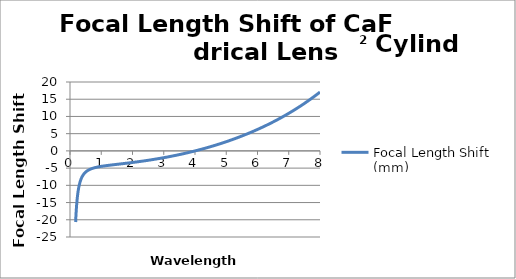
| Category | Focal Length Shift (mm) |
|---|---|
| 0.18 | -20.672 |
| 0.181 | -20.471 |
| 0.182 | -20.273 |
| 0.183 | -20.08 |
| 0.184 | -19.89 |
| 0.185 | -19.704 |
| 0.186 | -19.521 |
| 0.187 | -19.341 |
| 0.188 | -19.165 |
| 0.189 | -18.992 |
| 0.19 | -18.822 |
| 0.191 | -18.655 |
| 0.192 | -18.491 |
| 0.193 | -18.33 |
| 0.194 | -18.172 |
| 0.195 | -18.017 |
| 0.196 | -17.864 |
| 0.197 | -17.714 |
| 0.198 | -17.566 |
| 0.199 | -17.421 |
| 0.2 | -17.279 |
| 0.201 | -17.138 |
| 0.202 | -17.001 |
| 0.203 | -16.865 |
| 0.204 | -16.732 |
| 0.205 | -16.6 |
| 0.206 | -16.471 |
| 0.207 | -16.344 |
| 0.208 | -16.219 |
| 0.209 | -16.096 |
| 0.21 | -15.975 |
| 0.211 | -15.856 |
| 0.212 | -15.739 |
| 0.213 | -15.623 |
| 0.214 | -15.51 |
| 0.215 | -15.398 |
| 0.216 | -15.288 |
| 0.217 | -15.179 |
| 0.218 | -15.072 |
| 0.219 | -14.967 |
| 0.22 | -14.863 |
| 0.221 | -14.761 |
| 0.222 | -14.66 |
| 0.223 | -14.561 |
| 0.224 | -14.463 |
| 0.225 | -14.367 |
| 0.226 | -14.272 |
| 0.227 | -14.178 |
| 0.228 | -14.086 |
| 0.229 | -13.995 |
| 0.23 | -13.905 |
| 0.231 | -13.817 |
| 0.232 | -13.73 |
| 0.233 | -13.644 |
| 0.234 | -13.559 |
| 0.235 | -13.475 |
| 0.236 | -13.393 |
| 0.237 | -13.311 |
| 0.238 | -13.231 |
| 0.239 | -13.152 |
| 0.24 | -13.074 |
| 0.241 | -12.997 |
| 0.242 | -12.921 |
| 0.243 | -12.846 |
| 0.244 | -12.772 |
| 0.245 | -12.698 |
| 0.246 | -12.626 |
| 0.247 | -12.555 |
| 0.248 | -12.485 |
| 0.249 | -12.415 |
| 0.25 | -12.347 |
| 0.251 | -12.279 |
| 0.252 | -12.213 |
| 0.253 | -12.147 |
| 0.254 | -12.081 |
| 0.255 | -12.017 |
| 0.256 | -11.954 |
| 0.257 | -11.891 |
| 0.258 | -11.829 |
| 0.259 | -11.768 |
| 0.26 | -11.707 |
| 0.261 | -11.648 |
| 0.262 | -11.589 |
| 0.263 | -11.531 |
| 0.264 | -11.473 |
| 0.265 | -11.416 |
| 0.266 | -11.36 |
| 0.267 | -11.304 |
| 0.268 | -11.249 |
| 0.269 | -11.195 |
| 0.27 | -11.142 |
| 0.271 | -11.089 |
| 0.272 | -11.036 |
| 0.273 | -10.985 |
| 0.274 | -10.933 |
| 0.275 | -10.883 |
| 0.276 | -10.833 |
| 0.277 | -10.783 |
| 0.278 | -10.734 |
| 0.279 | -10.686 |
| 0.28 | -10.638 |
| 0.281 | -10.591 |
| 0.282 | -10.544 |
| 0.283 | -10.498 |
| 0.284 | -10.452 |
| 0.285 | -10.407 |
| 0.286 | -10.363 |
| 0.287 | -10.318 |
| 0.288 | -10.275 |
| 0.289 | -10.231 |
| 0.29 | -10.189 |
| 0.291 | -10.146 |
| 0.292 | -10.104 |
| 0.293 | -10.063 |
| 0.294 | -10.022 |
| 0.295 | -9.981 |
| 0.296 | -9.941 |
| 0.297 | -9.902 |
| 0.298 | -9.862 |
| 0.299 | -9.823 |
| 0.3 | -9.785 |
| 0.301 | -9.747 |
| 0.302 | -9.709 |
| 0.303 | -9.672 |
| 0.304 | -9.635 |
| 0.305 | -9.598 |
| 0.306 | -9.562 |
| 0.307 | -9.526 |
| 0.308 | -9.491 |
| 0.309 | -9.456 |
| 0.31 | -9.421 |
| 0.311 | -9.387 |
| 0.312 | -9.352 |
| 0.313 | -9.319 |
| 0.314 | -9.285 |
| 0.315 | -9.252 |
| 0.316 | -9.22 |
| 0.317 | -9.187 |
| 0.318 | -9.155 |
| 0.319 | -9.123 |
| 0.32 | -9.092 |
| 0.321 | -9.061 |
| 0.322 | -9.03 |
| 0.323 | -8.999 |
| 0.324 | -8.969 |
| 0.325 | -8.939 |
| 0.326 | -8.909 |
| 0.327 | -8.88 |
| 0.328 | -8.85 |
| 0.329 | -8.822 |
| 0.33 | -8.793 |
| 0.331 | -8.765 |
| 0.332 | -8.736 |
| 0.333 | -8.709 |
| 0.334 | -8.681 |
| 0.335 | -8.654 |
| 0.336 | -8.627 |
| 0.337 | -8.6 |
| 0.338 | -8.573 |
| 0.339 | -8.547 |
| 0.34 | -8.521 |
| 0.341 | -8.495 |
| 0.342 | -8.469 |
| 0.343 | -8.444 |
| 0.344 | -8.419 |
| 0.345 | -8.394 |
| 0.346 | -8.369 |
| 0.347 | -8.344 |
| 0.348 | -8.32 |
| 0.349 | -8.296 |
| 0.35 | -8.272 |
| 0.351 | -8.248 |
| 0.352 | -8.225 |
| 0.353 | -8.202 |
| 0.354 | -8.179 |
| 0.355 | -8.156 |
| 0.356 | -8.133 |
| 0.357 | -8.111 |
| 0.358 | -8.088 |
| 0.359 | -8.066 |
| 0.36 | -8.044 |
| 0.361 | -8.023 |
| 0.362 | -8.001 |
| 0.363 | -7.98 |
| 0.364 | -7.958 |
| 0.365 | -7.937 |
| 0.366 | -7.917 |
| 0.367 | -7.896 |
| 0.368 | -7.875 |
| 0.369 | -7.855 |
| 0.37 | -7.835 |
| 0.371 | -7.815 |
| 0.372 | -7.795 |
| 0.373 | -7.776 |
| 0.374 | -7.756 |
| 0.375 | -7.737 |
| 0.376 | -7.717 |
| 0.377 | -7.698 |
| 0.378 | -7.68 |
| 0.379 | -7.661 |
| 0.38 | -7.642 |
| 0.381 | -7.624 |
| 0.382 | -7.606 |
| 0.383 | -7.587 |
| 0.384 | -7.569 |
| 0.385 | -7.552 |
| 0.386 | -7.534 |
| 0.387 | -7.516 |
| 0.388 | -7.499 |
| 0.389 | -7.481 |
| 0.39 | -7.464 |
| 0.391 | -7.447 |
| 0.392 | -7.43 |
| 0.393 | -7.414 |
| 0.394 | -7.397 |
| 0.395 | -7.38 |
| 0.396 | -7.364 |
| 0.397 | -7.348 |
| 0.398 | -7.332 |
| 0.399 | -7.316 |
| 0.4 | -7.3 |
| 0.401 | -7.284 |
| 0.402 | -7.268 |
| 0.403 | -7.253 |
| 0.404 | -7.237 |
| 0.405 | -7.222 |
| 0.406 | -7.207 |
| 0.407 | -7.192 |
| 0.408 | -7.177 |
| 0.409 | -7.162 |
| 0.41 | -7.147 |
| 0.411 | -7.132 |
| 0.412 | -7.118 |
| 0.413 | -7.103 |
| 0.414 | -7.089 |
| 0.415 | -7.075 |
| 0.416 | -7.061 |
| 0.417 | -7.047 |
| 0.418 | -7.033 |
| 0.419 | -7.019 |
| 0.42 | -7.005 |
| 0.421 | -6.991 |
| 0.422 | -6.978 |
| 0.423 | -6.964 |
| 0.424 | -6.951 |
| 0.425 | -6.938 |
| 0.426 | -6.925 |
| 0.427 | -6.912 |
| 0.428 | -6.899 |
| 0.429 | -6.886 |
| 0.43 | -6.873 |
| 0.431 | -6.86 |
| 0.432 | -6.848 |
| 0.433 | -6.835 |
| 0.434 | -6.823 |
| 0.435 | -6.81 |
| 0.436 | -6.798 |
| 0.437 | -6.786 |
| 0.438 | -6.774 |
| 0.439 | -6.762 |
| 0.44 | -6.75 |
| 0.441 | -6.738 |
| 0.442 | -6.726 |
| 0.443 | -6.714 |
| 0.444 | -6.703 |
| 0.445 | -6.691 |
| 0.446 | -6.68 |
| 0.447 | -6.668 |
| 0.448 | -6.657 |
| 0.449 | -6.646 |
| 0.45 | -6.635 |
| 0.451 | -6.623 |
| 0.452 | -6.612 |
| 0.453 | -6.601 |
| 0.454 | -6.591 |
| 0.455 | -6.58 |
| 0.456 | -6.569 |
| 0.457 | -6.558 |
| 0.458 | -6.548 |
| 0.459 | -6.537 |
| 0.46 | -6.527 |
| 0.461 | -6.516 |
| 0.462 | -6.506 |
| 0.463 | -6.496 |
| 0.464 | -6.486 |
| 0.465 | -6.475 |
| 0.466 | -6.465 |
| 0.467 | -6.455 |
| 0.468 | -6.445 |
| 0.469 | -6.436 |
| 0.47 | -6.426 |
| 0.471 | -6.416 |
| 0.472 | -6.406 |
| 0.473 | -6.397 |
| 0.474 | -6.387 |
| 0.475 | -6.378 |
| 0.476 | -6.368 |
| 0.477 | -6.359 |
| 0.478 | -6.349 |
| 0.479 | -6.34 |
| 0.48 | -6.331 |
| 0.481 | -6.322 |
| 0.482 | -6.312 |
| 0.483 | -6.303 |
| 0.484 | -6.294 |
| 0.485 | -6.285 |
| 0.486 | -6.277 |
| 0.487 | -6.268 |
| 0.488 | -6.259 |
| 0.489 | -6.25 |
| 0.49 | -6.242 |
| 0.491 | -6.233 |
| 0.492 | -6.224 |
| 0.493 | -6.216 |
| 0.494 | -6.207 |
| 0.495 | -6.199 |
| 0.496 | -6.19 |
| 0.497 | -6.182 |
| 0.498 | -6.174 |
| 0.499 | -6.166 |
| 0.5 | -6.157 |
| 0.501 | -6.149 |
| 0.502 | -6.141 |
| 0.503 | -6.133 |
| 0.504 | -6.125 |
| 0.505 | -6.117 |
| 0.506 | -6.109 |
| 0.507 | -6.101 |
| 0.508 | -6.094 |
| 0.509 | -6.086 |
| 0.51 | -6.078 |
| 0.511 | -6.07 |
| 0.512 | -6.063 |
| 0.513 | -6.055 |
| 0.514 | -6.048 |
| 0.515 | -6.04 |
| 0.516 | -6.033 |
| 0.517 | -6.025 |
| 0.518 | -6.018 |
| 0.519 | -6.01 |
| 0.52 | -6.003 |
| 0.521 | -5.996 |
| 0.522 | -5.989 |
| 0.523 | -5.981 |
| 0.524 | -5.974 |
| 0.525 | -5.967 |
| 0.526 | -5.96 |
| 0.527 | -5.953 |
| 0.528 | -5.946 |
| 0.529 | -5.939 |
| 0.53 | -5.932 |
| 0.531 | -5.925 |
| 0.532 | -5.919 |
| 0.533 | -5.912 |
| 0.534 | -5.905 |
| 0.535 | -5.898 |
| 0.536 | -5.892 |
| 0.537 | -5.885 |
| 0.538 | -5.878 |
| 0.539 | -5.872 |
| 0.54 | -5.865 |
| 0.541 | -5.859 |
| 0.542 | -5.852 |
| 0.543 | -5.846 |
| 0.544 | -5.839 |
| 0.545 | -5.833 |
| 0.546 | -5.827 |
| 0.547 | -5.82 |
| 0.548 | -5.814 |
| 0.549 | -5.808 |
| 0.55 | -5.801 |
| 0.551 | -5.795 |
| 0.552 | -5.789 |
| 0.553 | -5.783 |
| 0.554 | -5.777 |
| 0.555 | -5.771 |
| 0.556 | -5.765 |
| 0.557 | -5.759 |
| 0.558 | -5.753 |
| 0.559 | -5.747 |
| 0.56 | -5.741 |
| 0.561 | -5.735 |
| 0.562 | -5.729 |
| 0.563 | -5.724 |
| 0.564 | -5.718 |
| 0.565 | -5.712 |
| 0.566 | -5.706 |
| 0.567 | -5.701 |
| 0.568 | -5.695 |
| 0.569 | -5.689 |
| 0.57 | -5.684 |
| 0.571 | -5.678 |
| 0.572 | -5.672 |
| 0.573 | -5.667 |
| 0.574 | -5.661 |
| 0.575 | -5.656 |
| 0.576 | -5.65 |
| 0.577 | -5.645 |
| 0.578 | -5.64 |
| 0.579 | -5.634 |
| 0.58 | -5.629 |
| 0.581 | -5.624 |
| 0.582 | -5.618 |
| 0.583 | -5.613 |
| 0.584 | -5.608 |
| 0.585 | -5.603 |
| 0.586 | -5.597 |
| 0.587 | -5.592 |
| 0.588 | -5.587 |
| 0.589 | -5.582 |
| 0.59 | -5.577 |
| 0.591 | -5.572 |
| 0.592 | -5.567 |
| 0.593 | -5.562 |
| 0.594 | -5.557 |
| 0.595 | -5.552 |
| 0.596 | -5.547 |
| 0.597 | -5.542 |
| 0.598 | -5.537 |
| 0.599 | -5.532 |
| 0.6 | -5.527 |
| 0.601 | -5.522 |
| 0.602 | -5.518 |
| 0.603 | -5.513 |
| 0.604 | -5.508 |
| 0.605 | -5.503 |
| 0.606 | -5.498 |
| 0.607 | -5.494 |
| 0.608 | -5.489 |
| 0.609 | -5.484 |
| 0.61 | -5.48 |
| 0.611 | -5.475 |
| 0.612 | -5.471 |
| 0.613 | -5.466 |
| 0.614 | -5.461 |
| 0.615 | -5.457 |
| 0.616 | -5.452 |
| 0.617 | -5.448 |
| 0.618 | -5.443 |
| 0.619 | -5.439 |
| 0.62 | -5.434 |
| 0.621 | -5.43 |
| 0.622 | -5.426 |
| 0.623 | -5.421 |
| 0.624 | -5.417 |
| 0.625 | -5.413 |
| 0.626 | -5.408 |
| 0.627 | -5.404 |
| 0.628 | -5.4 |
| 0.629 | -5.395 |
| 0.63 | -5.391 |
| 0.631 | -5.387 |
| 0.632 | -5.383 |
| 0.633 | -5.378 |
| 0.634 | -5.374 |
| 0.635 | -5.37 |
| 0.636 | -5.366 |
| 0.637 | -5.362 |
| 0.638 | -5.358 |
| 0.639 | -5.354 |
| 0.64 | -5.35 |
| 0.641 | -5.346 |
| 0.642 | -5.341 |
| 0.643 | -5.337 |
| 0.644 | -5.333 |
| 0.645 | -5.329 |
| 0.646 | -5.325 |
| 0.647 | -5.322 |
| 0.648 | -5.318 |
| 0.649 | -5.314 |
| 0.65 | -5.31 |
| 0.651 | -5.306 |
| 0.652 | -5.302 |
| 0.653 | -5.298 |
| 0.654 | -5.294 |
| 0.655 | -5.29 |
| 0.656 | -5.287 |
| 0.657 | -5.283 |
| 0.658 | -5.279 |
| 0.659 | -5.275 |
| 0.66 | -5.272 |
| 0.661 | -5.268 |
| 0.662 | -5.264 |
| 0.663 | -5.26 |
| 0.664 | -5.257 |
| 0.665 | -5.253 |
| 0.666 | -5.249 |
| 0.667 | -5.246 |
| 0.668 | -5.242 |
| 0.669 | -5.238 |
| 0.67 | -5.235 |
| 0.671 | -5.231 |
| 0.672 | -5.228 |
| 0.673 | -5.224 |
| 0.674 | -5.221 |
| 0.675 | -5.217 |
| 0.676 | -5.214 |
| 0.677 | -5.21 |
| 0.678 | -5.207 |
| 0.679 | -5.203 |
| 0.68 | -5.2 |
| 0.681 | -5.196 |
| 0.682 | -5.193 |
| 0.683 | -5.189 |
| 0.684 | -5.186 |
| 0.685 | -5.182 |
| 0.686 | -5.179 |
| 0.687 | -5.176 |
| 0.688 | -5.172 |
| 0.689 | -5.169 |
| 0.69 | -5.166 |
| 0.691 | -5.162 |
| 0.692 | -5.159 |
| 0.693 | -5.156 |
| 0.694 | -5.152 |
| 0.695 | -5.149 |
| 0.696 | -5.146 |
| 0.697 | -5.143 |
| 0.698 | -5.139 |
| 0.699 | -5.136 |
| 0.7 | -5.133 |
| 0.701 | -5.13 |
| 0.702 | -5.127 |
| 0.703 | -5.123 |
| 0.704 | -5.12 |
| 0.705 | -5.117 |
| 0.706 | -5.114 |
| 0.707 | -5.111 |
| 0.708 | -5.108 |
| 0.709 | -5.105 |
| 0.71 | -5.102 |
| 0.711 | -5.098 |
| 0.712 | -5.095 |
| 0.713 | -5.092 |
| 0.714 | -5.089 |
| 0.715 | -5.086 |
| 0.716 | -5.083 |
| 0.717 | -5.08 |
| 0.718 | -5.077 |
| 0.719 | -5.074 |
| 0.72 | -5.071 |
| 0.721 | -5.068 |
| 0.722 | -5.065 |
| 0.723 | -5.062 |
| 0.724 | -5.059 |
| 0.725 | -5.056 |
| 0.726 | -5.053 |
| 0.727 | -5.05 |
| 0.728 | -5.048 |
| 0.729 | -5.045 |
| 0.73 | -5.042 |
| 0.731 | -5.039 |
| 0.732 | -5.036 |
| 0.733 | -5.033 |
| 0.734 | -5.03 |
| 0.735 | -5.028 |
| 0.736 | -5.025 |
| 0.737 | -5.022 |
| 0.738 | -5.019 |
| 0.739 | -5.016 |
| 0.74 | -5.013 |
| 0.741 | -5.011 |
| 0.742 | -5.008 |
| 0.743 | -5.005 |
| 0.744 | -5.002 |
| 0.745 | -5 |
| 0.746 | -4.997 |
| 0.747 | -4.994 |
| 0.748 | -4.991 |
| 0.749 | -4.989 |
| 0.75 | -4.986 |
| 0.751 | -4.983 |
| 0.752 | -4.981 |
| 0.753 | -4.978 |
| 0.754 | -4.975 |
| 0.755 | -4.973 |
| 0.756 | -4.97 |
| 0.757 | -4.967 |
| 0.758 | -4.965 |
| 0.759 | -4.962 |
| 0.76 | -4.96 |
| 0.761 | -4.957 |
| 0.762 | -4.954 |
| 0.763 | -4.952 |
| 0.764 | -4.949 |
| 0.765 | -4.947 |
| 0.766 | -4.944 |
| 0.767 | -4.941 |
| 0.768 | -4.939 |
| 0.769 | -4.936 |
| 0.77 | -4.934 |
| 0.771 | -4.931 |
| 0.772 | -4.929 |
| 0.773 | -4.926 |
| 0.774 | -4.924 |
| 0.775 | -4.921 |
| 0.776 | -4.919 |
| 0.777 | -4.916 |
| 0.778 | -4.914 |
| 0.779 | -4.911 |
| 0.78 | -4.909 |
| 0.781 | -4.906 |
| 0.782 | -4.904 |
| 0.783 | -4.902 |
| 0.784 | -4.899 |
| 0.785 | -4.897 |
| 0.786 | -4.894 |
| 0.787 | -4.892 |
| 0.788 | -4.89 |
| 0.789 | -4.887 |
| 0.79 | -4.885 |
| 0.791 | -4.882 |
| 0.792 | -4.88 |
| 0.793 | -4.878 |
| 0.794 | -4.875 |
| 0.795 | -4.873 |
| 0.796 | -4.871 |
| 0.797 | -4.868 |
| 0.798 | -4.866 |
| 0.799 | -4.864 |
| 0.8 | -4.861 |
| 0.801 | -4.859 |
| 0.802 | -4.857 |
| 0.803 | -4.854 |
| 0.804 | -4.852 |
| 0.805 | -4.85 |
| 0.806 | -4.848 |
| 0.807 | -4.845 |
| 0.808 | -4.843 |
| 0.809 | -4.841 |
| 0.81 | -4.839 |
| 0.811 | -4.836 |
| 0.812 | -4.834 |
| 0.813 | -4.832 |
| 0.814 | -4.83 |
| 0.815 | -4.827 |
| 0.816 | -4.825 |
| 0.817 | -4.823 |
| 0.818 | -4.821 |
| 0.819 | -4.819 |
| 0.82 | -4.816 |
| 0.821 | -4.814 |
| 0.822 | -4.812 |
| 0.823 | -4.81 |
| 0.824 | -4.808 |
| 0.825 | -4.806 |
| 0.826 | -4.803 |
| 0.827 | -4.801 |
| 0.828 | -4.799 |
| 0.829 | -4.797 |
| 0.83 | -4.795 |
| 0.831 | -4.793 |
| 0.832 | -4.791 |
| 0.833 | -4.788 |
| 0.834 | -4.786 |
| 0.835 | -4.784 |
| 0.836 | -4.782 |
| 0.837 | -4.78 |
| 0.838 | -4.778 |
| 0.839 | -4.776 |
| 0.84 | -4.774 |
| 0.841 | -4.772 |
| 0.842 | -4.77 |
| 0.843 | -4.768 |
| 0.844 | -4.766 |
| 0.845 | -4.764 |
| 0.846 | -4.762 |
| 0.847 | -4.759 |
| 0.848 | -4.757 |
| 0.849 | -4.755 |
| 0.85 | -4.753 |
| 0.851 | -4.751 |
| 0.852 | -4.749 |
| 0.853 | -4.747 |
| 0.854 | -4.745 |
| 0.855 | -4.743 |
| 0.856 | -4.741 |
| 0.857 | -4.739 |
| 0.858 | -4.737 |
| 0.859 | -4.735 |
| 0.86 | -4.733 |
| 0.861 | -4.731 |
| 0.862 | -4.73 |
| 0.863 | -4.728 |
| 0.864 | -4.726 |
| 0.865 | -4.724 |
| 0.866 | -4.722 |
| 0.867 | -4.72 |
| 0.868 | -4.718 |
| 0.869 | -4.716 |
| 0.87 | -4.714 |
| 0.871 | -4.712 |
| 0.872 | -4.71 |
| 0.873 | -4.708 |
| 0.874 | -4.706 |
| 0.875 | -4.704 |
| 0.876 | -4.703 |
| 0.877 | -4.701 |
| 0.878 | -4.699 |
| 0.879 | -4.697 |
| 0.88 | -4.695 |
| 0.881 | -4.693 |
| 0.882 | -4.691 |
| 0.883 | -4.689 |
| 0.884 | -4.688 |
| 0.885 | -4.686 |
| 0.886 | -4.684 |
| 0.887 | -4.682 |
| 0.888 | -4.68 |
| 0.889 | -4.678 |
| 0.89 | -4.676 |
| 0.891 | -4.675 |
| 0.892 | -4.673 |
| 0.893 | -4.671 |
| 0.894 | -4.669 |
| 0.895 | -4.667 |
| 0.896 | -4.666 |
| 0.897 | -4.664 |
| 0.898 | -4.662 |
| 0.899 | -4.66 |
| 0.9 | -4.658 |
| 0.901 | -4.657 |
| 0.902 | -4.655 |
| 0.903 | -4.653 |
| 0.904 | -4.651 |
| 0.905 | -4.649 |
| 0.906 | -4.648 |
| 0.907 | -4.646 |
| 0.908 | -4.644 |
| 0.909 | -4.642 |
| 0.91 | -4.641 |
| 0.911 | -4.639 |
| 0.912 | -4.637 |
| 0.913 | -4.635 |
| 0.914 | -4.634 |
| 0.915 | -4.632 |
| 0.916 | -4.63 |
| 0.917 | -4.628 |
| 0.918 | -4.627 |
| 0.919 | -4.625 |
| 0.92 | -4.623 |
| 0.921 | -4.622 |
| 0.922 | -4.62 |
| 0.923 | -4.618 |
| 0.924 | -4.616 |
| 0.925 | -4.615 |
| 0.926 | -4.613 |
| 0.927 | -4.611 |
| 0.928 | -4.61 |
| 0.929 | -4.608 |
| 0.93 | -4.606 |
| 0.931 | -4.605 |
| 0.932 | -4.603 |
| 0.933 | -4.601 |
| 0.934 | -4.6 |
| 0.935 | -4.598 |
| 0.936 | -4.596 |
| 0.937 | -4.595 |
| 0.938 | -4.593 |
| 0.939 | -4.591 |
| 0.94 | -4.59 |
| 0.941 | -4.588 |
| 0.942 | -4.586 |
| 0.943 | -4.585 |
| 0.944 | -4.583 |
| 0.945 | -4.581 |
| 0.946 | -4.58 |
| 0.947 | -4.578 |
| 0.948 | -4.577 |
| 0.949 | -4.575 |
| 0.95 | -4.573 |
| 0.951 | -4.572 |
| 0.952 | -4.57 |
| 0.953 | -4.568 |
| 0.954 | -4.567 |
| 0.955 | -4.565 |
| 0.956 | -4.564 |
| 0.957 | -4.562 |
| 0.958 | -4.56 |
| 0.959 | -4.559 |
| 0.96 | -4.557 |
| 0.961 | -4.556 |
| 0.962 | -4.554 |
| 0.963 | -4.553 |
| 0.964 | -4.551 |
| 0.965 | -4.549 |
| 0.966 | -4.548 |
| 0.967 | -4.546 |
| 0.968 | -4.545 |
| 0.969 | -4.543 |
| 0.97 | -4.542 |
| 0.971 | -4.54 |
| 0.972 | -4.538 |
| 0.973 | -4.537 |
| 0.974 | -4.535 |
| 0.975 | -4.534 |
| 0.976 | -4.532 |
| 0.977 | -4.531 |
| 0.978 | -4.529 |
| 0.979 | -4.528 |
| 0.98 | -4.526 |
| 0.981 | -4.525 |
| 0.982 | -4.523 |
| 0.983 | -4.522 |
| 0.984 | -4.52 |
| 0.985 | -4.519 |
| 0.986 | -4.517 |
| 0.987 | -4.515 |
| 0.988 | -4.514 |
| 0.989 | -4.512 |
| 0.99 | -4.511 |
| 0.991 | -4.509 |
| 0.992 | -4.508 |
| 0.993 | -4.506 |
| 0.994 | -4.505 |
| 0.995 | -4.503 |
| 0.996 | -4.502 |
| 0.997 | -4.5 |
| 0.998 | -4.499 |
| 0.999 | -4.498 |
| 1.0 | -4.496 |
| 1.001 | -4.495 |
| 1.002 | -4.493 |
| 1.003 | -4.492 |
| 1.004 | -4.49 |
| 1.005 | -4.489 |
| 1.006 | -4.487 |
| 1.007 | -4.486 |
| 1.008 | -4.484 |
| 1.009 | -4.483 |
| 1.01 | -4.481 |
| 1.011 | -4.48 |
| 1.012 | -4.478 |
| 1.013 | -4.477 |
| 1.014 | -4.476 |
| 1.015 | -4.474 |
| 1.016 | -4.473 |
| 1.017 | -4.471 |
| 1.018 | -4.47 |
| 1.019 | -4.468 |
| 1.02 | -4.467 |
| 1.021 | -4.465 |
| 1.022 | -4.464 |
| 1.023 | -4.463 |
| 1.024 | -4.461 |
| 1.025 | -4.46 |
| 1.026 | -4.458 |
| 1.027 | -4.457 |
| 1.028 | -4.455 |
| 1.029 | -4.454 |
| 1.03 | -4.453 |
| 1.031 | -4.451 |
| 1.032 | -4.45 |
| 1.033 | -4.448 |
| 1.034 | -4.447 |
| 1.035 | -4.446 |
| 1.036 | -4.444 |
| 1.037 | -4.443 |
| 1.038 | -4.441 |
| 1.039 | -4.44 |
| 1.04 | -4.439 |
| 1.041 | -4.437 |
| 1.042 | -4.436 |
| 1.043 | -4.434 |
| 1.044 | -4.433 |
| 1.045 | -4.432 |
| 1.046 | -4.43 |
| 1.047 | -4.429 |
| 1.048 | -4.428 |
| 1.049 | -4.426 |
| 1.05 | -4.425 |
| 1.051 | -4.423 |
| 1.052 | -4.422 |
| 1.053 | -4.421 |
| 1.054 | -4.419 |
| 1.055 | -4.418 |
| 1.056 | -4.417 |
| 1.057 | -4.415 |
| 1.058 | -4.414 |
| 1.059 | -4.413 |
| 1.06 | -4.411 |
| 1.061 | -4.41 |
| 1.062 | -4.408 |
| 1.063 | -4.407 |
| 1.064 | -4.406 |
| 1.065 | -4.404 |
| 1.066 | -4.403 |
| 1.067 | -4.402 |
| 1.068 | -4.4 |
| 1.069 | -4.399 |
| 1.07 | -4.398 |
| 1.071 | -4.396 |
| 1.072 | -4.395 |
| 1.073 | -4.394 |
| 1.074 | -4.392 |
| 1.075 | -4.391 |
| 1.076 | -4.39 |
| 1.077 | -4.388 |
| 1.078 | -4.387 |
| 1.079 | -4.386 |
| 1.08 | -4.384 |
| 1.081 | -4.383 |
| 1.082 | -4.382 |
| 1.083 | -4.38 |
| 1.084 | -4.379 |
| 1.085 | -4.378 |
| 1.086 | -4.377 |
| 1.087 | -4.375 |
| 1.088 | -4.374 |
| 1.089 | -4.373 |
| 1.09 | -4.371 |
| 1.091 | -4.37 |
| 1.092 | -4.369 |
| 1.093 | -4.367 |
| 1.094 | -4.366 |
| 1.095 | -4.365 |
| 1.096 | -4.364 |
| 1.097 | -4.362 |
| 1.098 | -4.361 |
| 1.099 | -4.36 |
| 1.1 | -4.358 |
| 1.101 | -4.357 |
| 1.102 | -4.356 |
| 1.103 | -4.354 |
| 1.104 | -4.353 |
| 1.105 | -4.352 |
| 1.106 | -4.351 |
| 1.107 | -4.349 |
| 1.108 | -4.348 |
| 1.109 | -4.347 |
| 1.11 | -4.346 |
| 1.111 | -4.344 |
| 1.112 | -4.343 |
| 1.113 | -4.342 |
| 1.114 | -4.34 |
| 1.115 | -4.339 |
| 1.116 | -4.338 |
| 1.117 | -4.337 |
| 1.118 | -4.335 |
| 1.119 | -4.334 |
| 1.12 | -4.333 |
| 1.121 | -4.332 |
| 1.122 | -4.33 |
| 1.123 | -4.329 |
| 1.124 | -4.328 |
| 1.125 | -4.327 |
| 1.126 | -4.325 |
| 1.127 | -4.324 |
| 1.128 | -4.323 |
| 1.129 | -4.322 |
| 1.13 | -4.32 |
| 1.131 | -4.319 |
| 1.132 | -4.318 |
| 1.133 | -4.317 |
| 1.134 | -4.315 |
| 1.135 | -4.314 |
| 1.136 | -4.313 |
| 1.137 | -4.312 |
| 1.138 | -4.31 |
| 1.139 | -4.309 |
| 1.14 | -4.308 |
| 1.141 | -4.307 |
| 1.142 | -4.305 |
| 1.143 | -4.304 |
| 1.144 | -4.303 |
| 1.145 | -4.302 |
| 1.146 | -4.301 |
| 1.147 | -4.299 |
| 1.148 | -4.298 |
| 1.149 | -4.297 |
| 1.15 | -4.296 |
| 1.151 | -4.294 |
| 1.152 | -4.293 |
| 1.153 | -4.292 |
| 1.154 | -4.291 |
| 1.155 | -4.29 |
| 1.156 | -4.288 |
| 1.157 | -4.287 |
| 1.158 | -4.286 |
| 1.159 | -4.285 |
| 1.16 | -4.283 |
| 1.161 | -4.282 |
| 1.162 | -4.281 |
| 1.163 | -4.28 |
| 1.164 | -4.279 |
| 1.165 | -4.277 |
| 1.166 | -4.276 |
| 1.167 | -4.275 |
| 1.168 | -4.274 |
| 1.169 | -4.273 |
| 1.17 | -4.271 |
| 1.171 | -4.27 |
| 1.172 | -4.269 |
| 1.173 | -4.268 |
| 1.174 | -4.267 |
| 1.175 | -4.265 |
| 1.176 | -4.264 |
| 1.177 | -4.263 |
| 1.178 | -4.262 |
| 1.179 | -4.261 |
| 1.18 | -4.259 |
| 1.181 | -4.258 |
| 1.182 | -4.257 |
| 1.183 | -4.256 |
| 1.184 | -4.255 |
| 1.185 | -4.253 |
| 1.186 | -4.252 |
| 1.187 | -4.251 |
| 1.188 | -4.25 |
| 1.189 | -4.249 |
| 1.19 | -4.248 |
| 1.191 | -4.246 |
| 1.192 | -4.245 |
| 1.193 | -4.244 |
| 1.194 | -4.243 |
| 1.195 | -4.242 |
| 1.196 | -4.24 |
| 1.197 | -4.239 |
| 1.198 | -4.238 |
| 1.199 | -4.237 |
| 1.2 | -4.236 |
| 1.201 | -4.235 |
| 1.202 | -4.233 |
| 1.203 | -4.232 |
| 1.204 | -4.231 |
| 1.205 | -4.23 |
| 1.206 | -4.229 |
| 1.207 | -4.228 |
| 1.208 | -4.226 |
| 1.209 | -4.225 |
| 1.21 | -4.224 |
| 1.211 | -4.223 |
| 1.212 | -4.222 |
| 1.213 | -4.221 |
| 1.214 | -4.219 |
| 1.215 | -4.218 |
| 1.216 | -4.217 |
| 1.217 | -4.216 |
| 1.218 | -4.215 |
| 1.219 | -4.214 |
| 1.22 | -4.213 |
| 1.221 | -4.211 |
| 1.222 | -4.21 |
| 1.223 | -4.209 |
| 1.224 | -4.208 |
| 1.225 | -4.207 |
| 1.226 | -4.206 |
| 1.227 | -4.204 |
| 1.228 | -4.203 |
| 1.229 | -4.202 |
| 1.23 | -4.201 |
| 1.231 | -4.2 |
| 1.232 | -4.199 |
| 1.233 | -4.198 |
| 1.234 | -4.196 |
| 1.235 | -4.195 |
| 1.236 | -4.194 |
| 1.237 | -4.193 |
| 1.238 | -4.192 |
| 1.239 | -4.191 |
| 1.24 | -4.19 |
| 1.241 | -4.188 |
| 1.242 | -4.187 |
| 1.243 | -4.186 |
| 1.244 | -4.185 |
| 1.245 | -4.184 |
| 1.246 | -4.183 |
| 1.247 | -4.182 |
| 1.248 | -4.18 |
| 1.249 | -4.179 |
| 1.25 | -4.178 |
| 1.251 | -4.177 |
| 1.252 | -4.176 |
| 1.253 | -4.175 |
| 1.254 | -4.174 |
| 1.255 | -4.173 |
| 1.256 | -4.171 |
| 1.257 | -4.17 |
| 1.258 | -4.169 |
| 1.259 | -4.168 |
| 1.26 | -4.167 |
| 1.261 | -4.166 |
| 1.262 | -4.165 |
| 1.263 | -4.164 |
| 1.264 | -4.162 |
| 1.265 | -4.161 |
| 1.266 | -4.16 |
| 1.267 | -4.159 |
| 1.268 | -4.158 |
| 1.269 | -4.157 |
| 1.27 | -4.156 |
| 1.271 | -4.155 |
| 1.272 | -4.153 |
| 1.273 | -4.152 |
| 1.274 | -4.151 |
| 1.275 | -4.15 |
| 1.276 | -4.149 |
| 1.277 | -4.148 |
| 1.278 | -4.147 |
| 1.279 | -4.146 |
| 1.28 | -4.144 |
| 1.281 | -4.143 |
| 1.282 | -4.142 |
| 1.283 | -4.141 |
| 1.284 | -4.14 |
| 1.285 | -4.139 |
| 1.286 | -4.138 |
| 1.287 | -4.137 |
| 1.288 | -4.136 |
| 1.289 | -4.134 |
| 1.29 | -4.133 |
| 1.291 | -4.132 |
| 1.292 | -4.131 |
| 1.293 | -4.13 |
| 1.294 | -4.129 |
| 1.295 | -4.128 |
| 1.296 | -4.127 |
| 1.297 | -4.126 |
| 1.298 | -4.125 |
| 1.299 | -4.123 |
| 1.3 | -4.122 |
| 1.301 | -4.121 |
| 1.302 | -4.12 |
| 1.303 | -4.119 |
| 1.304 | -4.118 |
| 1.305 | -4.117 |
| 1.306 | -4.116 |
| 1.307 | -4.115 |
| 1.308 | -4.113 |
| 1.309 | -4.112 |
| 1.31 | -4.111 |
| 1.311 | -4.11 |
| 1.312 | -4.109 |
| 1.313 | -4.108 |
| 1.314 | -4.107 |
| 1.315 | -4.106 |
| 1.316 | -4.105 |
| 1.317 | -4.104 |
| 1.318 | -4.103 |
| 1.319 | -4.101 |
| 1.32 | -4.1 |
| 1.321 | -4.099 |
| 1.322 | -4.098 |
| 1.323 | -4.097 |
| 1.324 | -4.096 |
| 1.325 | -4.095 |
| 1.326 | -4.094 |
| 1.327 | -4.093 |
| 1.328 | -4.092 |
| 1.329 | -4.09 |
| 1.33 | -4.089 |
| 1.331 | -4.088 |
| 1.332 | -4.087 |
| 1.333 | -4.086 |
| 1.334 | -4.085 |
| 1.335 | -4.084 |
| 1.336 | -4.083 |
| 1.337 | -4.082 |
| 1.338 | -4.081 |
| 1.339 | -4.08 |
| 1.34 | -4.079 |
| 1.341 | -4.077 |
| 1.342 | -4.076 |
| 1.343 | -4.075 |
| 1.344 | -4.074 |
| 1.345 | -4.073 |
| 1.346 | -4.072 |
| 1.347 | -4.071 |
| 1.348 | -4.07 |
| 1.349 | -4.069 |
| 1.35 | -4.068 |
| 1.351 | -4.067 |
| 1.352 | -4.066 |
| 1.353 | -4.064 |
| 1.354 | -4.063 |
| 1.355 | -4.062 |
| 1.356 | -4.061 |
| 1.357 | -4.06 |
| 1.358 | -4.059 |
| 1.359 | -4.058 |
| 1.36 | -4.057 |
| 1.361 | -4.056 |
| 1.362 | -4.055 |
| 1.363 | -4.054 |
| 1.364 | -4.053 |
| 1.365 | -4.051 |
| 1.366 | -4.05 |
| 1.367 | -4.049 |
| 1.368 | -4.048 |
| 1.369 | -4.047 |
| 1.37 | -4.046 |
| 1.371 | -4.045 |
| 1.372 | -4.044 |
| 1.373 | -4.043 |
| 1.374 | -4.042 |
| 1.375 | -4.041 |
| 1.376 | -4.04 |
| 1.377 | -4.039 |
| 1.378 | -4.037 |
| 1.379 | -4.036 |
| 1.38 | -4.035 |
| 1.381 | -4.034 |
| 1.382 | -4.033 |
| 1.383 | -4.032 |
| 1.384 | -4.031 |
| 1.385 | -4.03 |
| 1.386 | -4.029 |
| 1.387 | -4.028 |
| 1.388 | -4.027 |
| 1.389 | -4.026 |
| 1.39 | -4.025 |
| 1.391 | -4.024 |
| 1.392 | -4.022 |
| 1.393 | -4.021 |
| 1.394 | -4.02 |
| 1.395 | -4.019 |
| 1.396 | -4.018 |
| 1.397 | -4.017 |
| 1.398 | -4.016 |
| 1.399 | -4.015 |
| 1.4 | -4.014 |
| 1.401 | -4.013 |
| 1.402 | -4.012 |
| 1.403 | -4.011 |
| 1.404 | -4.01 |
| 1.405 | -4.009 |
| 1.406 | -4.008 |
| 1.407 | -4.006 |
| 1.408 | -4.005 |
| 1.409 | -4.004 |
| 1.41 | -4.003 |
| 1.411 | -4.002 |
| 1.412 | -4.001 |
| 1.413 | -4 |
| 1.414 | -3.999 |
| 1.415 | -3.998 |
| 1.416 | -3.997 |
| 1.417 | -3.996 |
| 1.418 | -3.995 |
| 1.419 | -3.994 |
| 1.42 | -3.993 |
| 1.421 | -3.992 |
| 1.422 | -3.99 |
| 1.423 | -3.989 |
| 1.424 | -3.988 |
| 1.425 | -3.987 |
| 1.426 | -3.986 |
| 1.427 | -3.985 |
| 1.428 | -3.984 |
| 1.429 | -3.983 |
| 1.43 | -3.982 |
| 1.431 | -3.981 |
| 1.432 | -3.98 |
| 1.433 | -3.979 |
| 1.434 | -3.978 |
| 1.435 | -3.977 |
| 1.436 | -3.976 |
| 1.437 | -3.975 |
| 1.438 | -3.973 |
| 1.439 | -3.972 |
| 1.44 | -3.971 |
| 1.441 | -3.97 |
| 1.442 | -3.969 |
| 1.443 | -3.968 |
| 1.444 | -3.967 |
| 1.445 | -3.966 |
| 1.446 | -3.965 |
| 1.447 | -3.964 |
| 1.448 | -3.963 |
| 1.449 | -3.962 |
| 1.45 | -3.961 |
| 1.451 | -3.96 |
| 1.452 | -3.959 |
| 1.453 | -3.958 |
| 1.454 | -3.957 |
| 1.455 | -3.955 |
| 1.456 | -3.954 |
| 1.457 | -3.953 |
| 1.458 | -3.952 |
| 1.459 | -3.951 |
| 1.46 | -3.95 |
| 1.461 | -3.949 |
| 1.462 | -3.948 |
| 1.463 | -3.947 |
| 1.464 | -3.946 |
| 1.465 | -3.945 |
| 1.466 | -3.944 |
| 1.467 | -3.943 |
| 1.468 | -3.942 |
| 1.469 | -3.941 |
| 1.47 | -3.94 |
| 1.471 | -3.939 |
| 1.472 | -3.938 |
| 1.473 | -3.936 |
| 1.474 | -3.935 |
| 1.475 | -3.934 |
| 1.476 | -3.933 |
| 1.477 | -3.932 |
| 1.478 | -3.931 |
| 1.479 | -3.93 |
| 1.48 | -3.929 |
| 1.481 | -3.928 |
| 1.482 | -3.927 |
| 1.483 | -3.926 |
| 1.484 | -3.925 |
| 1.485 | -3.924 |
| 1.486 | -3.923 |
| 1.487 | -3.922 |
| 1.488 | -3.921 |
| 1.489 | -3.92 |
| 1.49 | -3.918 |
| 1.491 | -3.917 |
| 1.492 | -3.916 |
| 1.493 | -3.915 |
| 1.494 | -3.914 |
| 1.495 | -3.913 |
| 1.496 | -3.912 |
| 1.497 | -3.911 |
| 1.498 | -3.91 |
| 1.499 | -3.909 |
| 1.5 | -3.908 |
| 1.501 | -3.907 |
| 1.502 | -3.906 |
| 1.503 | -3.905 |
| 1.504 | -3.904 |
| 1.505 | -3.903 |
| 1.506 | -3.902 |
| 1.507 | -3.901 |
| 1.508 | -3.9 |
| 1.509 | -3.898 |
| 1.51 | -3.897 |
| 1.511 | -3.896 |
| 1.512 | -3.895 |
| 1.513 | -3.894 |
| 1.514 | -3.893 |
| 1.515 | -3.892 |
| 1.516 | -3.891 |
| 1.517 | -3.89 |
| 1.518 | -3.889 |
| 1.519 | -3.888 |
| 1.52 | -3.887 |
| 1.521 | -3.886 |
| 1.522 | -3.885 |
| 1.523 | -3.884 |
| 1.524 | -3.883 |
| 1.525 | -3.882 |
| 1.526 | -3.881 |
| 1.527 | -3.879 |
| 1.528 | -3.878 |
| 1.529 | -3.877 |
| 1.53 | -3.876 |
| 1.531 | -3.875 |
| 1.532 | -3.874 |
| 1.533 | -3.873 |
| 1.534 | -3.872 |
| 1.535 | -3.871 |
| 1.536 | -3.87 |
| 1.537 | -3.869 |
| 1.538 | -3.868 |
| 1.539 | -3.867 |
| 1.54 | -3.866 |
| 1.541 | -3.865 |
| 1.542 | -3.864 |
| 1.543 | -3.863 |
| 1.544 | -3.862 |
| 1.545 | -3.861 |
| 1.546 | -3.859 |
| 1.547 | -3.858 |
| 1.548 | -3.857 |
| 1.549 | -3.856 |
| 1.55 | -3.855 |
| 1.551 | -3.854 |
| 1.552 | -3.853 |
| 1.553 | -3.852 |
| 1.554 | -3.851 |
| 1.555 | -3.85 |
| 1.556 | -3.849 |
| 1.557 | -3.848 |
| 1.558 | -3.847 |
| 1.559 | -3.846 |
| 1.56 | -3.845 |
| 1.561 | -3.844 |
| 1.562 | -3.843 |
| 1.563 | -3.842 |
| 1.564 | -3.84 |
| 1.565 | -3.839 |
| 1.566 | -3.838 |
| 1.567 | -3.837 |
| 1.568 | -3.836 |
| 1.569 | -3.835 |
| 1.57 | -3.834 |
| 1.571 | -3.833 |
| 1.572 | -3.832 |
| 1.573 | -3.831 |
| 1.574 | -3.83 |
| 1.575 | -3.829 |
| 1.576 | -3.828 |
| 1.577 | -3.827 |
| 1.578 | -3.826 |
| 1.579 | -3.825 |
| 1.58 | -3.824 |
| 1.581 | -3.823 |
| 1.582 | -3.822 |
| 1.583 | -3.82 |
| 1.584 | -3.819 |
| 1.585 | -3.818 |
| 1.586 | -3.817 |
| 1.587 | -3.816 |
| 1.588 | -3.815 |
| 1.589 | -3.814 |
| 1.59 | -3.813 |
| 1.591 | -3.812 |
| 1.592 | -3.811 |
| 1.593 | -3.81 |
| 1.594 | -3.809 |
| 1.595 | -3.808 |
| 1.596 | -3.807 |
| 1.597 | -3.806 |
| 1.598 | -3.805 |
| 1.599 | -3.804 |
| 1.6 | -3.802 |
| 1.601 | -3.801 |
| 1.602 | -3.8 |
| 1.603 | -3.799 |
| 1.604 | -3.798 |
| 1.605 | -3.797 |
| 1.606 | -3.796 |
| 1.607 | -3.795 |
| 1.608 | -3.794 |
| 1.609 | -3.793 |
| 1.61 | -3.792 |
| 1.611 | -3.791 |
| 1.612 | -3.79 |
| 1.613 | -3.789 |
| 1.614 | -3.788 |
| 1.615 | -3.787 |
| 1.616 | -3.786 |
| 1.617 | -3.785 |
| 1.618 | -3.783 |
| 1.619 | -3.782 |
| 1.62 | -3.781 |
| 1.621 | -3.78 |
| 1.622 | -3.779 |
| 1.623 | -3.778 |
| 1.624 | -3.777 |
| 1.625 | -3.776 |
| 1.626 | -3.775 |
| 1.627 | -3.774 |
| 1.628 | -3.773 |
| 1.629 | -3.772 |
| 1.63 | -3.771 |
| 1.631 | -3.77 |
| 1.632 | -3.769 |
| 1.633 | -3.768 |
| 1.634 | -3.766 |
| 1.635 | -3.765 |
| 1.636 | -3.764 |
| 1.637 | -3.763 |
| 1.638 | -3.762 |
| 1.639 | -3.761 |
| 1.64 | -3.76 |
| 1.641 | -3.759 |
| 1.642 | -3.758 |
| 1.643 | -3.757 |
| 1.644 | -3.756 |
| 1.645 | -3.755 |
| 1.646 | -3.754 |
| 1.647 | -3.753 |
| 1.648 | -3.752 |
| 1.649 | -3.751 |
| 1.65 | -3.75 |
| 1.651 | -3.748 |
| 1.652 | -3.747 |
| 1.653 | -3.746 |
| 1.654 | -3.745 |
| 1.655 | -3.744 |
| 1.656 | -3.743 |
| 1.657 | -3.742 |
| 1.658 | -3.741 |
| 1.659 | -3.74 |
| 1.66 | -3.739 |
| 1.661 | -3.738 |
| 1.662 | -3.737 |
| 1.663 | -3.736 |
| 1.664 | -3.735 |
| 1.665 | -3.734 |
| 1.666 | -3.732 |
| 1.667 | -3.731 |
| 1.668 | -3.73 |
| 1.669 | -3.729 |
| 1.67 | -3.728 |
| 1.671 | -3.727 |
| 1.672 | -3.726 |
| 1.673 | -3.725 |
| 1.674 | -3.724 |
| 1.675 | -3.723 |
| 1.676 | -3.722 |
| 1.677 | -3.721 |
| 1.678 | -3.72 |
| 1.679 | -3.719 |
| 1.68 | -3.718 |
| 1.681 | -3.716 |
| 1.682 | -3.715 |
| 1.683 | -3.714 |
| 1.684 | -3.713 |
| 1.685 | -3.712 |
| 1.686 | -3.711 |
| 1.687 | -3.71 |
| 1.688 | -3.709 |
| 1.689 | -3.708 |
| 1.69 | -3.707 |
| 1.691 | -3.706 |
| 1.692 | -3.705 |
| 1.693 | -3.704 |
| 1.694 | -3.703 |
| 1.695 | -3.702 |
| 1.696 | -3.7 |
| 1.697 | -3.699 |
| 1.698 | -3.698 |
| 1.699 | -3.697 |
| 1.7 | -3.696 |
| 1.701 | -3.695 |
| 1.702 | -3.694 |
| 1.703 | -3.693 |
| 1.704 | -3.692 |
| 1.705 | -3.691 |
| 1.706 | -3.69 |
| 1.707 | -3.689 |
| 1.708 | -3.688 |
| 1.709 | -3.687 |
| 1.71 | -3.685 |
| 1.711 | -3.684 |
| 1.712 | -3.683 |
| 1.713 | -3.682 |
| 1.714 | -3.681 |
| 1.715 | -3.68 |
| 1.716 | -3.679 |
| 1.717 | -3.678 |
| 1.718 | -3.677 |
| 1.719 | -3.676 |
| 1.72 | -3.675 |
| 1.721 | -3.674 |
| 1.722 | -3.673 |
| 1.723 | -3.672 |
| 1.724 | -3.67 |
| 1.725 | -3.669 |
| 1.726 | -3.668 |
| 1.727 | -3.667 |
| 1.728 | -3.666 |
| 1.729 | -3.665 |
| 1.73 | -3.664 |
| 1.731 | -3.663 |
| 1.732 | -3.662 |
| 1.733 | -3.661 |
| 1.734 | -3.66 |
| 1.735 | -3.659 |
| 1.736 | -3.658 |
| 1.737 | -3.656 |
| 1.738 | -3.655 |
| 1.739 | -3.654 |
| 1.74 | -3.653 |
| 1.741 | -3.652 |
| 1.742 | -3.651 |
| 1.743 | -3.65 |
| 1.744 | -3.649 |
| 1.745 | -3.648 |
| 1.746 | -3.647 |
| 1.747 | -3.646 |
| 1.748 | -3.645 |
| 1.749 | -3.643 |
| 1.75 | -3.642 |
| 1.751 | -3.641 |
| 1.752 | -3.64 |
| 1.753 | -3.639 |
| 1.754 | -3.638 |
| 1.755 | -3.637 |
| 1.756 | -3.636 |
| 1.757 | -3.635 |
| 1.758 | -3.634 |
| 1.759 | -3.633 |
| 1.76 | -3.632 |
| 1.761 | -3.63 |
| 1.762 | -3.629 |
| 1.763 | -3.628 |
| 1.764 | -3.627 |
| 1.765 | -3.626 |
| 1.766 | -3.625 |
| 1.767 | -3.624 |
| 1.768 | -3.623 |
| 1.769 | -3.622 |
| 1.77 | -3.621 |
| 1.771 | -3.62 |
| 1.772 | -3.619 |
| 1.773 | -3.617 |
| 1.774 | -3.616 |
| 1.775 | -3.615 |
| 1.776 | -3.614 |
| 1.777 | -3.613 |
| 1.778 | -3.612 |
| 1.779 | -3.611 |
| 1.78 | -3.61 |
| 1.781 | -3.609 |
| 1.782 | -3.608 |
| 1.783 | -3.607 |
| 1.784 | -3.605 |
| 1.785 | -3.604 |
| 1.786 | -3.603 |
| 1.787 | -3.602 |
| 1.788 | -3.601 |
| 1.789 | -3.6 |
| 1.79 | -3.599 |
| 1.791 | -3.598 |
| 1.792 | -3.597 |
| 1.793 | -3.596 |
| 1.794 | -3.595 |
| 1.795 | -3.593 |
| 1.796 | -3.592 |
| 1.797 | -3.591 |
| 1.798 | -3.59 |
| 1.799 | -3.589 |
| 1.8 | -3.588 |
| 1.801 | -3.587 |
| 1.802 | -3.586 |
| 1.803 | -3.585 |
| 1.804 | -3.584 |
| 1.805 | -3.583 |
| 1.806 | -3.581 |
| 1.807 | -3.58 |
| 1.808 | -3.579 |
| 1.809 | -3.578 |
| 1.81 | -3.577 |
| 1.811 | -3.576 |
| 1.812 | -3.575 |
| 1.813 | -3.574 |
| 1.814 | -3.573 |
| 1.815 | -3.572 |
| 1.816 | -3.57 |
| 1.817 | -3.569 |
| 1.818 | -3.568 |
| 1.819 | -3.567 |
| 1.82 | -3.566 |
| 1.821 | -3.565 |
| 1.822 | -3.564 |
| 1.823 | -3.563 |
| 1.824 | -3.562 |
| 1.825 | -3.561 |
| 1.826 | -3.559 |
| 1.827 | -3.558 |
| 1.828 | -3.557 |
| 1.829 | -3.556 |
| 1.83 | -3.555 |
| 1.831 | -3.554 |
| 1.832 | -3.553 |
| 1.833 | -3.552 |
| 1.834 | -3.551 |
| 1.835 | -3.55 |
| 1.836 | -3.548 |
| 1.837 | -3.547 |
| 1.838 | -3.546 |
| 1.839 | -3.545 |
| 1.84 | -3.544 |
| 1.841 | -3.543 |
| 1.842 | -3.542 |
| 1.843 | -3.541 |
| 1.844 | -3.54 |
| 1.845 | -3.539 |
| 1.846 | -3.537 |
| 1.847 | -3.536 |
| 1.848 | -3.535 |
| 1.849 | -3.534 |
| 1.85 | -3.533 |
| 1.851 | -3.532 |
| 1.852 | -3.531 |
| 1.853 | -3.53 |
| 1.854 | -3.529 |
| 1.855 | -3.527 |
| 1.856 | -3.526 |
| 1.857 | -3.525 |
| 1.858 | -3.524 |
| 1.859 | -3.523 |
| 1.86 | -3.522 |
| 1.861 | -3.521 |
| 1.862 | -3.52 |
| 1.863 | -3.519 |
| 1.864 | -3.517 |
| 1.865 | -3.516 |
| 1.866 | -3.515 |
| 1.867 | -3.514 |
| 1.868 | -3.513 |
| 1.869 | -3.512 |
| 1.87 | -3.511 |
| 1.871 | -3.51 |
| 1.872 | -3.509 |
| 1.873 | -3.507 |
| 1.874 | -3.506 |
| 1.875 | -3.505 |
| 1.876 | -3.504 |
| 1.877 | -3.503 |
| 1.878 | -3.502 |
| 1.879 | -3.501 |
| 1.88 | -3.5 |
| 1.881 | -3.499 |
| 1.882 | -3.497 |
| 1.883 | -3.496 |
| 1.884 | -3.495 |
| 1.885 | -3.494 |
| 1.886 | -3.493 |
| 1.887 | -3.492 |
| 1.888 | -3.491 |
| 1.889 | -3.49 |
| 1.89 | -3.488 |
| 1.891 | -3.487 |
| 1.892 | -3.486 |
| 1.893 | -3.485 |
| 1.894 | -3.484 |
| 1.895 | -3.483 |
| 1.896 | -3.482 |
| 1.897 | -3.481 |
| 1.898 | -3.479 |
| 1.899 | -3.478 |
| 1.9 | -3.477 |
| 1.901 | -3.476 |
| 1.902 | -3.475 |
| 1.903 | -3.474 |
| 1.904 | -3.473 |
| 1.905 | -3.472 |
| 1.906 | -3.47 |
| 1.907 | -3.469 |
| 1.908 | -3.468 |
| 1.909 | -3.467 |
| 1.91 | -3.466 |
| 1.911 | -3.465 |
| 1.912 | -3.464 |
| 1.913 | -3.463 |
| 1.914 | -3.461 |
| 1.915 | -3.46 |
| 1.916 | -3.459 |
| 1.917 | -3.458 |
| 1.918 | -3.457 |
| 1.919 | -3.456 |
| 1.92 | -3.455 |
| 1.921 | -3.454 |
| 1.922 | -3.452 |
| 1.923 | -3.451 |
| 1.924 | -3.45 |
| 1.925 | -3.449 |
| 1.926 | -3.448 |
| 1.927 | -3.447 |
| 1.928 | -3.446 |
| 1.929 | -3.445 |
| 1.93 | -3.443 |
| 1.931 | -3.442 |
| 1.932 | -3.441 |
| 1.933 | -3.44 |
| 1.934 | -3.439 |
| 1.935 | -3.438 |
| 1.936 | -3.437 |
| 1.937 | -3.435 |
| 1.938 | -3.434 |
| 1.939 | -3.433 |
| 1.94 | -3.432 |
| 1.941 | -3.431 |
| 1.942 | -3.43 |
| 1.943 | -3.429 |
| 1.944 | -3.428 |
| 1.945 | -3.426 |
| 1.946 | -3.425 |
| 1.947 | -3.424 |
| 1.948 | -3.423 |
| 1.949 | -3.422 |
| 1.95 | -3.421 |
| 1.951 | -3.42 |
| 1.952 | -3.418 |
| 1.953 | -3.417 |
| 1.954 | -3.416 |
| 1.955 | -3.415 |
| 1.956 | -3.414 |
| 1.957 | -3.413 |
| 1.958 | -3.412 |
| 1.959 | -3.41 |
| 1.96 | -3.409 |
| 1.961 | -3.408 |
| 1.962 | -3.407 |
| 1.963 | -3.406 |
| 1.964 | -3.405 |
| 1.965 | -3.404 |
| 1.966 | -3.402 |
| 1.967 | -3.401 |
| 1.968 | -3.4 |
| 1.969 | -3.399 |
| 1.97 | -3.398 |
| 1.971 | -3.397 |
| 1.972 | -3.396 |
| 1.973 | -3.394 |
| 1.974 | -3.393 |
| 1.975 | -3.392 |
| 1.976 | -3.391 |
| 1.977 | -3.39 |
| 1.978 | -3.389 |
| 1.979 | -3.387 |
| 1.98 | -3.386 |
| 1.981 | -3.385 |
| 1.982 | -3.384 |
| 1.983 | -3.383 |
| 1.984 | -3.382 |
| 1.985 | -3.381 |
| 1.986 | -3.379 |
| 1.987 | -3.378 |
| 1.988 | -3.377 |
| 1.989 | -3.376 |
| 1.99 | -3.375 |
| 1.991 | -3.374 |
| 1.992 | -3.372 |
| 1.993 | -3.371 |
| 1.994 | -3.37 |
| 1.995 | -3.369 |
| 1.996 | -3.368 |
| 1.997 | -3.367 |
| 1.998 | -3.366 |
| 1.999 | -3.364 |
| 2.0 | -3.363 |
| 2.001 | -3.362 |
| 2.002 | -3.361 |
| 2.003 | -3.36 |
| 2.004 | -3.359 |
| 2.005 | -3.357 |
| 2.006 | -3.356 |
| 2.007 | -3.355 |
| 2.008 | -3.354 |
| 2.009 | -3.353 |
| 2.01 | -3.352 |
| 2.011 | -3.35 |
| 2.012 | -3.349 |
| 2.013 | -3.348 |
| 2.014 | -3.347 |
| 2.015 | -3.346 |
| 2.016 | -3.345 |
| 2.017 | -3.344 |
| 2.018 | -3.342 |
| 2.019 | -3.341 |
| 2.02 | -3.34 |
| 2.021 | -3.339 |
| 2.022 | -3.338 |
| 2.023 | -3.336 |
| 2.024 | -3.335 |
| 2.025 | -3.334 |
| 2.026 | -3.333 |
| 2.027 | -3.332 |
| 2.028 | -3.331 |
| 2.029 | -3.33 |
| 2.03 | -3.328 |
| 2.031 | -3.327 |
| 2.032 | -3.326 |
| 2.033 | -3.325 |
| 2.034 | -3.324 |
| 2.035 | -3.322 |
| 2.036 | -3.321 |
| 2.037 | -3.32 |
| 2.038 | -3.319 |
| 2.039 | -3.318 |
| 2.04 | -3.317 |
| 2.041 | -3.315 |
| 2.042 | -3.314 |
| 2.043 | -3.313 |
| 2.044 | -3.312 |
| 2.045 | -3.311 |
| 2.046 | -3.31 |
| 2.047 | -3.308 |
| 2.048 | -3.307 |
| 2.049 | -3.306 |
| 2.05 | -3.305 |
| 2.051 | -3.304 |
| 2.052 | -3.303 |
| 2.053 | -3.301 |
| 2.054 | -3.3 |
| 2.055 | -3.299 |
| 2.056 | -3.298 |
| 2.057 | -3.297 |
| 2.058 | -3.295 |
| 2.059 | -3.294 |
| 2.06 | -3.293 |
| 2.061 | -3.292 |
| 2.062 | -3.291 |
| 2.063 | -3.29 |
| 2.064 | -3.288 |
| 2.065 | -3.287 |
| 2.066 | -3.286 |
| 2.067 | -3.285 |
| 2.068 | -3.284 |
| 2.069 | -3.282 |
| 2.07 | -3.281 |
| 2.071 | -3.28 |
| 2.072 | -3.279 |
| 2.073 | -3.278 |
| 2.074 | -3.277 |
| 2.075 | -3.275 |
| 2.076 | -3.274 |
| 2.077 | -3.273 |
| 2.078 | -3.272 |
| 2.079 | -3.271 |
| 2.08 | -3.269 |
| 2.081 | -3.268 |
| 2.082 | -3.267 |
| 2.083 | -3.266 |
| 2.084 | -3.265 |
| 2.085 | -3.263 |
| 2.086 | -3.262 |
| 2.087 | -3.261 |
| 2.088 | -3.26 |
| 2.089 | -3.259 |
| 2.09 | -3.258 |
| 2.091 | -3.256 |
| 2.092 | -3.255 |
| 2.093 | -3.254 |
| 2.094 | -3.253 |
| 2.095 | -3.252 |
| 2.096 | -3.25 |
| 2.097 | -3.249 |
| 2.098 | -3.248 |
| 2.099 | -3.247 |
| 2.1 | -3.246 |
| 2.101 | -3.244 |
| 2.102 | -3.243 |
| 2.103 | -3.242 |
| 2.104 | -3.241 |
| 2.105 | -3.24 |
| 2.106 | -3.238 |
| 2.107 | -3.237 |
| 2.108 | -3.236 |
| 2.109 | -3.235 |
| 2.11 | -3.234 |
| 2.111 | -3.232 |
| 2.112 | -3.231 |
| 2.113 | -3.23 |
| 2.114 | -3.229 |
| 2.115 | -3.228 |
| 2.116 | -3.226 |
| 2.117 | -3.225 |
| 2.118 | -3.224 |
| 2.119 | -3.223 |
| 2.12 | -3.222 |
| 2.121 | -3.22 |
| 2.122 | -3.219 |
| 2.123 | -3.218 |
| 2.124 | -3.217 |
| 2.125 | -3.216 |
| 2.126 | -3.214 |
| 2.127 | -3.213 |
| 2.128 | -3.212 |
| 2.129 | -3.211 |
| 2.13 | -3.209 |
| 2.131 | -3.208 |
| 2.132 | -3.207 |
| 2.133 | -3.206 |
| 2.134 | -3.205 |
| 2.135 | -3.203 |
| 2.136 | -3.202 |
| 2.137 | -3.201 |
| 2.138 | -3.2 |
| 2.139 | -3.199 |
| 2.14 | -3.197 |
| 2.141 | -3.196 |
| 2.142 | -3.195 |
| 2.143 | -3.194 |
| 2.144 | -3.193 |
| 2.145 | -3.191 |
| 2.146 | -3.19 |
| 2.147 | -3.189 |
| 2.148 | -3.188 |
| 2.149 | -3.186 |
| 2.15 | -3.185 |
| 2.151 | -3.184 |
| 2.152 | -3.183 |
| 2.153 | -3.182 |
| 2.154 | -3.18 |
| 2.155 | -3.179 |
| 2.156 | -3.178 |
| 2.157 | -3.177 |
| 2.158 | -3.175 |
| 2.159 | -3.174 |
| 2.16 | -3.173 |
| 2.161 | -3.172 |
| 2.162 | -3.171 |
| 2.163 | -3.169 |
| 2.164 | -3.168 |
| 2.165 | -3.167 |
| 2.166 | -3.166 |
| 2.167 | -3.164 |
| 2.168 | -3.163 |
| 2.169 | -3.162 |
| 2.17 | -3.161 |
| 2.171 | -3.16 |
| 2.172 | -3.158 |
| 2.173 | -3.157 |
| 2.174 | -3.156 |
| 2.175 | -3.155 |
| 2.176 | -3.153 |
| 2.177 | -3.152 |
| 2.178 | -3.151 |
| 2.179 | -3.15 |
| 2.18 | -3.148 |
| 2.181 | -3.147 |
| 2.182 | -3.146 |
| 2.183 | -3.145 |
| 2.184 | -3.144 |
| 2.185 | -3.142 |
| 2.186 | -3.141 |
| 2.187 | -3.14 |
| 2.188 | -3.139 |
| 2.189 | -3.137 |
| 2.19 | -3.136 |
| 2.191 | -3.135 |
| 2.192 | -3.134 |
| 2.193 | -3.132 |
| 2.194 | -3.131 |
| 2.195 | -3.13 |
| 2.196 | -3.129 |
| 2.197 | -3.128 |
| 2.198 | -3.126 |
| 2.199 | -3.125 |
| 2.2 | -3.124 |
| 2.201 | -3.123 |
| 2.202 | -3.121 |
| 2.203 | -3.12 |
| 2.204 | -3.119 |
| 2.205 | -3.118 |
| 2.206 | -3.116 |
| 2.207 | -3.115 |
| 2.208 | -3.114 |
| 2.209 | -3.113 |
| 2.21 | -3.111 |
| 2.211 | -3.11 |
| 2.212 | -3.109 |
| 2.213 | -3.108 |
| 2.214 | -3.106 |
| 2.215 | -3.105 |
| 2.216 | -3.104 |
| 2.217 | -3.103 |
| 2.218 | -3.101 |
| 2.219 | -3.1 |
| 2.22 | -3.099 |
| 2.221 | -3.098 |
| 2.222 | -3.096 |
| 2.223 | -3.095 |
| 2.224 | -3.094 |
| 2.225 | -3.093 |
| 2.226 | -3.091 |
| 2.227 | -3.09 |
| 2.228 | -3.089 |
| 2.229 | -3.088 |
| 2.23 | -3.086 |
| 2.231 | -3.085 |
| 2.232 | -3.084 |
| 2.233 | -3.083 |
| 2.234 | -3.081 |
| 2.235 | -3.08 |
| 2.236 | -3.079 |
| 2.237 | -3.078 |
| 2.238 | -3.076 |
| 2.239 | -3.075 |
| 2.24 | -3.074 |
| 2.241 | -3.073 |
| 2.242 | -3.071 |
| 2.243 | -3.07 |
| 2.244 | -3.069 |
| 2.245 | -3.068 |
| 2.246 | -3.066 |
| 2.247 | -3.065 |
| 2.248 | -3.064 |
| 2.249 | -3.063 |
| 2.25 | -3.061 |
| 2.251 | -3.06 |
| 2.252 | -3.059 |
| 2.253 | -3.058 |
| 2.254 | -3.056 |
| 2.255 | -3.055 |
| 2.256 | -3.054 |
| 2.257 | -3.052 |
| 2.258 | -3.051 |
| 2.259 | -3.05 |
| 2.26 | -3.049 |
| 2.261 | -3.047 |
| 2.262 | -3.046 |
| 2.263 | -3.045 |
| 2.264 | -3.044 |
| 2.265 | -3.042 |
| 2.266 | -3.041 |
| 2.267 | -3.04 |
| 2.268 | -3.039 |
| 2.269 | -3.037 |
| 2.27 | -3.036 |
| 2.271 | -3.035 |
| 2.272 | -3.033 |
| 2.273 | -3.032 |
| 2.274 | -3.031 |
| 2.275 | -3.03 |
| 2.276 | -3.028 |
| 2.277 | -3.027 |
| 2.278 | -3.026 |
| 2.279 | -3.025 |
| 2.28 | -3.023 |
| 2.281 | -3.022 |
| 2.282 | -3.021 |
| 2.283 | -3.019 |
| 2.284 | -3.018 |
| 2.285 | -3.017 |
| 2.286 | -3.016 |
| 2.287 | -3.014 |
| 2.288 | -3.013 |
| 2.289 | -3.012 |
| 2.29 | -3.011 |
| 2.291 | -3.009 |
| 2.292 | -3.008 |
| 2.293 | -3.007 |
| 2.294 | -3.005 |
| 2.295 | -3.004 |
| 2.296 | -3.003 |
| 2.297 | -3.002 |
| 2.298 | -3 |
| 2.299 | -2.999 |
| 2.3 | -2.998 |
| 2.301 | -2.996 |
| 2.302 | -2.995 |
| 2.303 | -2.994 |
| 2.304 | -2.993 |
| 2.305 | -2.991 |
| 2.306 | -2.99 |
| 2.307 | -2.989 |
| 2.308 | -2.987 |
| 2.309 | -2.986 |
| 2.31 | -2.985 |
| 2.311 | -2.984 |
| 2.312 | -2.982 |
| 2.313 | -2.981 |
| 2.314 | -2.98 |
| 2.315 | -2.978 |
| 2.316 | -2.977 |
| 2.317 | -2.976 |
| 2.318 | -2.975 |
| 2.319 | -2.973 |
| 2.32 | -2.972 |
| 2.321 | -2.971 |
| 2.322 | -2.969 |
| 2.323 | -2.968 |
| 2.324 | -2.967 |
| 2.325 | -2.965 |
| 2.326 | -2.964 |
| 2.327 | -2.963 |
| 2.328 | -2.962 |
| 2.329 | -2.96 |
| 2.33 | -2.959 |
| 2.331 | -2.958 |
| 2.332 | -2.956 |
| 2.333 | -2.955 |
| 2.334 | -2.954 |
| 2.335 | -2.952 |
| 2.336 | -2.951 |
| 2.337 | -2.95 |
| 2.338 | -2.949 |
| 2.339 | -2.947 |
| 2.34 | -2.946 |
| 2.341 | -2.945 |
| 2.342 | -2.943 |
| 2.343 | -2.942 |
| 2.344 | -2.941 |
| 2.345 | -2.939 |
| 2.346 | -2.938 |
| 2.347 | -2.937 |
| 2.348 | -2.936 |
| 2.349 | -2.934 |
| 2.35 | -2.933 |
| 2.351 | -2.932 |
| 2.352 | -2.93 |
| 2.353 | -2.929 |
| 2.354 | -2.928 |
| 2.355 | -2.926 |
| 2.356 | -2.925 |
| 2.357 | -2.924 |
| 2.358 | -2.922 |
| 2.359 | -2.921 |
| 2.36 | -2.92 |
| 2.361 | -2.919 |
| 2.362 | -2.917 |
| 2.363 | -2.916 |
| 2.364 | -2.915 |
| 2.365 | -2.913 |
| 2.366 | -2.912 |
| 2.367 | -2.911 |
| 2.368 | -2.909 |
| 2.369 | -2.908 |
| 2.37 | -2.907 |
| 2.371 | -2.905 |
| 2.372 | -2.904 |
| 2.373 | -2.903 |
| 2.374 | -2.901 |
| 2.375 | -2.9 |
| 2.376 | -2.899 |
| 2.377 | -2.897 |
| 2.378 | -2.896 |
| 2.379 | -2.895 |
| 2.38 | -2.894 |
| 2.381 | -2.892 |
| 2.382 | -2.891 |
| 2.383 | -2.89 |
| 2.384 | -2.888 |
| 2.385 | -2.887 |
| 2.386 | -2.886 |
| 2.387 | -2.884 |
| 2.388 | -2.883 |
| 2.389 | -2.882 |
| 2.39 | -2.88 |
| 2.391 | -2.879 |
| 2.392 | -2.878 |
| 2.393 | -2.876 |
| 2.394 | -2.875 |
| 2.395 | -2.874 |
| 2.396 | -2.872 |
| 2.397 | -2.871 |
| 2.398 | -2.87 |
| 2.399 | -2.868 |
| 2.4 | -2.867 |
| 2.401 | -2.866 |
| 2.402 | -2.864 |
| 2.403 | -2.863 |
| 2.404 | -2.862 |
| 2.405 | -2.86 |
| 2.406 | -2.859 |
| 2.407 | -2.858 |
| 2.408 | -2.856 |
| 2.409 | -2.855 |
| 2.41 | -2.854 |
| 2.411 | -2.852 |
| 2.412 | -2.851 |
| 2.413 | -2.85 |
| 2.414 | -2.848 |
| 2.415 | -2.847 |
| 2.416 | -2.846 |
| 2.417 | -2.844 |
| 2.418 | -2.843 |
| 2.419 | -2.842 |
| 2.42 | -2.84 |
| 2.421 | -2.839 |
| 2.422 | -2.838 |
| 2.423 | -2.836 |
| 2.424 | -2.835 |
| 2.425 | -2.834 |
| 2.426 | -2.832 |
| 2.427 | -2.831 |
| 2.428 | -2.83 |
| 2.429 | -2.828 |
| 2.43 | -2.827 |
| 2.431 | -2.825 |
| 2.432 | -2.824 |
| 2.433 | -2.823 |
| 2.434 | -2.821 |
| 2.435 | -2.82 |
| 2.436 | -2.819 |
| 2.437 | -2.817 |
| 2.438 | -2.816 |
| 2.439 | -2.815 |
| 2.44 | -2.813 |
| 2.441 | -2.812 |
| 2.442 | -2.811 |
| 2.443 | -2.809 |
| 2.444 | -2.808 |
| 2.445 | -2.807 |
| 2.446 | -2.805 |
| 2.447 | -2.804 |
| 2.448 | -2.803 |
| 2.449 | -2.801 |
| 2.45 | -2.8 |
| 2.451 | -2.798 |
| 2.452 | -2.797 |
| 2.453 | -2.796 |
| 2.454 | -2.794 |
| 2.455 | -2.793 |
| 2.456 | -2.792 |
| 2.457 | -2.79 |
| 2.458 | -2.789 |
| 2.459 | -2.788 |
| 2.46 | -2.786 |
| 2.461 | -2.785 |
| 2.462 | -2.784 |
| 2.463 | -2.782 |
| 2.464 | -2.781 |
| 2.465 | -2.779 |
| 2.466 | -2.778 |
| 2.467 | -2.777 |
| 2.468 | -2.775 |
| 2.469 | -2.774 |
| 2.47 | -2.773 |
| 2.471 | -2.771 |
| 2.472 | -2.77 |
| 2.473 | -2.768 |
| 2.474 | -2.767 |
| 2.475 | -2.766 |
| 2.476 | -2.764 |
| 2.477 | -2.763 |
| 2.478 | -2.762 |
| 2.479 | -2.76 |
| 2.48 | -2.759 |
| 2.481 | -2.758 |
| 2.482 | -2.756 |
| 2.483 | -2.755 |
| 2.484 | -2.753 |
| 2.485 | -2.752 |
| 2.486 | -2.751 |
| 2.487 | -2.749 |
| 2.488 | -2.748 |
| 2.489 | -2.747 |
| 2.49 | -2.745 |
| 2.491 | -2.744 |
| 2.492 | -2.742 |
| 2.493 | -2.741 |
| 2.494 | -2.74 |
| 2.495 | -2.738 |
| 2.496 | -2.737 |
| 2.497 | -2.736 |
| 2.498 | -2.734 |
| 2.499 | -2.733 |
| 2.5 | -2.731 |
| 2.501 | -2.73 |
| 2.502 | -2.729 |
| 2.503 | -2.727 |
| 2.504 | -2.726 |
| 2.505 | -2.724 |
| 2.506 | -2.723 |
| 2.507 | -2.722 |
| 2.508 | -2.72 |
| 2.509 | -2.719 |
| 2.51 | -2.718 |
| 2.511 | -2.716 |
| 2.512 | -2.715 |
| 2.513 | -2.713 |
| 2.514 | -2.712 |
| 2.515 | -2.711 |
| 2.516 | -2.709 |
| 2.517 | -2.708 |
| 2.518 | -2.706 |
| 2.519 | -2.705 |
| 2.52 | -2.704 |
| 2.521 | -2.702 |
| 2.522 | -2.701 |
| 2.523 | -2.7 |
| 2.524 | -2.698 |
| 2.525 | -2.697 |
| 2.526 | -2.695 |
| 2.527 | -2.694 |
| 2.528 | -2.693 |
| 2.529 | -2.691 |
| 2.53 | -2.69 |
| 2.531 | -2.688 |
| 2.532 | -2.687 |
| 2.533 | -2.686 |
| 2.534 | -2.684 |
| 2.535 | -2.683 |
| 2.536 | -2.681 |
| 2.537 | -2.68 |
| 2.538 | -2.679 |
| 2.539 | -2.677 |
| 2.54 | -2.676 |
| 2.541 | -2.674 |
| 2.542 | -2.673 |
| 2.543 | -2.672 |
| 2.544 | -2.67 |
| 2.545 | -2.669 |
| 2.546 | -2.667 |
| 2.547 | -2.666 |
| 2.548 | -2.665 |
| 2.549 | -2.663 |
| 2.55 | -2.662 |
| 2.551 | -2.66 |
| 2.552 | -2.659 |
| 2.553 | -2.658 |
| 2.554 | -2.656 |
| 2.555 | -2.655 |
| 2.556 | -2.653 |
| 2.557 | -2.652 |
| 2.558 | -2.65 |
| 2.559 | -2.649 |
| 2.56 | -2.648 |
| 2.561 | -2.646 |
| 2.562 | -2.645 |
| 2.563 | -2.643 |
| 2.564 | -2.642 |
| 2.565 | -2.641 |
| 2.566 | -2.639 |
| 2.567 | -2.638 |
| 2.568 | -2.636 |
| 2.569 | -2.635 |
| 2.57 | -2.634 |
| 2.571 | -2.632 |
| 2.572 | -2.631 |
| 2.573 | -2.629 |
| 2.574 | -2.628 |
| 2.575 | -2.626 |
| 2.576 | -2.625 |
| 2.577 | -2.624 |
| 2.578 | -2.622 |
| 2.579 | -2.621 |
| 2.58 | -2.619 |
| 2.581 | -2.618 |
| 2.582 | -2.616 |
| 2.583 | -2.615 |
| 2.584 | -2.614 |
| 2.585 | -2.612 |
| 2.586 | -2.611 |
| 2.587 | -2.609 |
| 2.588 | -2.608 |
| 2.589 | -2.606 |
| 2.59 | -2.605 |
| 2.591 | -2.604 |
| 2.592 | -2.602 |
| 2.593 | -2.601 |
| 2.594 | -2.599 |
| 2.595 | -2.598 |
| 2.596 | -2.596 |
| 2.597 | -2.595 |
| 2.598 | -2.594 |
| 2.599 | -2.592 |
| 2.6 | -2.591 |
| 2.601 | -2.589 |
| 2.602 | -2.588 |
| 2.603 | -2.586 |
| 2.604 | -2.585 |
| 2.605 | -2.584 |
| 2.606 | -2.582 |
| 2.607 | -2.581 |
| 2.608 | -2.579 |
| 2.609 | -2.578 |
| 2.61 | -2.576 |
| 2.611 | -2.575 |
| 2.612 | -2.574 |
| 2.613 | -2.572 |
| 2.614 | -2.571 |
| 2.615 | -2.569 |
| 2.616 | -2.568 |
| 2.617 | -2.566 |
| 2.618 | -2.565 |
| 2.619 | -2.563 |
| 2.62 | -2.562 |
| 2.621 | -2.561 |
| 2.622 | -2.559 |
| 2.623 | -2.558 |
| 2.624 | -2.556 |
| 2.625 | -2.555 |
| 2.626 | -2.553 |
| 2.627 | -2.552 |
| 2.628 | -2.55 |
| 2.629 | -2.549 |
| 2.63 | -2.548 |
| 2.631 | -2.546 |
| 2.632 | -2.545 |
| 2.633 | -2.543 |
| 2.634 | -2.542 |
| 2.635 | -2.54 |
| 2.636 | -2.539 |
| 2.637 | -2.537 |
| 2.638 | -2.536 |
| 2.639 | -2.535 |
| 2.64 | -2.533 |
| 2.641 | -2.532 |
| 2.642 | -2.53 |
| 2.643 | -2.529 |
| 2.644 | -2.527 |
| 2.645 | -2.526 |
| 2.646 | -2.524 |
| 2.647 | -2.523 |
| 2.648 | -2.521 |
| 2.649 | -2.52 |
| 2.65 | -2.519 |
| 2.651 | -2.517 |
| 2.652 | -2.516 |
| 2.653 | -2.514 |
| 2.654 | -2.513 |
| 2.655 | -2.511 |
| 2.656 | -2.51 |
| 2.657 | -2.508 |
| 2.658 | -2.507 |
| 2.659 | -2.505 |
| 2.66 | -2.504 |
| 2.661 | -2.502 |
| 2.662 | -2.501 |
| 2.663 | -2.5 |
| 2.664 | -2.498 |
| 2.665 | -2.497 |
| 2.666 | -2.495 |
| 2.667 | -2.494 |
| 2.668 | -2.492 |
| 2.669 | -2.491 |
| 2.67 | -2.489 |
| 2.671 | -2.488 |
| 2.672 | -2.486 |
| 2.673 | -2.485 |
| 2.674 | -2.483 |
| 2.675 | -2.482 |
| 2.676 | -2.48 |
| 2.677 | -2.479 |
| 2.678 | -2.477 |
| 2.679 | -2.476 |
| 2.68 | -2.475 |
| 2.681 | -2.473 |
| 2.682 | -2.472 |
| 2.683 | -2.47 |
| 2.684 | -2.469 |
| 2.685 | -2.467 |
| 2.686 | -2.466 |
| 2.687 | -2.464 |
| 2.688 | -2.463 |
| 2.689 | -2.461 |
| 2.69 | -2.46 |
| 2.691 | -2.458 |
| 2.692 | -2.457 |
| 2.693 | -2.455 |
| 2.694 | -2.454 |
| 2.695 | -2.452 |
| 2.696 | -2.451 |
| 2.697 | -2.449 |
| 2.698 | -2.448 |
| 2.699 | -2.446 |
| 2.7 | -2.445 |
| 2.701 | -2.443 |
| 2.702 | -2.442 |
| 2.703 | -2.44 |
| 2.704 | -2.439 |
| 2.705 | -2.437 |
| 2.706 | -2.436 |
| 2.707 | -2.435 |
| 2.708 | -2.433 |
| 2.709 | -2.432 |
| 2.71 | -2.43 |
| 2.711 | -2.429 |
| 2.712 | -2.427 |
| 2.713 | -2.426 |
| 2.714 | -2.424 |
| 2.715 | -2.423 |
| 2.716 | -2.421 |
| 2.717 | -2.42 |
| 2.718 | -2.418 |
| 2.719 | -2.417 |
| 2.72 | -2.415 |
| 2.721 | -2.414 |
| 2.722 | -2.412 |
| 2.723 | -2.411 |
| 2.724 | -2.409 |
| 2.725 | -2.408 |
| 2.726 | -2.406 |
| 2.727 | -2.405 |
| 2.728 | -2.403 |
| 2.729 | -2.402 |
| 2.73 | -2.4 |
| 2.731 | -2.399 |
| 2.732 | -2.397 |
| 2.733 | -2.396 |
| 2.734 | -2.394 |
| 2.735 | -2.393 |
| 2.736 | -2.391 |
| 2.737 | -2.39 |
| 2.738 | -2.388 |
| 2.739 | -2.387 |
| 2.74 | -2.385 |
| 2.741 | -2.384 |
| 2.742 | -2.382 |
| 2.743 | -2.381 |
| 2.744 | -2.379 |
| 2.745 | -2.378 |
| 2.746 | -2.376 |
| 2.747 | -2.375 |
| 2.748 | -2.373 |
| 2.749 | -2.372 |
| 2.75 | -2.37 |
| 2.751 | -2.368 |
| 2.752 | -2.367 |
| 2.753 | -2.365 |
| 2.754 | -2.364 |
| 2.755 | -2.362 |
| 2.756 | -2.361 |
| 2.757 | -2.359 |
| 2.758 | -2.358 |
| 2.759 | -2.356 |
| 2.76 | -2.355 |
| 2.761 | -2.353 |
| 2.762 | -2.352 |
| 2.763 | -2.35 |
| 2.764 | -2.349 |
| 2.765 | -2.347 |
| 2.766 | -2.346 |
| 2.767 | -2.344 |
| 2.768 | -2.343 |
| 2.769 | -2.341 |
| 2.77 | -2.34 |
| 2.771 | -2.338 |
| 2.772 | -2.337 |
| 2.773 | -2.335 |
| 2.774 | -2.334 |
| 2.775 | -2.332 |
| 2.776 | -2.33 |
| 2.777 | -2.329 |
| 2.778 | -2.327 |
| 2.779 | -2.326 |
| 2.78 | -2.324 |
| 2.781 | -2.323 |
| 2.782 | -2.321 |
| 2.783 | -2.32 |
| 2.784 | -2.318 |
| 2.785 | -2.317 |
| 2.786 | -2.315 |
| 2.787 | -2.314 |
| 2.788 | -2.312 |
| 2.789 | -2.311 |
| 2.79 | -2.309 |
| 2.791 | -2.308 |
| 2.792 | -2.306 |
| 2.793 | -2.304 |
| 2.794 | -2.303 |
| 2.795 | -2.301 |
| 2.796 | -2.3 |
| 2.797 | -2.298 |
| 2.798 | -2.297 |
| 2.799 | -2.295 |
| 2.8 | -2.294 |
| 2.801 | -2.292 |
| 2.802 | -2.291 |
| 2.803 | -2.289 |
| 2.804 | -2.288 |
| 2.805 | -2.286 |
| 2.806 | -2.284 |
| 2.807 | -2.283 |
| 2.808 | -2.281 |
| 2.809 | -2.28 |
| 2.81 | -2.278 |
| 2.811 | -2.277 |
| 2.812 | -2.275 |
| 2.813 | -2.274 |
| 2.814 | -2.272 |
| 2.815 | -2.271 |
| 2.816 | -2.269 |
| 2.817 | -2.267 |
| 2.818 | -2.266 |
| 2.819 | -2.264 |
| 2.82 | -2.263 |
| 2.821 | -2.261 |
| 2.822 | -2.26 |
| 2.823 | -2.258 |
| 2.824 | -2.257 |
| 2.825 | -2.255 |
| 2.826 | -2.253 |
| 2.827 | -2.252 |
| 2.828 | -2.25 |
| 2.829 | -2.249 |
| 2.83 | -2.247 |
| 2.831 | -2.246 |
| 2.832 | -2.244 |
| 2.833 | -2.243 |
| 2.834 | -2.241 |
| 2.835 | -2.239 |
| 2.836 | -2.238 |
| 2.837 | -2.236 |
| 2.838 | -2.235 |
| 2.839 | -2.233 |
| 2.84 | -2.232 |
| 2.841 | -2.23 |
| 2.842 | -2.229 |
| 2.843 | -2.227 |
| 2.844 | -2.225 |
| 2.845 | -2.224 |
| 2.846 | -2.222 |
| 2.847 | -2.221 |
| 2.848 | -2.219 |
| 2.849 | -2.218 |
| 2.85 | -2.216 |
| 2.851 | -2.214 |
| 2.852 | -2.213 |
| 2.853 | -2.211 |
| 2.854 | -2.21 |
| 2.855 | -2.208 |
| 2.856 | -2.207 |
| 2.857 | -2.205 |
| 2.858 | -2.203 |
| 2.859 | -2.202 |
| 2.86 | -2.2 |
| 2.861 | -2.199 |
| 2.862 | -2.197 |
| 2.863 | -2.196 |
| 2.864 | -2.194 |
| 2.865 | -2.192 |
| 2.866 | -2.191 |
| 2.867 | -2.189 |
| 2.868 | -2.188 |
| 2.869 | -2.186 |
| 2.87 | -2.185 |
| 2.871 | -2.183 |
| 2.872 | -2.181 |
| 2.873 | -2.18 |
| 2.874 | -2.178 |
| 2.875 | -2.177 |
| 2.876 | -2.175 |
| 2.877 | -2.173 |
| 2.878 | -2.172 |
| 2.879 | -2.17 |
| 2.88 | -2.169 |
| 2.881 | -2.167 |
| 2.882 | -2.166 |
| 2.883 | -2.164 |
| 2.884 | -2.162 |
| 2.885 | -2.161 |
| 2.886 | -2.159 |
| 2.887 | -2.158 |
| 2.888 | -2.156 |
| 2.889 | -2.154 |
| 2.89 | -2.153 |
| 2.891 | -2.151 |
| 2.892 | -2.15 |
| 2.893 | -2.148 |
| 2.894 | -2.146 |
| 2.895 | -2.145 |
| 2.896 | -2.143 |
| 2.897 | -2.142 |
| 2.898 | -2.14 |
| 2.899 | -2.139 |
| 2.9 | -2.137 |
| 2.901 | -2.135 |
| 2.902 | -2.134 |
| 2.903 | -2.132 |
| 2.904 | -2.131 |
| 2.905 | -2.129 |
| 2.906 | -2.127 |
| 2.907 | -2.126 |
| 2.908 | -2.124 |
| 2.909 | -2.123 |
| 2.91 | -2.121 |
| 2.911 | -2.119 |
| 2.912 | -2.118 |
| 2.913 | -2.116 |
| 2.914 | -2.115 |
| 2.915 | -2.113 |
| 2.916 | -2.111 |
| 2.917 | -2.11 |
| 2.918 | -2.108 |
| 2.919 | -2.106 |
| 2.92 | -2.105 |
| 2.921 | -2.103 |
| 2.922 | -2.102 |
| 2.923 | -2.1 |
| 2.924 | -2.098 |
| 2.925 | -2.097 |
| 2.926 | -2.095 |
| 2.927 | -2.094 |
| 2.928 | -2.092 |
| 2.929 | -2.09 |
| 2.93 | -2.089 |
| 2.931 | -2.087 |
| 2.932 | -2.086 |
| 2.933 | -2.084 |
| 2.934 | -2.082 |
| 2.935 | -2.081 |
| 2.936 | -2.079 |
| 2.937 | -2.077 |
| 2.938 | -2.076 |
| 2.939 | -2.074 |
| 2.94 | -2.073 |
| 2.941 | -2.071 |
| 2.942 | -2.069 |
| 2.943 | -2.068 |
| 2.944 | -2.066 |
| 2.945 | -2.065 |
| 2.946 | -2.063 |
| 2.947 | -2.061 |
| 2.948 | -2.06 |
| 2.949 | -2.058 |
| 2.95 | -2.056 |
| 2.951 | -2.055 |
| 2.952 | -2.053 |
| 2.953 | -2.052 |
| 2.954 | -2.05 |
| 2.955 | -2.048 |
| 2.956 | -2.047 |
| 2.957 | -2.045 |
| 2.958 | -2.043 |
| 2.959 | -2.042 |
| 2.96 | -2.04 |
| 2.961 | -2.039 |
| 2.962 | -2.037 |
| 2.963 | -2.035 |
| 2.964 | -2.034 |
| 2.965 | -2.032 |
| 2.966 | -2.03 |
| 2.967 | -2.029 |
| 2.968 | -2.027 |
| 2.969 | -2.025 |
| 2.97 | -2.024 |
| 2.971 | -2.022 |
| 2.972 | -2.021 |
| 2.973 | -2.019 |
| 2.974 | -2.017 |
| 2.975 | -2.016 |
| 2.976 | -2.014 |
| 2.977 | -2.012 |
| 2.978 | -2.011 |
| 2.979 | -2.009 |
| 2.98 | -2.007 |
| 2.981 | -2.006 |
| 2.982 | -2.004 |
| 2.983 | -2.002 |
| 2.984 | -2.001 |
| 2.985 | -1.999 |
| 2.986 | -1.998 |
| 2.987 | -1.996 |
| 2.988 | -1.994 |
| 2.989 | -1.993 |
| 2.99 | -1.991 |
| 2.991 | -1.989 |
| 2.992 | -1.988 |
| 2.993 | -1.986 |
| 2.994 | -1.984 |
| 2.995 | -1.983 |
| 2.996 | -1.981 |
| 2.997 | -1.979 |
| 2.998 | -1.978 |
| 2.999 | -1.976 |
| 3.0 | -1.974 |
| 3.001 | -1.973 |
| 3.002 | -1.971 |
| 3.003 | -1.97 |
| 3.004 | -1.968 |
| 3.005 | -1.966 |
| 3.006 | -1.965 |
| 3.007 | -1.963 |
| 3.008 | -1.961 |
| 3.009 | -1.96 |
| 3.01 | -1.958 |
| 3.011 | -1.956 |
| 3.012 | -1.955 |
| 3.013 | -1.953 |
| 3.014 | -1.951 |
| 3.015 | -1.95 |
| 3.016 | -1.948 |
| 3.017 | -1.946 |
| 3.018 | -1.945 |
| 3.019 | -1.943 |
| 3.02 | -1.941 |
| 3.021 | -1.94 |
| 3.022 | -1.938 |
| 3.023 | -1.936 |
| 3.024 | -1.935 |
| 3.025 | -1.933 |
| 3.026 | -1.931 |
| 3.027 | -1.93 |
| 3.028 | -1.928 |
| 3.029 | -1.926 |
| 3.03 | -1.925 |
| 3.031 | -1.923 |
| 3.032 | -1.921 |
| 3.033 | -1.92 |
| 3.034 | -1.918 |
| 3.035 | -1.916 |
| 3.036 | -1.915 |
| 3.037 | -1.913 |
| 3.038 | -1.911 |
| 3.039 | -1.91 |
| 3.04 | -1.908 |
| 3.041 | -1.906 |
| 3.042 | -1.905 |
| 3.043 | -1.903 |
| 3.044 | -1.901 |
| 3.045 | -1.899 |
| 3.046 | -1.898 |
| 3.047 | -1.896 |
| 3.048 | -1.894 |
| 3.049 | -1.893 |
| 3.05 | -1.891 |
| 3.051 | -1.889 |
| 3.052 | -1.888 |
| 3.053 | -1.886 |
| 3.054 | -1.884 |
| 3.055 | -1.883 |
| 3.056 | -1.881 |
| 3.057 | -1.879 |
| 3.058 | -1.878 |
| 3.059 | -1.876 |
| 3.06 | -1.874 |
| 3.061 | -1.873 |
| 3.062 | -1.871 |
| 3.063 | -1.869 |
| 3.064 | -1.867 |
| 3.065 | -1.866 |
| 3.066 | -1.864 |
| 3.067 | -1.862 |
| 3.068 | -1.861 |
| 3.069 | -1.859 |
| 3.07 | -1.857 |
| 3.071 | -1.856 |
| 3.072 | -1.854 |
| 3.073 | -1.852 |
| 3.074 | -1.851 |
| 3.075 | -1.849 |
| 3.076 | -1.847 |
| 3.077 | -1.845 |
| 3.078 | -1.844 |
| 3.079 | -1.842 |
| 3.08 | -1.84 |
| 3.081 | -1.839 |
| 3.082 | -1.837 |
| 3.083 | -1.835 |
| 3.084 | -1.834 |
| 3.085 | -1.832 |
| 3.086 | -1.83 |
| 3.087 | -1.828 |
| 3.088 | -1.827 |
| 3.089 | -1.825 |
| 3.09 | -1.823 |
| 3.091 | -1.822 |
| 3.092 | -1.82 |
| 3.093 | -1.818 |
| 3.094 | -1.816 |
| 3.095 | -1.815 |
| 3.096 | -1.813 |
| 3.097 | -1.811 |
| 3.098 | -1.81 |
| 3.099 | -1.808 |
| 3.1 | -1.806 |
| 3.101 | -1.805 |
| 3.102 | -1.803 |
| 3.103 | -1.801 |
| 3.104 | -1.799 |
| 3.105 | -1.798 |
| 3.106 | -1.796 |
| 3.107 | -1.794 |
| 3.108 | -1.793 |
| 3.109 | -1.791 |
| 3.11 | -1.789 |
| 3.111 | -1.787 |
| 3.112 | -1.786 |
| 3.113 | -1.784 |
| 3.114 | -1.782 |
| 3.115 | -1.78 |
| 3.116 | -1.779 |
| 3.117 | -1.777 |
| 3.118 | -1.775 |
| 3.119 | -1.774 |
| 3.12 | -1.772 |
| 3.121 | -1.77 |
| 3.122 | -1.768 |
| 3.123 | -1.767 |
| 3.124 | -1.765 |
| 3.125 | -1.763 |
| 3.126 | -1.762 |
| 3.127 | -1.76 |
| 3.128 | -1.758 |
| 3.129 | -1.756 |
| 3.13 | -1.755 |
| 3.131 | -1.753 |
| 3.132 | -1.751 |
| 3.133 | -1.749 |
| 3.134 | -1.748 |
| 3.135 | -1.746 |
| 3.136 | -1.744 |
| 3.137 | -1.742 |
| 3.138 | -1.741 |
| 3.139 | -1.739 |
| 3.14 | -1.737 |
| 3.141 | -1.736 |
| 3.142 | -1.734 |
| 3.143 | -1.732 |
| 3.144 | -1.73 |
| 3.145 | -1.729 |
| 3.146 | -1.727 |
| 3.147 | -1.725 |
| 3.148 | -1.723 |
| 3.149 | -1.722 |
| 3.15 | -1.72 |
| 3.151 | -1.718 |
| 3.152 | -1.716 |
| 3.153 | -1.715 |
| 3.154 | -1.713 |
| 3.155 | -1.711 |
| 3.156 | -1.709 |
| 3.157 | -1.708 |
| 3.158 | -1.706 |
| 3.159 | -1.704 |
| 3.16 | -1.702 |
| 3.161 | -1.701 |
| 3.162 | -1.699 |
| 3.163 | -1.697 |
| 3.164 | -1.695 |
| 3.165 | -1.694 |
| 3.166 | -1.692 |
| 3.167 | -1.69 |
| 3.168 | -1.688 |
| 3.169 | -1.687 |
| 3.17 | -1.685 |
| 3.171 | -1.683 |
| 3.172 | -1.681 |
| 3.173 | -1.68 |
| 3.174 | -1.678 |
| 3.175 | -1.676 |
| 3.176 | -1.674 |
| 3.177 | -1.673 |
| 3.178 | -1.671 |
| 3.179 | -1.669 |
| 3.18 | -1.667 |
| 3.181 | -1.666 |
| 3.182 | -1.664 |
| 3.183 | -1.662 |
| 3.184 | -1.66 |
| 3.185 | -1.659 |
| 3.186 | -1.657 |
| 3.187 | -1.655 |
| 3.188 | -1.653 |
| 3.189 | -1.651 |
| 3.19 | -1.65 |
| 3.191 | -1.648 |
| 3.192 | -1.646 |
| 3.193 | -1.644 |
| 3.194 | -1.643 |
| 3.195 | -1.641 |
| 3.196 | -1.639 |
| 3.197 | -1.637 |
| 3.198 | -1.636 |
| 3.199 | -1.634 |
| 3.2 | -1.632 |
| 3.201 | -1.63 |
| 3.202 | -1.628 |
| 3.203 | -1.627 |
| 3.204 | -1.625 |
| 3.205 | -1.623 |
| 3.206 | -1.621 |
| 3.207 | -1.62 |
| 3.208 | -1.618 |
| 3.209 | -1.616 |
| 3.21 | -1.614 |
| 3.211 | -1.613 |
| 3.212 | -1.611 |
| 3.213 | -1.609 |
| 3.214 | -1.607 |
| 3.215 | -1.605 |
| 3.216 | -1.604 |
| 3.217 | -1.602 |
| 3.218 | -1.6 |
| 3.219 | -1.598 |
| 3.22 | -1.596 |
| 3.221 | -1.595 |
| 3.222 | -1.593 |
| 3.223 | -1.591 |
| 3.224 | -1.589 |
| 3.225 | -1.588 |
| 3.226 | -1.586 |
| 3.227 | -1.584 |
| 3.228 | -1.582 |
| 3.229 | -1.58 |
| 3.23 | -1.579 |
| 3.231 | -1.577 |
| 3.232 | -1.575 |
| 3.233 | -1.573 |
| 3.234 | -1.571 |
| 3.235 | -1.57 |
| 3.236 | -1.568 |
| 3.237 | -1.566 |
| 3.238 | -1.564 |
| 3.239 | -1.562 |
| 3.24 | -1.561 |
| 3.241 | -1.559 |
| 3.242 | -1.557 |
| 3.243 | -1.555 |
| 3.244 | -1.553 |
| 3.245 | -1.552 |
| 3.246 | -1.55 |
| 3.247 | -1.548 |
| 3.248 | -1.546 |
| 3.249 | -1.544 |
| 3.25 | -1.543 |
| 3.251 | -1.541 |
| 3.252 | -1.539 |
| 3.253 | -1.537 |
| 3.254 | -1.535 |
| 3.255 | -1.534 |
| 3.256 | -1.532 |
| 3.257 | -1.53 |
| 3.258 | -1.528 |
| 3.259 | -1.526 |
| 3.26 | -1.525 |
| 3.261 | -1.523 |
| 3.262 | -1.521 |
| 3.263 | -1.519 |
| 3.264 | -1.517 |
| 3.265 | -1.516 |
| 3.266 | -1.514 |
| 3.267 | -1.512 |
| 3.268 | -1.51 |
| 3.269 | -1.508 |
| 3.27 | -1.507 |
| 3.271 | -1.505 |
| 3.272 | -1.503 |
| 3.273 | -1.501 |
| 3.274 | -1.499 |
| 3.275 | -1.497 |
| 3.276 | -1.496 |
| 3.277 | -1.494 |
| 3.278 | -1.492 |
| 3.279 | -1.49 |
| 3.28 | -1.488 |
| 3.281 | -1.487 |
| 3.282 | -1.485 |
| 3.283 | -1.483 |
| 3.284 | -1.481 |
| 3.285 | -1.479 |
| 3.286 | -1.477 |
| 3.287 | -1.476 |
| 3.288 | -1.474 |
| 3.289 | -1.472 |
| 3.29 | -1.47 |
| 3.291 | -1.468 |
| 3.292 | -1.466 |
| 3.293 | -1.465 |
| 3.294 | -1.463 |
| 3.295 | -1.461 |
| 3.296 | -1.459 |
| 3.297 | -1.457 |
| 3.298 | -1.455 |
| 3.299 | -1.454 |
| 3.3 | -1.452 |
| 3.301 | -1.45 |
| 3.302 | -1.448 |
| 3.303 | -1.446 |
| 3.304 | -1.444 |
| 3.305 | -1.443 |
| 3.306 | -1.441 |
| 3.307 | -1.439 |
| 3.308 | -1.437 |
| 3.309 | -1.435 |
| 3.31 | -1.433 |
| 3.311 | -1.432 |
| 3.312 | -1.43 |
| 3.313 | -1.428 |
| 3.314 | -1.426 |
| 3.315 | -1.424 |
| 3.316 | -1.422 |
| 3.317 | -1.421 |
| 3.318 | -1.419 |
| 3.319 | -1.417 |
| 3.32 | -1.415 |
| 3.321 | -1.413 |
| 3.322 | -1.411 |
| 3.323 | -1.409 |
| 3.324 | -1.408 |
| 3.325 | -1.406 |
| 3.326 | -1.404 |
| 3.327 | -1.402 |
| 3.328 | -1.4 |
| 3.329 | -1.398 |
| 3.33 | -1.397 |
| 3.331 | -1.395 |
| 3.332 | -1.393 |
| 3.333 | -1.391 |
| 3.334 | -1.389 |
| 3.335 | -1.387 |
| 3.336 | -1.385 |
| 3.337 | -1.384 |
| 3.338 | -1.382 |
| 3.339 | -1.38 |
| 3.34 | -1.378 |
| 3.341 | -1.376 |
| 3.342 | -1.374 |
| 3.343 | -1.372 |
| 3.344 | -1.371 |
| 3.345 | -1.369 |
| 3.346 | -1.367 |
| 3.347 | -1.365 |
| 3.348 | -1.363 |
| 3.349 | -1.361 |
| 3.35 | -1.359 |
| 3.351 | -1.357 |
| 3.352 | -1.356 |
| 3.353 | -1.354 |
| 3.354 | -1.352 |
| 3.355 | -1.35 |
| 3.356 | -1.348 |
| 3.357 | -1.346 |
| 3.358 | -1.344 |
| 3.359 | -1.343 |
| 3.36 | -1.341 |
| 3.361 | -1.339 |
| 3.362 | -1.337 |
| 3.363 | -1.335 |
| 3.364 | -1.333 |
| 3.365 | -1.331 |
| 3.366 | -1.329 |
| 3.367 | -1.328 |
| 3.368 | -1.326 |
| 3.369 | -1.324 |
| 3.37 | -1.322 |
| 3.371 | -1.32 |
| 3.372 | -1.318 |
| 3.373 | -1.316 |
| 3.374 | -1.314 |
| 3.375 | -1.313 |
| 3.376 | -1.311 |
| 3.377 | -1.309 |
| 3.378 | -1.307 |
| 3.379 | -1.305 |
| 3.38 | -1.303 |
| 3.381 | -1.301 |
| 3.382 | -1.299 |
| 3.383 | -1.297 |
| 3.384 | -1.296 |
| 3.385 | -1.294 |
| 3.386 | -1.292 |
| 3.387 | -1.29 |
| 3.388 | -1.288 |
| 3.389 | -1.286 |
| 3.39 | -1.284 |
| 3.391 | -1.282 |
| 3.392 | -1.28 |
| 3.393 | -1.279 |
| 3.394 | -1.277 |
| 3.395 | -1.275 |
| 3.396 | -1.273 |
| 3.397 | -1.271 |
| 3.398 | -1.269 |
| 3.399 | -1.267 |
| 3.4 | -1.265 |
| 3.401 | -1.263 |
| 3.402 | -1.262 |
| 3.403 | -1.26 |
| 3.404 | -1.258 |
| 3.405 | -1.256 |
| 3.406 | -1.254 |
| 3.407 | -1.252 |
| 3.408 | -1.25 |
| 3.409 | -1.248 |
| 3.41 | -1.246 |
| 3.411 | -1.244 |
| 3.412 | -1.243 |
| 3.413 | -1.241 |
| 3.414 | -1.239 |
| 3.415 | -1.237 |
| 3.416 | -1.235 |
| 3.417 | -1.233 |
| 3.418 | -1.231 |
| 3.419 | -1.229 |
| 3.42 | -1.227 |
| 3.421 | -1.225 |
| 3.422 | -1.224 |
| 3.423 | -1.222 |
| 3.424 | -1.22 |
| 3.425 | -1.218 |
| 3.426 | -1.216 |
| 3.427 | -1.214 |
| 3.428 | -1.212 |
| 3.429 | -1.21 |
| 3.43 | -1.208 |
| 3.431 | -1.206 |
| 3.432 | -1.204 |
| 3.433 | -1.202 |
| 3.434 | -1.201 |
| 3.435 | -1.199 |
| 3.436 | -1.197 |
| 3.437 | -1.195 |
| 3.438 | -1.193 |
| 3.439 | -1.191 |
| 3.44 | -1.189 |
| 3.441 | -1.187 |
| 3.442 | -1.185 |
| 3.443 | -1.183 |
| 3.444 | -1.181 |
| 3.445 | -1.179 |
| 3.446 | -1.177 |
| 3.447 | -1.176 |
| 3.448 | -1.174 |
| 3.449 | -1.172 |
| 3.45 | -1.17 |
| 3.451 | -1.168 |
| 3.452 | -1.166 |
| 3.453 | -1.164 |
| 3.454 | -1.162 |
| 3.455 | -1.16 |
| 3.456 | -1.158 |
| 3.457 | -1.156 |
| 3.458 | -1.154 |
| 3.459 | -1.152 |
| 3.46 | -1.15 |
| 3.461 | -1.149 |
| 3.462 | -1.147 |
| 3.463 | -1.145 |
| 3.464 | -1.143 |
| 3.465 | -1.141 |
| 3.466 | -1.139 |
| 3.467 | -1.137 |
| 3.468 | -1.135 |
| 3.469 | -1.133 |
| 3.47 | -1.131 |
| 3.471 | -1.129 |
| 3.472 | -1.127 |
| 3.473 | -1.125 |
| 3.474 | -1.123 |
| 3.475 | -1.121 |
| 3.476 | -1.119 |
| 3.477 | -1.118 |
| 3.478 | -1.116 |
| 3.479 | -1.114 |
| 3.48 | -1.112 |
| 3.481 | -1.11 |
| 3.482 | -1.108 |
| 3.483 | -1.106 |
| 3.484 | -1.104 |
| 3.485 | -1.102 |
| 3.486 | -1.1 |
| 3.487 | -1.098 |
| 3.488 | -1.096 |
| 3.489 | -1.094 |
| 3.49 | -1.092 |
| 3.491 | -1.09 |
| 3.492 | -1.088 |
| 3.493 | -1.086 |
| 3.494 | -1.084 |
| 3.495 | -1.082 |
| 3.496 | -1.08 |
| 3.497 | -1.078 |
| 3.498 | -1.077 |
| 3.499 | -1.075 |
| 3.5 | -1.073 |
| 3.501 | -1.071 |
| 3.502 | -1.069 |
| 3.503 | -1.067 |
| 3.504 | -1.065 |
| 3.505 | -1.063 |
| 3.506 | -1.061 |
| 3.507 | -1.059 |
| 3.508 | -1.057 |
| 3.509 | -1.055 |
| 3.51 | -1.053 |
| 3.511 | -1.051 |
| 3.512 | -1.049 |
| 3.513 | -1.047 |
| 3.514 | -1.045 |
| 3.515 | -1.043 |
| 3.516 | -1.041 |
| 3.517 | -1.039 |
| 3.518 | -1.037 |
| 3.519 | -1.035 |
| 3.52 | -1.033 |
| 3.521 | -1.031 |
| 3.522 | -1.029 |
| 3.523 | -1.027 |
| 3.524 | -1.025 |
| 3.525 | -1.023 |
| 3.526 | -1.021 |
| 3.527 | -1.019 |
| 3.528 | -1.017 |
| 3.529 | -1.016 |
| 3.53 | -1.014 |
| 3.531 | -1.012 |
| 3.532 | -1.01 |
| 3.533 | -1.008 |
| 3.534 | -1.006 |
| 3.535 | -1.004 |
| 3.536 | -1.002 |
| 3.537 | -1 |
| 3.538 | -0.998 |
| 3.539 | -0.996 |
| 3.54 | -0.994 |
| 3.541 | -0.992 |
| 3.542 | -0.99 |
| 3.543 | -0.988 |
| 3.544 | -0.986 |
| 3.545 | -0.984 |
| 3.546 | -0.982 |
| 3.547 | -0.98 |
| 3.548 | -0.978 |
| 3.549 | -0.976 |
| 3.55 | -0.974 |
| 3.551 | -0.972 |
| 3.552 | -0.97 |
| 3.553 | -0.968 |
| 3.554 | -0.966 |
| 3.555 | -0.964 |
| 3.556 | -0.962 |
| 3.557 | -0.96 |
| 3.558 | -0.958 |
| 3.559 | -0.956 |
| 3.56 | -0.954 |
| 3.561 | -0.952 |
| 3.562 | -0.95 |
| 3.563 | -0.948 |
| 3.564 | -0.946 |
| 3.565 | -0.944 |
| 3.566 | -0.942 |
| 3.567 | -0.94 |
| 3.568 | -0.938 |
| 3.569 | -0.936 |
| 3.57 | -0.934 |
| 3.571 | -0.932 |
| 3.572 | -0.93 |
| 3.573 | -0.928 |
| 3.574 | -0.926 |
| 3.575 | -0.924 |
| 3.576 | -0.922 |
| 3.577 | -0.92 |
| 3.578 | -0.918 |
| 3.579 | -0.916 |
| 3.58 | -0.914 |
| 3.581 | -0.912 |
| 3.582 | -0.91 |
| 3.583 | -0.908 |
| 3.584 | -0.906 |
| 3.585 | -0.904 |
| 3.586 | -0.902 |
| 3.587 | -0.9 |
| 3.588 | -0.898 |
| 3.589 | -0.896 |
| 3.59 | -0.894 |
| 3.591 | -0.892 |
| 3.592 | -0.89 |
| 3.593 | -0.888 |
| 3.594 | -0.886 |
| 3.595 | -0.884 |
| 3.596 | -0.882 |
| 3.597 | -0.88 |
| 3.598 | -0.877 |
| 3.599 | -0.875 |
| 3.6 | -0.873 |
| 3.601 | -0.871 |
| 3.602 | -0.869 |
| 3.603 | -0.867 |
| 3.604 | -0.865 |
| 3.605 | -0.863 |
| 3.606 | -0.861 |
| 3.607 | -0.859 |
| 3.608 | -0.857 |
| 3.609 | -0.855 |
| 3.61 | -0.853 |
| 3.611 | -0.851 |
| 3.612 | -0.849 |
| 3.613 | -0.847 |
| 3.614 | -0.845 |
| 3.615 | -0.843 |
| 3.616 | -0.841 |
| 3.617 | -0.839 |
| 3.618 | -0.837 |
| 3.619 | -0.835 |
| 3.62 | -0.833 |
| 3.621 | -0.831 |
| 3.622 | -0.829 |
| 3.623 | -0.827 |
| 3.624 | -0.825 |
| 3.625 | -0.823 |
| 3.626 | -0.821 |
| 3.627 | -0.819 |
| 3.628 | -0.816 |
| 3.629 | -0.814 |
| 3.63 | -0.812 |
| 3.631 | -0.81 |
| 3.632 | -0.808 |
| 3.633 | -0.806 |
| 3.634 | -0.804 |
| 3.635 | -0.802 |
| 3.636 | -0.8 |
| 3.637 | -0.798 |
| 3.638 | -0.796 |
| 3.639 | -0.794 |
| 3.64 | -0.792 |
| 3.641 | -0.79 |
| 3.642 | -0.788 |
| 3.643 | -0.786 |
| 3.644 | -0.784 |
| 3.645 | -0.782 |
| 3.646 | -0.78 |
| 3.647 | -0.778 |
| 3.648 | -0.775 |
| 3.649 | -0.773 |
| 3.65 | -0.771 |
| 3.651 | -0.769 |
| 3.652 | -0.767 |
| 3.653 | -0.765 |
| 3.654 | -0.763 |
| 3.655 | -0.761 |
| 3.656 | -0.759 |
| 3.657 | -0.757 |
| 3.658 | -0.755 |
| 3.659 | -0.753 |
| 3.66 | -0.751 |
| 3.661 | -0.749 |
| 3.662 | -0.747 |
| 3.663 | -0.745 |
| 3.664 | -0.743 |
| 3.665 | -0.74 |
| 3.666 | -0.738 |
| 3.667 | -0.736 |
| 3.668 | -0.734 |
| 3.669 | -0.732 |
| 3.67 | -0.73 |
| 3.671 | -0.728 |
| 3.672 | -0.726 |
| 3.673 | -0.724 |
| 3.674 | -0.722 |
| 3.675 | -0.72 |
| 3.676 | -0.718 |
| 3.677 | -0.716 |
| 3.678 | -0.714 |
| 3.679 | -0.711 |
| 3.68 | -0.709 |
| 3.681 | -0.707 |
| 3.682 | -0.705 |
| 3.683 | -0.703 |
| 3.684 | -0.701 |
| 3.685 | -0.699 |
| 3.686 | -0.697 |
| 3.687 | -0.695 |
| 3.688 | -0.693 |
| 3.689 | -0.691 |
| 3.69 | -0.689 |
| 3.691 | -0.686 |
| 3.692 | -0.684 |
| 3.693 | -0.682 |
| 3.694 | -0.68 |
| 3.695 | -0.678 |
| 3.696 | -0.676 |
| 3.697 | -0.674 |
| 3.698 | -0.672 |
| 3.699 | -0.67 |
| 3.7 | -0.668 |
| 3.701 | -0.666 |
| 3.702 | -0.663 |
| 3.703 | -0.661 |
| 3.704 | -0.659 |
| 3.705 | -0.657 |
| 3.706 | -0.655 |
| 3.707 | -0.653 |
| 3.708 | -0.651 |
| 3.709 | -0.649 |
| 3.71 | -0.647 |
| 3.711 | -0.645 |
| 3.712 | -0.643 |
| 3.713 | -0.64 |
| 3.714 | -0.638 |
| 3.715 | -0.636 |
| 3.716 | -0.634 |
| 3.717 | -0.632 |
| 3.718 | -0.63 |
| 3.719 | -0.628 |
| 3.72 | -0.626 |
| 3.721 | -0.624 |
| 3.722 | -0.622 |
| 3.723 | -0.619 |
| 3.724 | -0.617 |
| 3.725 | -0.615 |
| 3.726 | -0.613 |
| 3.727 | -0.611 |
| 3.728 | -0.609 |
| 3.729 | -0.607 |
| 3.73 | -0.605 |
| 3.731 | -0.603 |
| 3.732 | -0.6 |
| 3.733 | -0.598 |
| 3.734 | -0.596 |
| 3.735 | -0.594 |
| 3.736 | -0.592 |
| 3.737 | -0.59 |
| 3.738 | -0.588 |
| 3.739 | -0.586 |
| 3.74 | -0.584 |
| 3.741 | -0.581 |
| 3.742 | -0.579 |
| 3.743 | -0.577 |
| 3.744 | -0.575 |
| 3.745 | -0.573 |
| 3.746 | -0.571 |
| 3.747 | -0.569 |
| 3.748 | -0.567 |
| 3.749 | -0.564 |
| 3.75 | -0.562 |
| 3.751 | -0.56 |
| 3.752 | -0.558 |
| 3.753 | -0.556 |
| 3.754 | -0.554 |
| 3.755 | -0.552 |
| 3.756 | -0.55 |
| 3.757 | -0.547 |
| 3.758 | -0.545 |
| 3.759 | -0.543 |
| 3.76 | -0.541 |
| 3.761 | -0.539 |
| 3.762 | -0.537 |
| 3.763 | -0.535 |
| 3.764 | -0.532 |
| 3.765 | -0.53 |
| 3.766 | -0.528 |
| 3.767 | -0.526 |
| 3.768 | -0.524 |
| 3.769 | -0.522 |
| 3.77 | -0.52 |
| 3.771 | -0.518 |
| 3.772 | -0.515 |
| 3.773 | -0.513 |
| 3.774 | -0.511 |
| 3.775 | -0.509 |
| 3.776 | -0.507 |
| 3.777 | -0.505 |
| 3.778 | -0.503 |
| 3.779 | -0.5 |
| 3.78 | -0.498 |
| 3.781 | -0.496 |
| 3.782 | -0.494 |
| 3.783 | -0.492 |
| 3.784 | -0.49 |
| 3.785 | -0.488 |
| 3.786 | -0.485 |
| 3.787 | -0.483 |
| 3.788 | -0.481 |
| 3.789 | -0.479 |
| 3.79 | -0.477 |
| 3.791 | -0.475 |
| 3.792 | -0.472 |
| 3.793 | -0.47 |
| 3.794 | -0.468 |
| 3.795 | -0.466 |
| 3.796 | -0.464 |
| 3.797 | -0.462 |
| 3.798 | -0.46 |
| 3.799 | -0.457 |
| 3.8 | -0.455 |
| 3.801 | -0.453 |
| 3.802 | -0.451 |
| 3.803 | -0.449 |
| 3.804 | -0.447 |
| 3.805 | -0.444 |
| 3.806 | -0.442 |
| 3.807 | -0.44 |
| 3.808 | -0.438 |
| 3.809 | -0.436 |
| 3.81 | -0.434 |
| 3.811 | -0.431 |
| 3.812 | -0.429 |
| 3.813 | -0.427 |
| 3.814 | -0.425 |
| 3.815 | -0.423 |
| 3.816 | -0.421 |
| 3.817 | -0.418 |
| 3.818 | -0.416 |
| 3.819 | -0.414 |
| 3.82 | -0.412 |
| 3.821 | -0.41 |
| 3.822 | -0.408 |
| 3.823 | -0.405 |
| 3.824 | -0.403 |
| 3.825 | -0.401 |
| 3.826 | -0.399 |
| 3.827 | -0.397 |
| 3.828 | -0.395 |
| 3.829 | -0.392 |
| 3.83 | -0.39 |
| 3.831 | -0.388 |
| 3.832 | -0.386 |
| 3.833 | -0.384 |
| 3.834 | -0.381 |
| 3.835 | -0.379 |
| 3.836 | -0.377 |
| 3.837 | -0.375 |
| 3.838 | -0.373 |
| 3.839 | -0.371 |
| 3.84 | -0.368 |
| 3.841 | -0.366 |
| 3.842 | -0.364 |
| 3.843 | -0.362 |
| 3.844 | -0.36 |
| 3.845 | -0.357 |
| 3.846 | -0.355 |
| 3.847 | -0.353 |
| 3.848 | -0.351 |
| 3.849 | -0.349 |
| 3.85 | -0.346 |
| 3.851 | -0.344 |
| 3.852 | -0.342 |
| 3.853 | -0.34 |
| 3.854 | -0.338 |
| 3.855 | -0.335 |
| 3.856 | -0.333 |
| 3.857 | -0.331 |
| 3.858 | -0.329 |
| 3.859 | -0.327 |
| 3.86 | -0.325 |
| 3.861 | -0.322 |
| 3.862 | -0.32 |
| 3.863 | -0.318 |
| 3.864 | -0.316 |
| 3.865 | -0.314 |
| 3.866 | -0.311 |
| 3.867 | -0.309 |
| 3.868 | -0.307 |
| 3.869 | -0.305 |
| 3.87 | -0.302 |
| 3.871 | -0.3 |
| 3.872 | -0.298 |
| 3.873 | -0.296 |
| 3.874 | -0.294 |
| 3.875 | -0.291 |
| 3.876 | -0.289 |
| 3.877 | -0.287 |
| 3.878 | -0.285 |
| 3.879 | -0.283 |
| 3.88 | -0.28 |
| 3.881 | -0.278 |
| 3.882 | -0.276 |
| 3.883 | -0.274 |
| 3.884 | -0.272 |
| 3.885 | -0.269 |
| 3.886 | -0.267 |
| 3.887 | -0.265 |
| 3.888 | -0.263 |
| 3.889 | -0.26 |
| 3.89 | -0.258 |
| 3.891 | -0.256 |
| 3.892 | -0.254 |
| 3.893 | -0.252 |
| 3.894 | -0.249 |
| 3.895 | -0.247 |
| 3.896 | -0.245 |
| 3.897 | -0.243 |
| 3.898 | -0.24 |
| 3.899 | -0.238 |
| 3.9 | -0.236 |
| 3.901 | -0.234 |
| 3.902 | -0.232 |
| 3.903 | -0.229 |
| 3.904 | -0.227 |
| 3.905 | -0.225 |
| 3.906 | -0.223 |
| 3.907 | -0.22 |
| 3.908 | -0.218 |
| 3.909 | -0.216 |
| 3.91 | -0.214 |
| 3.911 | -0.211 |
| 3.912 | -0.209 |
| 3.913 | -0.207 |
| 3.914 | -0.205 |
| 3.915 | -0.202 |
| 3.916 | -0.2 |
| 3.917 | -0.198 |
| 3.918 | -0.196 |
| 3.919 | -0.194 |
| 3.92 | -0.191 |
| 3.921 | -0.189 |
| 3.922 | -0.187 |
| 3.923 | -0.185 |
| 3.924 | -0.182 |
| 3.925 | -0.18 |
| 3.926 | -0.178 |
| 3.927 | -0.176 |
| 3.928 | -0.173 |
| 3.929 | -0.171 |
| 3.93 | -0.169 |
| 3.931 | -0.167 |
| 3.932 | -0.164 |
| 3.933 | -0.162 |
| 3.934 | -0.16 |
| 3.935 | -0.158 |
| 3.936 | -0.155 |
| 3.937 | -0.153 |
| 3.938 | -0.151 |
| 3.939 | -0.149 |
| 3.94 | -0.146 |
| 3.941 | -0.144 |
| 3.942 | -0.142 |
| 3.943 | -0.14 |
| 3.944 | -0.137 |
| 3.945 | -0.135 |
| 3.946 | -0.133 |
| 3.947 | -0.131 |
| 3.948 | -0.128 |
| 3.949 | -0.126 |
| 3.95 | -0.124 |
| 3.951 | -0.121 |
| 3.952 | -0.119 |
| 3.953 | -0.117 |
| 3.954 | -0.115 |
| 3.955 | -0.112 |
| 3.956 | -0.11 |
| 3.957 | -0.108 |
| 3.958 | -0.106 |
| 3.959 | -0.103 |
| 3.96 | -0.101 |
| 3.961 | -0.099 |
| 3.962 | -0.097 |
| 3.963 | -0.094 |
| 3.964 | -0.092 |
| 3.965 | -0.09 |
| 3.966 | -0.087 |
| 3.967 | -0.085 |
| 3.968 | -0.083 |
| 3.969 | -0.081 |
| 3.97 | -0.078 |
| 3.971 | -0.076 |
| 3.972 | -0.074 |
| 3.973 | -0.072 |
| 3.974 | -0.069 |
| 3.975 | -0.067 |
| 3.976 | -0.065 |
| 3.977 | -0.062 |
| 3.978 | -0.06 |
| 3.979 | -0.058 |
| 3.98 | -0.056 |
| 3.981 | -0.053 |
| 3.982 | -0.051 |
| 3.983 | -0.049 |
| 3.984 | -0.046 |
| 3.985 | -0.044 |
| 3.986 | -0.042 |
| 3.987 | -0.04 |
| 3.988 | -0.037 |
| 3.989 | -0.035 |
| 3.99 | -0.033 |
| 3.991 | -0.03 |
| 3.992 | -0.028 |
| 3.993 | -0.026 |
| 3.994 | -0.024 |
| 3.995 | -0.021 |
| 3.996 | -0.019 |
| 3.997 | -0.017 |
| 3.998 | -0.014 |
| 3.999 | -0.012 |
| 4.0 | -0.01 |
| 4.001 | -0.007 |
| 4.002 | -0.005 |
| 4.003 | -0.003 |
| 4.004 | -0.001 |
| 4.005 | 0.002 |
| 4.006 | 0.004 |
| 4.007 | 0.006 |
| 4.008 | 0.009 |
| 4.009 | 0.011 |
| 4.01 | 0.013 |
| 4.011 | 0.016 |
| 4.012 | 0.018 |
| 4.013 | 0.02 |
| 4.014 | 0.022 |
| 4.015 | 0.025 |
| 4.016 | 0.027 |
| 4.017 | 0.029 |
| 4.018 | 0.032 |
| 4.019 | 0.034 |
| 4.02 | 0.036 |
| 4.021 | 0.039 |
| 4.022 | 0.041 |
| 4.023 | 0.043 |
| 4.024 | 0.046 |
| 4.025 | 0.048 |
| 4.026 | 0.05 |
| 4.027 | 0.052 |
| 4.028 | 0.055 |
| 4.029 | 0.057 |
| 4.03 | 0.06 |
| 4.031 | 0.062 |
| 4.032 | 0.064 |
| 4.033 | 0.066 |
| 4.034 | 0.069 |
| 4.035 | 0.071 |
| 4.036 | 0.073 |
| 4.037 | 0.076 |
| 4.038 | 0.078 |
| 4.039 | 0.08 |
| 4.04 | 0.083 |
| 4.041 | 0.085 |
| 4.042 | 0.087 |
| 4.043 | 0.09 |
| 4.044 | 0.092 |
| 4.045 | 0.094 |
| 4.046 | 0.097 |
| 4.047 | 0.099 |
| 4.048 | 0.101 |
| 4.049 | 0.104 |
| 4.05 | 0.106 |
| 4.051 | 0.108 |
| 4.052 | 0.111 |
| 4.053 | 0.113 |
| 4.054 | 0.115 |
| 4.055 | 0.118 |
| 4.056 | 0.12 |
| 4.057 | 0.122 |
| 4.058 | 0.125 |
| 4.059 | 0.127 |
| 4.06 | 0.129 |
| 4.061 | 0.132 |
| 4.062 | 0.134 |
| 4.063 | 0.136 |
| 4.064 | 0.139 |
| 4.065 | 0.141 |
| 4.066 | 0.143 |
| 4.067 | 0.146 |
| 4.068 | 0.148 |
| 4.069 | 0.15 |
| 4.07 | 0.153 |
| 4.071 | 0.155 |
| 4.072 | 0.158 |
| 4.073 | 0.16 |
| 4.074 | 0.162 |
| 4.075 | 0.165 |
| 4.076 | 0.167 |
| 4.077 | 0.169 |
| 4.078 | 0.172 |
| 4.079 | 0.174 |
| 4.08 | 0.176 |
| 4.081 | 0.179 |
| 4.082 | 0.181 |
| 4.083 | 0.183 |
| 4.084 | 0.186 |
| 4.085 | 0.188 |
| 4.086 | 0.19 |
| 4.087 | 0.193 |
| 4.088 | 0.195 |
| 4.089 | 0.198 |
| 4.09 | 0.2 |
| 4.091 | 0.202 |
| 4.092 | 0.205 |
| 4.093 | 0.207 |
| 4.094 | 0.209 |
| 4.095 | 0.212 |
| 4.096 | 0.214 |
| 4.097 | 0.216 |
| 4.098 | 0.219 |
| 4.099 | 0.221 |
| 4.1 | 0.224 |
| 4.101 | 0.226 |
| 4.102 | 0.228 |
| 4.103 | 0.231 |
| 4.104 | 0.233 |
| 4.105 | 0.235 |
| 4.106 | 0.238 |
| 4.107 | 0.24 |
| 4.108 | 0.242 |
| 4.109 | 0.245 |
| 4.11 | 0.247 |
| 4.111 | 0.25 |
| 4.112 | 0.252 |
| 4.113 | 0.254 |
| 4.114 | 0.257 |
| 4.115 | 0.259 |
| 4.116 | 0.262 |
| 4.117 | 0.264 |
| 4.118 | 0.266 |
| 4.119 | 0.269 |
| 4.12 | 0.271 |
| 4.121 | 0.274 |
| 4.122 | 0.276 |
| 4.123 | 0.278 |
| 4.124 | 0.281 |
| 4.125 | 0.283 |
| 4.126 | 0.285 |
| 4.127 | 0.288 |
| 4.128 | 0.29 |
| 4.129 | 0.293 |
| 4.13 | 0.295 |
| 4.131 | 0.297 |
| 4.132 | 0.3 |
| 4.133 | 0.302 |
| 4.134 | 0.304 |
| 4.135 | 0.307 |
| 4.136 | 0.309 |
| 4.137 | 0.312 |
| 4.138 | 0.314 |
| 4.139 | 0.316 |
| 4.14 | 0.319 |
| 4.141 | 0.321 |
| 4.142 | 0.324 |
| 4.143 | 0.326 |
| 4.144 | 0.328 |
| 4.145 | 0.331 |
| 4.146 | 0.333 |
| 4.147 | 0.336 |
| 4.148 | 0.338 |
| 4.149 | 0.34 |
| 4.15 | 0.343 |
| 4.151 | 0.345 |
| 4.152 | 0.348 |
| 4.153 | 0.35 |
| 4.154 | 0.352 |
| 4.155 | 0.355 |
| 4.156 | 0.357 |
| 4.157 | 0.36 |
| 4.158 | 0.362 |
| 4.159 | 0.365 |
| 4.16 | 0.367 |
| 4.161 | 0.369 |
| 4.162 | 0.372 |
| 4.163 | 0.374 |
| 4.164 | 0.377 |
| 4.165 | 0.379 |
| 4.166 | 0.382 |
| 4.167 | 0.384 |
| 4.168 | 0.386 |
| 4.169 | 0.389 |
| 4.17 | 0.391 |
| 4.171 | 0.394 |
| 4.172 | 0.396 |
| 4.173 | 0.398 |
| 4.174 | 0.401 |
| 4.175 | 0.403 |
| 4.176 | 0.406 |
| 4.177 | 0.408 |
| 4.178 | 0.411 |
| 4.179 | 0.413 |
| 4.18 | 0.415 |
| 4.181 | 0.418 |
| 4.182 | 0.42 |
| 4.183 | 0.423 |
| 4.184 | 0.425 |
| 4.185 | 0.428 |
| 4.186 | 0.43 |
| 4.187 | 0.432 |
| 4.188 | 0.435 |
| 4.189 | 0.437 |
| 4.19 | 0.44 |
| 4.191 | 0.442 |
| 4.192 | 0.445 |
| 4.193 | 0.447 |
| 4.194 | 0.45 |
| 4.195 | 0.452 |
| 4.196 | 0.454 |
| 4.197 | 0.457 |
| 4.198 | 0.459 |
| 4.199 | 0.462 |
| 4.2 | 0.464 |
| 4.201 | 0.467 |
| 4.202 | 0.469 |
| 4.203 | 0.471 |
| 4.204 | 0.474 |
| 4.205 | 0.476 |
| 4.206 | 0.479 |
| 4.207 | 0.481 |
| 4.208 | 0.484 |
| 4.209 | 0.486 |
| 4.21 | 0.489 |
| 4.211 | 0.491 |
| 4.212 | 0.494 |
| 4.213 | 0.496 |
| 4.214 | 0.498 |
| 4.215 | 0.501 |
| 4.216 | 0.503 |
| 4.217 | 0.506 |
| 4.218 | 0.508 |
| 4.219 | 0.511 |
| 4.22 | 0.513 |
| 4.221 | 0.516 |
| 4.222 | 0.518 |
| 4.223 | 0.52 |
| 4.224 | 0.523 |
| 4.225 | 0.525 |
| 4.226 | 0.528 |
| 4.227 | 0.53 |
| 4.228 | 0.533 |
| 4.229 | 0.535 |
| 4.23 | 0.538 |
| 4.231 | 0.54 |
| 4.232 | 0.543 |
| 4.233 | 0.545 |
| 4.234 | 0.548 |
| 4.235 | 0.55 |
| 4.236 | 0.552 |
| 4.237 | 0.555 |
| 4.238 | 0.557 |
| 4.239 | 0.56 |
| 4.24 | 0.562 |
| 4.241 | 0.565 |
| 4.242 | 0.567 |
| 4.243 | 0.57 |
| 4.244 | 0.572 |
| 4.245 | 0.575 |
| 4.246 | 0.577 |
| 4.247 | 0.58 |
| 4.248 | 0.582 |
| 4.249 | 0.585 |
| 4.25 | 0.587 |
| 4.251 | 0.59 |
| 4.252 | 0.592 |
| 4.253 | 0.595 |
| 4.254 | 0.597 |
| 4.255 | 0.6 |
| 4.256 | 0.602 |
| 4.257 | 0.604 |
| 4.258 | 0.607 |
| 4.259 | 0.61 |
| 4.26 | 0.612 |
| 4.261 | 0.614 |
| 4.262 | 0.617 |
| 4.263 | 0.619 |
| 4.264 | 0.622 |
| 4.265 | 0.624 |
| 4.266 | 0.627 |
| 4.267 | 0.629 |
| 4.268 | 0.632 |
| 4.269 | 0.634 |
| 4.27 | 0.637 |
| 4.271 | 0.639 |
| 4.272 | 0.642 |
| 4.273 | 0.644 |
| 4.274 | 0.647 |
| 4.275 | 0.649 |
| 4.276 | 0.652 |
| 4.277 | 0.654 |
| 4.278 | 0.657 |
| 4.279 | 0.659 |
| 4.28 | 0.662 |
| 4.281 | 0.664 |
| 4.282 | 0.667 |
| 4.283 | 0.669 |
| 4.284 | 0.672 |
| 4.285 | 0.674 |
| 4.286 | 0.677 |
| 4.287 | 0.679 |
| 4.288 | 0.682 |
| 4.289 | 0.684 |
| 4.29 | 0.687 |
| 4.291 | 0.689 |
| 4.292 | 0.692 |
| 4.293 | 0.694 |
| 4.294 | 0.697 |
| 4.295 | 0.7 |
| 4.296 | 0.702 |
| 4.297 | 0.704 |
| 4.298 | 0.707 |
| 4.299 | 0.71 |
| 4.3 | 0.712 |
| 4.301 | 0.715 |
| 4.302 | 0.717 |
| 4.303 | 0.72 |
| 4.304 | 0.722 |
| 4.305 | 0.725 |
| 4.306 | 0.727 |
| 4.307 | 0.73 |
| 4.308 | 0.732 |
| 4.309 | 0.735 |
| 4.31 | 0.737 |
| 4.311 | 0.74 |
| 4.312 | 0.742 |
| 4.313 | 0.745 |
| 4.314 | 0.747 |
| 4.315 | 0.75 |
| 4.316 | 0.752 |
| 4.317 | 0.755 |
| 4.318 | 0.758 |
| 4.319 | 0.76 |
| 4.32 | 0.762 |
| 4.321 | 0.765 |
| 4.322 | 0.768 |
| 4.323 | 0.77 |
| 4.324 | 0.773 |
| 4.325 | 0.775 |
| 4.326 | 0.778 |
| 4.327 | 0.78 |
| 4.328 | 0.783 |
| 4.329 | 0.785 |
| 4.33 | 0.788 |
| 4.331 | 0.79 |
| 4.332 | 0.793 |
| 4.333 | 0.796 |
| 4.334 | 0.798 |
| 4.335 | 0.801 |
| 4.336 | 0.803 |
| 4.337 | 0.806 |
| 4.338 | 0.808 |
| 4.339 | 0.811 |
| 4.34 | 0.813 |
| 4.341 | 0.816 |
| 4.342 | 0.818 |
| 4.343 | 0.821 |
| 4.344 | 0.824 |
| 4.345 | 0.826 |
| 4.346 | 0.829 |
| 4.347 | 0.831 |
| 4.348 | 0.834 |
| 4.349 | 0.836 |
| 4.35 | 0.839 |
| 4.351 | 0.841 |
| 4.352 | 0.844 |
| 4.353 | 0.846 |
| 4.354 | 0.849 |
| 4.355 | 0.852 |
| 4.356 | 0.854 |
| 4.357 | 0.857 |
| 4.358 | 0.859 |
| 4.359 | 0.862 |
| 4.36 | 0.864 |
| 4.361 | 0.867 |
| 4.362 | 0.87 |
| 4.363 | 0.872 |
| 4.364 | 0.875 |
| 4.365 | 0.877 |
| 4.366 | 0.88 |
| 4.367 | 0.882 |
| 4.368 | 0.885 |
| 4.369 | 0.888 |
| 4.37 | 0.89 |
| 4.371 | 0.893 |
| 4.372 | 0.895 |
| 4.373 | 0.898 |
| 4.374 | 0.9 |
| 4.375 | 0.903 |
| 4.376 | 0.906 |
| 4.377 | 0.908 |
| 4.378 | 0.911 |
| 4.379 | 0.913 |
| 4.38 | 0.916 |
| 4.381 | 0.918 |
| 4.382 | 0.921 |
| 4.383 | 0.924 |
| 4.384 | 0.926 |
| 4.385 | 0.929 |
| 4.386 | 0.931 |
| 4.387 | 0.934 |
| 4.388 | 0.936 |
| 4.389 | 0.939 |
| 4.39 | 0.942 |
| 4.391 | 0.944 |
| 4.392 | 0.947 |
| 4.393 | 0.949 |
| 4.394 | 0.952 |
| 4.395 | 0.954 |
| 4.396 | 0.957 |
| 4.397 | 0.96 |
| 4.398 | 0.962 |
| 4.399 | 0.965 |
| 4.4 | 0.968 |
| 4.401 | 0.97 |
| 4.402 | 0.973 |
| 4.403 | 0.975 |
| 4.404 | 0.978 |
| 4.405 | 0.98 |
| 4.406 | 0.983 |
| 4.407 | 0.986 |
| 4.408 | 0.988 |
| 4.409 | 0.991 |
| 4.41 | 0.994 |
| 4.411 | 0.996 |
| 4.412 | 0.999 |
| 4.413 | 1.001 |
| 4.414 | 1.004 |
| 4.415 | 1.006 |
| 4.416 | 1.009 |
| 4.417 | 1.012 |
| 4.418 | 1.014 |
| 4.419 | 1.017 |
| 4.42 | 1.02 |
| 4.421 | 1.022 |
| 4.422 | 1.025 |
| 4.423 | 1.027 |
| 4.424 | 1.03 |
| 4.425 | 1.033 |
| 4.426 | 1.035 |
| 4.427 | 1.038 |
| 4.428 | 1.04 |
| 4.429 | 1.043 |
| 4.43 | 1.046 |
| 4.431 | 1.048 |
| 4.432 | 1.051 |
| 4.433 | 1.054 |
| 4.434 | 1.056 |
| 4.435 | 1.059 |
| 4.436 | 1.061 |
| 4.437 | 1.064 |
| 4.438 | 1.067 |
| 4.439 | 1.069 |
| 4.44 | 1.072 |
| 4.441 | 1.074 |
| 4.442 | 1.077 |
| 4.443 | 1.08 |
| 4.444 | 1.082 |
| 4.445 | 1.085 |
| 4.446 | 1.088 |
| 4.447 | 1.09 |
| 4.448 | 1.093 |
| 4.449 | 1.096 |
| 4.45 | 1.098 |
| 4.451 | 1.101 |
| 4.452 | 1.103 |
| 4.453 | 1.106 |
| 4.454 | 1.109 |
| 4.455 | 1.111 |
| 4.456 | 1.114 |
| 4.457 | 1.116 |
| 4.458 | 1.119 |
| 4.459 | 1.122 |
| 4.46 | 1.124 |
| 4.461 | 1.127 |
| 4.462 | 1.13 |
| 4.463 | 1.132 |
| 4.464 | 1.135 |
| 4.465 | 1.138 |
| 4.466 | 1.14 |
| 4.467 | 1.143 |
| 4.468 | 1.146 |
| 4.469 | 1.148 |
| 4.47 | 1.151 |
| 4.471 | 1.154 |
| 4.472 | 1.156 |
| 4.473 | 1.159 |
| 4.474 | 1.162 |
| 4.475 | 1.164 |
| 4.476 | 1.167 |
| 4.477 | 1.169 |
| 4.478 | 1.172 |
| 4.479 | 1.175 |
| 4.48 | 1.177 |
| 4.481 | 1.18 |
| 4.482 | 1.183 |
| 4.483 | 1.185 |
| 4.484 | 1.188 |
| 4.485 | 1.191 |
| 4.486 | 1.193 |
| 4.487 | 1.196 |
| 4.488 | 1.199 |
| 4.489 | 1.201 |
| 4.49 | 1.204 |
| 4.491 | 1.207 |
| 4.492 | 1.209 |
| 4.493 | 1.212 |
| 4.494 | 1.215 |
| 4.495 | 1.217 |
| 4.496 | 1.22 |
| 4.497 | 1.223 |
| 4.498 | 1.225 |
| 4.499 | 1.228 |
| 4.5 | 1.231 |
| 4.501 | 1.233 |
| 4.502 | 1.236 |
| 4.503 | 1.239 |
| 4.504 | 1.241 |
| 4.505 | 1.244 |
| 4.506 | 1.247 |
| 4.507 | 1.249 |
| 4.508 | 1.252 |
| 4.509 | 1.255 |
| 4.51 | 1.257 |
| 4.511 | 1.26 |
| 4.512 | 1.263 |
| 4.513 | 1.265 |
| 4.514 | 1.268 |
| 4.515 | 1.271 |
| 4.516 | 1.274 |
| 4.517 | 1.276 |
| 4.518 | 1.279 |
| 4.519 | 1.282 |
| 4.52 | 1.284 |
| 4.521 | 1.287 |
| 4.522 | 1.29 |
| 4.523 | 1.292 |
| 4.524 | 1.295 |
| 4.525 | 1.298 |
| 4.526 | 1.3 |
| 4.527 | 1.303 |
| 4.528 | 1.306 |
| 4.529 | 1.308 |
| 4.53 | 1.311 |
| 4.531 | 1.314 |
| 4.532 | 1.316 |
| 4.533 | 1.319 |
| 4.534 | 1.322 |
| 4.535 | 1.325 |
| 4.536 | 1.327 |
| 4.537 | 1.33 |
| 4.538 | 1.333 |
| 4.539 | 1.335 |
| 4.54 | 1.338 |
| 4.541 | 1.341 |
| 4.542 | 1.344 |
| 4.543 | 1.346 |
| 4.544 | 1.349 |
| 4.545 | 1.352 |
| 4.546 | 1.354 |
| 4.547 | 1.357 |
| 4.548 | 1.36 |
| 4.549 | 1.362 |
| 4.55 | 1.365 |
| 4.551 | 1.368 |
| 4.552 | 1.371 |
| 4.553 | 1.373 |
| 4.554 | 1.376 |
| 4.555 | 1.379 |
| 4.556 | 1.381 |
| 4.557 | 1.384 |
| 4.558 | 1.387 |
| 4.559 | 1.39 |
| 4.56 | 1.392 |
| 4.561 | 1.395 |
| 4.562 | 1.398 |
| 4.563 | 1.4 |
| 4.564 | 1.403 |
| 4.565 | 1.406 |
| 4.566 | 1.409 |
| 4.567 | 1.411 |
| 4.568 | 1.414 |
| 4.569 | 1.417 |
| 4.57 | 1.42 |
| 4.571 | 1.422 |
| 4.572 | 1.425 |
| 4.573 | 1.428 |
| 4.574 | 1.43 |
| 4.575 | 1.433 |
| 4.576 | 1.436 |
| 4.577 | 1.439 |
| 4.578 | 1.441 |
| 4.579 | 1.444 |
| 4.58 | 1.447 |
| 4.581 | 1.45 |
| 4.582 | 1.452 |
| 4.583 | 1.455 |
| 4.584 | 1.458 |
| 4.585 | 1.46 |
| 4.586 | 1.463 |
| 4.587 | 1.466 |
| 4.588 | 1.469 |
| 4.589 | 1.471 |
| 4.59 | 1.474 |
| 4.591 | 1.477 |
| 4.592 | 1.48 |
| 4.593 | 1.482 |
| 4.594 | 1.485 |
| 4.595 | 1.488 |
| 4.596 | 1.491 |
| 4.597 | 1.493 |
| 4.598 | 1.496 |
| 4.599 | 1.499 |
| 4.6 | 1.502 |
| 4.601 | 1.504 |
| 4.602 | 1.507 |
| 4.603 | 1.51 |
| 4.604 | 1.513 |
| 4.605 | 1.515 |
| 4.606 | 1.518 |
| 4.607 | 1.521 |
| 4.608 | 1.524 |
| 4.609 | 1.526 |
| 4.61 | 1.529 |
| 4.611 | 1.532 |
| 4.612 | 1.535 |
| 4.613 | 1.537 |
| 4.614 | 1.54 |
| 4.615 | 1.543 |
| 4.616 | 1.546 |
| 4.617 | 1.548 |
| 4.618 | 1.551 |
| 4.619 | 1.554 |
| 4.62 | 1.557 |
| 4.621 | 1.56 |
| 4.622 | 1.562 |
| 4.623 | 1.565 |
| 4.624 | 1.568 |
| 4.625 | 1.571 |
| 4.626 | 1.573 |
| 4.627 | 1.576 |
| 4.628 | 1.579 |
| 4.629 | 1.582 |
| 4.63 | 1.584 |
| 4.631 | 1.587 |
| 4.632 | 1.59 |
| 4.633 | 1.593 |
| 4.634 | 1.596 |
| 4.635 | 1.598 |
| 4.636 | 1.601 |
| 4.637 | 1.604 |
| 4.638 | 1.607 |
| 4.639 | 1.61 |
| 4.64 | 1.612 |
| 4.641 | 1.615 |
| 4.642 | 1.618 |
| 4.643 | 1.621 |
| 4.644 | 1.623 |
| 4.645 | 1.626 |
| 4.646 | 1.629 |
| 4.647 | 1.632 |
| 4.648 | 1.634 |
| 4.649 | 1.637 |
| 4.65 | 1.64 |
| 4.651 | 1.643 |
| 4.652 | 1.646 |
| 4.653 | 1.648 |
| 4.654 | 1.651 |
| 4.655 | 1.654 |
| 4.656 | 1.657 |
| 4.657 | 1.66 |
| 4.658 | 1.662 |
| 4.659 | 1.665 |
| 4.66 | 1.668 |
| 4.661 | 1.671 |
| 4.662 | 1.674 |
| 4.663 | 1.676 |
| 4.664 | 1.679 |
| 4.665 | 1.682 |
| 4.666 | 1.685 |
| 4.667 | 1.688 |
| 4.668 | 1.69 |
| 4.669 | 1.693 |
| 4.67 | 1.696 |
| 4.671 | 1.699 |
| 4.672 | 1.702 |
| 4.673 | 1.704 |
| 4.674 | 1.707 |
| 4.675 | 1.71 |
| 4.676 | 1.713 |
| 4.677 | 1.716 |
| 4.678 | 1.718 |
| 4.679 | 1.721 |
| 4.68 | 1.724 |
| 4.681 | 1.727 |
| 4.682 | 1.73 |
| 4.683 | 1.733 |
| 4.684 | 1.735 |
| 4.685 | 1.738 |
| 4.686 | 1.741 |
| 4.687 | 1.744 |
| 4.688 | 1.747 |
| 4.689 | 1.75 |
| 4.69 | 1.752 |
| 4.691 | 1.755 |
| 4.692 | 1.758 |
| 4.693 | 1.761 |
| 4.694 | 1.764 |
| 4.695 | 1.766 |
| 4.696 | 1.769 |
| 4.697 | 1.772 |
| 4.698 | 1.775 |
| 4.699 | 1.778 |
| 4.7 | 1.781 |
| 4.701 | 1.783 |
| 4.702 | 1.786 |
| 4.703 | 1.789 |
| 4.704 | 1.792 |
| 4.705 | 1.795 |
| 4.706 | 1.798 |
| 4.707 | 1.8 |
| 4.708 | 1.803 |
| 4.709 | 1.806 |
| 4.71 | 1.809 |
| 4.711 | 1.812 |
| 4.712 | 1.815 |
| 4.713 | 1.818 |
| 4.714 | 1.82 |
| 4.715 | 1.823 |
| 4.716 | 1.826 |
| 4.717 | 1.829 |
| 4.718 | 1.832 |
| 4.719 | 1.834 |
| 4.72 | 1.837 |
| 4.721 | 1.84 |
| 4.722 | 1.843 |
| 4.723 | 1.846 |
| 4.724 | 1.849 |
| 4.725 | 1.852 |
| 4.726 | 1.854 |
| 4.727 | 1.857 |
| 4.728 | 1.86 |
| 4.729 | 1.863 |
| 4.73 | 1.866 |
| 4.731 | 1.869 |
| 4.732 | 1.872 |
| 4.733 | 1.874 |
| 4.734 | 1.877 |
| 4.735 | 1.88 |
| 4.736 | 1.883 |
| 4.737 | 1.886 |
| 4.738 | 1.889 |
| 4.739 | 1.892 |
| 4.74 | 1.894 |
| 4.741 | 1.897 |
| 4.742 | 1.9 |
| 4.743 | 1.903 |
| 4.744 | 1.906 |
| 4.745 | 1.909 |
| 4.746 | 1.912 |
| 4.747 | 1.915 |
| 4.748 | 1.917 |
| 4.749 | 1.92 |
| 4.75 | 1.923 |
| 4.751 | 1.926 |
| 4.752 | 1.929 |
| 4.753 | 1.932 |
| 4.754 | 1.935 |
| 4.755 | 1.938 |
| 4.756 | 1.94 |
| 4.757 | 1.943 |
| 4.758 | 1.946 |
| 4.759 | 1.949 |
| 4.76 | 1.952 |
| 4.761 | 1.955 |
| 4.762 | 1.958 |
| 4.763 | 1.961 |
| 4.764 | 1.964 |
| 4.765 | 1.966 |
| 4.766 | 1.969 |
| 4.767 | 1.972 |
| 4.768 | 1.975 |
| 4.769 | 1.978 |
| 4.77 | 1.981 |
| 4.771 | 1.984 |
| 4.772 | 1.986 |
| 4.773 | 1.989 |
| 4.774 | 1.992 |
| 4.775 | 1.995 |
| 4.776 | 1.998 |
| 4.777 | 2.001 |
| 4.778 | 2.004 |
| 4.779 | 2.007 |
| 4.78 | 2.01 |
| 4.781 | 2.013 |
| 4.782 | 2.015 |
| 4.783 | 2.018 |
| 4.784 | 2.021 |
| 4.785 | 2.024 |
| 4.786 | 2.027 |
| 4.787 | 2.03 |
| 4.788 | 2.033 |
| 4.789 | 2.036 |
| 4.79 | 2.039 |
| 4.791 | 2.042 |
| 4.792 | 2.045 |
| 4.793 | 2.047 |
| 4.794 | 2.05 |
| 4.795 | 2.053 |
| 4.796 | 2.056 |
| 4.797 | 2.059 |
| 4.798 | 2.062 |
| 4.799 | 2.065 |
| 4.8 | 2.068 |
| 4.801 | 2.071 |
| 4.802 | 2.074 |
| 4.803 | 2.076 |
| 4.804 | 2.08 |
| 4.805 | 2.082 |
| 4.806 | 2.085 |
| 4.807 | 2.088 |
| 4.808 | 2.091 |
| 4.809 | 2.094 |
| 4.81 | 2.097 |
| 4.811 | 2.1 |
| 4.812 | 2.103 |
| 4.813 | 2.106 |
| 4.814 | 2.109 |
| 4.815 | 2.112 |
| 4.816 | 2.114 |
| 4.817 | 2.117 |
| 4.818 | 2.12 |
| 4.819 | 2.123 |
| 4.82 | 2.126 |
| 4.821 | 2.129 |
| 4.822 | 2.132 |
| 4.823 | 2.135 |
| 4.824 | 2.138 |
| 4.825 | 2.141 |
| 4.826 | 2.144 |
| 4.827 | 2.147 |
| 4.828 | 2.15 |
| 4.829 | 2.153 |
| 4.83 | 2.156 |
| 4.831 | 2.158 |
| 4.832 | 2.161 |
| 4.833 | 2.164 |
| 4.834 | 2.167 |
| 4.835 | 2.17 |
| 4.836 | 2.173 |
| 4.837 | 2.176 |
| 4.838 | 2.179 |
| 4.839 | 2.182 |
| 4.84 | 2.185 |
| 4.841 | 2.188 |
| 4.842 | 2.191 |
| 4.843 | 2.194 |
| 4.844 | 2.197 |
| 4.845 | 2.2 |
| 4.846 | 2.203 |
| 4.847 | 2.206 |
| 4.848 | 2.209 |
| 4.849 | 2.212 |
| 4.85 | 2.214 |
| 4.851 | 2.218 |
| 4.852 | 2.22 |
| 4.853 | 2.223 |
| 4.854 | 2.226 |
| 4.855 | 2.229 |
| 4.856 | 2.232 |
| 4.857 | 2.235 |
| 4.858 | 2.238 |
| 4.859 | 2.241 |
| 4.86 | 2.244 |
| 4.861 | 2.247 |
| 4.862 | 2.25 |
| 4.863 | 2.253 |
| 4.864 | 2.256 |
| 4.865 | 2.259 |
| 4.866 | 2.262 |
| 4.867 | 2.265 |
| 4.868 | 2.268 |
| 4.869 | 2.271 |
| 4.87 | 2.274 |
| 4.871 | 2.277 |
| 4.872 | 2.28 |
| 4.873 | 2.283 |
| 4.874 | 2.286 |
| 4.875 | 2.289 |
| 4.876 | 2.292 |
| 4.877 | 2.295 |
| 4.878 | 2.298 |
| 4.879 | 2.301 |
| 4.88 | 2.304 |
| 4.881 | 2.306 |
| 4.882 | 2.31 |
| 4.883 | 2.312 |
| 4.884 | 2.316 |
| 4.885 | 2.318 |
| 4.886 | 2.321 |
| 4.887 | 2.324 |
| 4.888 | 2.327 |
| 4.889 | 2.33 |
| 4.89 | 2.333 |
| 4.891 | 2.336 |
| 4.892 | 2.339 |
| 4.893 | 2.342 |
| 4.894 | 2.345 |
| 4.895 | 2.348 |
| 4.896 | 2.351 |
| 4.897 | 2.354 |
| 4.898 | 2.357 |
| 4.899 | 2.36 |
| 4.9 | 2.363 |
| 4.901 | 2.366 |
| 4.902 | 2.369 |
| 4.903 | 2.372 |
| 4.904 | 2.375 |
| 4.905 | 2.378 |
| 4.906 | 2.381 |
| 4.907 | 2.384 |
| 4.908 | 2.387 |
| 4.909 | 2.39 |
| 4.91 | 2.393 |
| 4.911 | 2.396 |
| 4.912 | 2.399 |
| 4.913 | 2.402 |
| 4.914 | 2.405 |
| 4.915 | 2.408 |
| 4.916 | 2.411 |
| 4.917 | 2.414 |
| 4.918 | 2.417 |
| 4.919 | 2.42 |
| 4.92 | 2.424 |
| 4.921 | 2.426 |
| 4.922 | 2.43 |
| 4.923 | 2.432 |
| 4.924 | 2.436 |
| 4.925 | 2.438 |
| 4.926 | 2.442 |
| 4.927 | 2.445 |
| 4.928 | 2.448 |
| 4.929 | 2.451 |
| 4.93 | 2.454 |
| 4.931 | 2.457 |
| 4.932 | 2.46 |
| 4.933 | 2.463 |
| 4.934 | 2.466 |
| 4.935 | 2.469 |
| 4.936 | 2.472 |
| 4.937 | 2.475 |
| 4.938 | 2.478 |
| 4.939 | 2.481 |
| 4.94 | 2.484 |
| 4.941 | 2.487 |
| 4.942 | 2.49 |
| 4.943 | 2.493 |
| 4.944 | 2.496 |
| 4.945 | 2.499 |
| 4.946 | 2.502 |
| 4.947 | 2.505 |
| 4.948 | 2.508 |
| 4.949 | 2.511 |
| 4.95 | 2.514 |
| 4.951 | 2.517 |
| 4.952 | 2.52 |
| 4.953 | 2.523 |
| 4.954 | 2.526 |
| 4.955 | 2.53 |
| 4.956 | 2.533 |
| 4.957 | 2.536 |
| 4.958 | 2.539 |
| 4.959 | 2.542 |
| 4.96 | 2.545 |
| 4.961 | 2.548 |
| 4.962 | 2.551 |
| 4.963 | 2.554 |
| 4.964 | 2.557 |
| 4.965 | 2.56 |
| 4.966 | 2.563 |
| 4.967 | 2.566 |
| 4.968 | 2.569 |
| 4.969 | 2.572 |
| 4.97 | 2.575 |
| 4.971 | 2.578 |
| 4.972 | 2.581 |
| 4.973 | 2.584 |
| 4.974 | 2.588 |
| 4.975 | 2.591 |
| 4.976 | 2.594 |
| 4.977 | 2.597 |
| 4.978 | 2.6 |
| 4.979 | 2.603 |
| 4.98 | 2.606 |
| 4.981 | 2.609 |
| 4.982 | 2.612 |
| 4.983 | 2.615 |
| 4.984 | 2.618 |
| 4.985 | 2.621 |
| 4.986 | 2.624 |
| 4.987 | 2.627 |
| 4.988 | 2.63 |
| 4.989 | 2.634 |
| 4.99 | 2.637 |
| 4.991 | 2.64 |
| 4.992 | 2.643 |
| 4.993 | 2.646 |
| 4.994 | 2.649 |
| 4.995 | 2.652 |
| 4.996 | 2.655 |
| 4.997 | 2.658 |
| 4.998 | 2.661 |
| 4.999 | 2.664 |
| 5.0 | 2.667 |
| 5.001 | 2.67 |
| 5.002 | 2.674 |
| 5.003 | 2.677 |
| 5.004 | 2.68 |
| 5.005 | 2.683 |
| 5.006 | 2.686 |
| 5.007 | 2.689 |
| 5.008 | 2.692 |
| 5.009 | 2.695 |
| 5.01 | 2.698 |
| 5.011 | 2.701 |
| 5.012 | 2.704 |
| 5.013 | 2.708 |
| 5.014 | 2.711 |
| 5.015 | 2.714 |
| 5.016 | 2.717 |
| 5.017 | 2.72 |
| 5.018 | 2.723 |
| 5.019 | 2.726 |
| 5.02 | 2.729 |
| 5.021 | 2.732 |
| 5.022 | 2.736 |
| 5.023 | 2.739 |
| 5.024 | 2.742 |
| 5.025 | 2.745 |
| 5.026 | 2.748 |
| 5.027 | 2.751 |
| 5.028 | 2.754 |
| 5.029 | 2.757 |
| 5.03 | 2.76 |
| 5.031 | 2.763 |
| 5.032 | 2.767 |
| 5.033 | 2.77 |
| 5.034 | 2.773 |
| 5.035 | 2.776 |
| 5.036 | 2.779 |
| 5.037 | 2.782 |
| 5.038 | 2.785 |
| 5.039 | 2.788 |
| 5.04 | 2.792 |
| 5.041 | 2.795 |
| 5.042 | 2.798 |
| 5.043 | 2.801 |
| 5.044 | 2.804 |
| 5.045 | 2.807 |
| 5.046 | 2.81 |
| 5.047 | 2.813 |
| 5.048 | 2.816 |
| 5.049 | 2.82 |
| 5.05 | 2.823 |
| 5.051 | 2.826 |
| 5.052 | 2.829 |
| 5.053 | 2.832 |
| 5.054 | 2.835 |
| 5.055 | 2.838 |
| 5.056 | 2.842 |
| 5.057 | 2.845 |
| 5.058 | 2.848 |
| 5.059 | 2.851 |
| 5.06 | 2.854 |
| 5.061 | 2.857 |
| 5.062 | 2.86 |
| 5.063 | 2.864 |
| 5.064 | 2.867 |
| 5.065 | 2.87 |
| 5.066 | 2.873 |
| 5.067 | 2.876 |
| 5.068 | 2.879 |
| 5.069 | 2.882 |
| 5.07 | 2.886 |
| 5.071 | 2.889 |
| 5.072 | 2.892 |
| 5.073 | 2.895 |
| 5.074 | 2.898 |
| 5.075 | 2.901 |
| 5.076 | 2.904 |
| 5.077 | 2.908 |
| 5.078 | 2.911 |
| 5.079 | 2.914 |
| 5.08 | 2.917 |
| 5.081 | 2.92 |
| 5.082 | 2.923 |
| 5.083 | 2.926 |
| 5.084 | 2.93 |
| 5.085 | 2.933 |
| 5.086 | 2.936 |
| 5.087 | 2.939 |
| 5.088 | 2.942 |
| 5.089 | 2.945 |
| 5.09 | 2.948 |
| 5.091 | 2.952 |
| 5.092 | 2.955 |
| 5.093 | 2.958 |
| 5.094 | 2.961 |
| 5.095 | 2.964 |
| 5.096 | 2.968 |
| 5.097 | 2.971 |
| 5.098 | 2.974 |
| 5.099 | 2.977 |
| 5.1 | 2.98 |
| 5.101 | 2.983 |
| 5.102 | 2.987 |
| 5.103 | 2.99 |
| 5.104 | 2.993 |
| 5.105 | 2.996 |
| 5.106 | 2.999 |
| 5.107 | 3.002 |
| 5.108 | 3.006 |
| 5.109 | 3.009 |
| 5.11 | 3.012 |
| 5.111 | 3.015 |
| 5.112 | 3.018 |
| 5.113 | 3.022 |
| 5.114 | 3.025 |
| 5.115 | 3.028 |
| 5.116 | 3.031 |
| 5.117 | 3.034 |
| 5.118 | 3.038 |
| 5.119 | 3.041 |
| 5.12 | 3.044 |
| 5.121 | 3.047 |
| 5.122 | 3.05 |
| 5.123 | 3.053 |
| 5.124 | 3.057 |
| 5.125 | 3.06 |
| 5.126 | 3.063 |
| 5.127 | 3.066 |
| 5.128 | 3.069 |
| 5.129 | 3.073 |
| 5.13 | 3.076 |
| 5.131 | 3.079 |
| 5.132 | 3.082 |
| 5.133 | 3.085 |
| 5.134 | 3.089 |
| 5.135 | 3.092 |
| 5.136 | 3.095 |
| 5.137 | 3.098 |
| 5.138 | 3.101 |
| 5.139 | 3.105 |
| 5.14 | 3.108 |
| 5.141 | 3.111 |
| 5.142 | 3.114 |
| 5.143 | 3.118 |
| 5.144 | 3.121 |
| 5.145 | 3.124 |
| 5.146 | 3.127 |
| 5.147 | 3.13 |
| 5.148 | 3.134 |
| 5.149 | 3.137 |
| 5.15 | 3.14 |
| 5.151 | 3.143 |
| 5.152 | 3.146 |
| 5.153 | 3.15 |
| 5.154 | 3.153 |
| 5.155 | 3.156 |
| 5.156 | 3.159 |
| 5.157 | 3.162 |
| 5.158 | 3.166 |
| 5.159 | 3.169 |
| 5.16 | 3.172 |
| 5.161 | 3.175 |
| 5.162 | 3.179 |
| 5.163 | 3.182 |
| 5.164 | 3.185 |
| 5.165 | 3.188 |
| 5.166 | 3.192 |
| 5.167 | 3.195 |
| 5.168 | 3.198 |
| 5.169 | 3.201 |
| 5.17 | 3.204 |
| 5.171 | 3.208 |
| 5.172 | 3.211 |
| 5.173 | 3.214 |
| 5.174 | 3.218 |
| 5.175 | 3.221 |
| 5.176 | 3.224 |
| 5.177 | 3.227 |
| 5.178 | 3.23 |
| 5.179 | 3.234 |
| 5.18 | 3.237 |
| 5.181 | 3.24 |
| 5.182 | 3.243 |
| 5.183 | 3.247 |
| 5.184 | 3.25 |
| 5.185 | 3.253 |
| 5.186 | 3.256 |
| 5.187 | 3.26 |
| 5.188 | 3.263 |
| 5.189 | 3.266 |
| 5.19 | 3.269 |
| 5.191 | 3.273 |
| 5.192 | 3.276 |
| 5.193 | 3.279 |
| 5.194 | 3.282 |
| 5.195 | 3.286 |
| 5.196 | 3.289 |
| 5.197 | 3.292 |
| 5.198 | 3.296 |
| 5.199 | 3.299 |
| 5.2 | 3.302 |
| 5.201 | 3.305 |
| 5.202 | 3.308 |
| 5.203 | 3.312 |
| 5.204 | 3.315 |
| 5.205 | 3.318 |
| 5.206 | 3.322 |
| 5.207 | 3.325 |
| 5.208 | 3.328 |
| 5.209 | 3.331 |
| 5.21 | 3.335 |
| 5.211 | 3.338 |
| 5.212 | 3.341 |
| 5.213 | 3.344 |
| 5.214 | 3.348 |
| 5.215 | 3.351 |
| 5.216 | 3.354 |
| 5.217 | 3.358 |
| 5.218 | 3.361 |
| 5.219 | 3.364 |
| 5.22 | 3.367 |
| 5.221 | 3.371 |
| 5.222 | 3.374 |
| 5.223 | 3.377 |
| 5.224 | 3.381 |
| 5.225 | 3.384 |
| 5.226 | 3.387 |
| 5.227 | 3.39 |
| 5.228 | 3.394 |
| 5.229 | 3.397 |
| 5.23 | 3.4 |
| 5.231 | 3.404 |
| 5.232 | 3.407 |
| 5.233 | 3.41 |
| 5.234 | 3.414 |
| 5.235 | 3.417 |
| 5.236 | 3.42 |
| 5.237 | 3.423 |
| 5.238 | 3.427 |
| 5.239 | 3.43 |
| 5.24 | 3.433 |
| 5.241 | 3.436 |
| 5.242 | 3.44 |
| 5.243 | 3.443 |
| 5.244 | 3.446 |
| 5.245 | 3.45 |
| 5.246 | 3.453 |
| 5.247 | 3.456 |
| 5.248 | 3.46 |
| 5.249 | 3.463 |
| 5.25 | 3.466 |
| 5.251 | 3.47 |
| 5.252 | 3.473 |
| 5.253 | 3.476 |
| 5.254 | 3.48 |
| 5.255 | 3.483 |
| 5.256 | 3.486 |
| 5.257 | 3.49 |
| 5.258 | 3.493 |
| 5.259 | 3.496 |
| 5.26 | 3.499 |
| 5.261 | 3.503 |
| 5.262 | 3.506 |
| 5.263 | 3.509 |
| 5.264 | 3.513 |
| 5.265 | 3.516 |
| 5.266 | 3.519 |
| 5.267 | 3.523 |
| 5.268 | 3.526 |
| 5.269 | 3.529 |
| 5.27 | 3.533 |
| 5.271 | 3.536 |
| 5.272 | 3.539 |
| 5.273 | 3.543 |
| 5.274 | 3.546 |
| 5.275 | 3.549 |
| 5.276 | 3.553 |
| 5.277 | 3.556 |
| 5.278 | 3.559 |
| 5.279 | 3.563 |
| 5.28 | 3.566 |
| 5.281 | 3.569 |
| 5.282 | 3.573 |
| 5.283 | 3.576 |
| 5.284 | 3.579 |
| 5.285 | 3.583 |
| 5.286 | 3.586 |
| 5.287 | 3.589 |
| 5.288 | 3.593 |
| 5.289 | 3.596 |
| 5.29 | 3.599 |
| 5.291 | 3.603 |
| 5.292 | 3.606 |
| 5.293 | 3.609 |
| 5.294 | 3.613 |
| 5.295 | 3.616 |
| 5.296 | 3.62 |
| 5.297 | 3.623 |
| 5.298 | 3.626 |
| 5.299 | 3.63 |
| 5.3 | 3.633 |
| 5.301 | 3.636 |
| 5.302 | 3.64 |
| 5.303 | 3.643 |
| 5.304 | 3.646 |
| 5.305 | 3.65 |
| 5.306 | 3.653 |
| 5.307 | 3.656 |
| 5.308 | 3.66 |
| 5.309 | 3.663 |
| 5.31 | 3.666 |
| 5.311 | 3.67 |
| 5.312 | 3.673 |
| 5.313 | 3.677 |
| 5.314 | 3.68 |
| 5.315 | 3.683 |
| 5.316 | 3.687 |
| 5.317 | 3.69 |
| 5.318 | 3.693 |
| 5.319 | 3.697 |
| 5.32 | 3.7 |
| 5.321 | 3.704 |
| 5.322 | 3.707 |
| 5.323 | 3.71 |
| 5.324 | 3.714 |
| 5.325 | 3.717 |
| 5.326 | 3.72 |
| 5.327 | 3.724 |
| 5.328 | 3.727 |
| 5.329 | 3.731 |
| 5.33 | 3.734 |
| 5.331 | 3.737 |
| 5.332 | 3.741 |
| 5.333 | 3.744 |
| 5.334 | 3.748 |
| 5.335 | 3.751 |
| 5.336 | 3.754 |
| 5.337 | 3.758 |
| 5.338 | 3.761 |
| 5.339 | 3.764 |
| 5.34 | 3.768 |
| 5.341 | 3.771 |
| 5.342 | 3.775 |
| 5.343 | 3.778 |
| 5.344 | 3.781 |
| 5.345 | 3.785 |
| 5.346 | 3.788 |
| 5.347 | 3.792 |
| 5.348 | 3.795 |
| 5.349 | 3.798 |
| 5.35 | 3.802 |
| 5.351 | 3.805 |
| 5.352 | 3.809 |
| 5.353 | 3.812 |
| 5.354 | 3.815 |
| 5.355 | 3.819 |
| 5.356 | 3.822 |
| 5.357 | 3.826 |
| 5.358 | 3.829 |
| 5.359 | 3.832 |
| 5.36 | 3.836 |
| 5.361 | 3.839 |
| 5.362 | 3.843 |
| 5.363 | 3.846 |
| 5.364 | 3.85 |
| 5.365 | 3.853 |
| 5.366 | 3.856 |
| 5.367 | 3.86 |
| 5.368 | 3.863 |
| 5.369 | 3.867 |
| 5.37 | 3.87 |
| 5.371 | 3.874 |
| 5.372 | 3.877 |
| 5.373 | 3.88 |
| 5.374 | 3.884 |
| 5.375 | 3.887 |
| 5.376 | 3.891 |
| 5.377 | 3.894 |
| 5.378 | 3.898 |
| 5.379 | 3.901 |
| 5.38 | 3.904 |
| 5.381 | 3.908 |
| 5.382 | 3.911 |
| 5.383 | 3.915 |
| 5.384 | 3.918 |
| 5.385 | 3.922 |
| 5.386 | 3.925 |
| 5.387 | 3.928 |
| 5.388 | 3.932 |
| 5.389 | 3.935 |
| 5.39 | 3.939 |
| 5.391 | 3.942 |
| 5.392 | 3.946 |
| 5.393 | 3.949 |
| 5.394 | 3.952 |
| 5.395 | 3.956 |
| 5.396 | 3.959 |
| 5.397 | 3.963 |
| 5.398 | 3.966 |
| 5.399 | 3.97 |
| 5.4 | 3.973 |
| 5.401 | 3.977 |
| 5.402 | 3.98 |
| 5.403 | 3.984 |
| 5.404 | 3.987 |
| 5.405 | 3.99 |
| 5.406 | 3.994 |
| 5.407 | 3.997 |
| 5.408 | 4.001 |
| 5.409 | 4.004 |
| 5.41 | 4.008 |
| 5.411 | 4.011 |
| 5.412 | 4.015 |
| 5.413 | 4.018 |
| 5.414 | 4.021 |
| 5.415 | 4.025 |
| 5.416 | 4.028 |
| 5.417 | 4.032 |
| 5.418 | 4.035 |
| 5.419 | 4.039 |
| 5.42 | 4.042 |
| 5.421 | 4.046 |
| 5.422 | 4.049 |
| 5.423 | 4.053 |
| 5.424 | 4.056 |
| 5.425 | 4.06 |
| 5.426 | 4.063 |
| 5.427 | 4.067 |
| 5.428 | 4.07 |
| 5.429 | 4.074 |
| 5.43 | 4.077 |
| 5.431 | 4.08 |
| 5.432 | 4.084 |
| 5.433 | 4.088 |
| 5.434 | 4.091 |
| 5.435 | 4.094 |
| 5.436 | 4.098 |
| 5.437 | 4.101 |
| 5.438 | 4.105 |
| 5.439 | 4.108 |
| 5.44 | 4.112 |
| 5.441 | 4.115 |
| 5.442 | 4.119 |
| 5.443 | 4.122 |
| 5.444 | 4.126 |
| 5.445 | 4.129 |
| 5.446 | 4.133 |
| 5.447 | 4.136 |
| 5.448 | 4.14 |
| 5.449 | 4.143 |
| 5.45 | 4.147 |
| 5.451 | 4.15 |
| 5.452 | 4.154 |
| 5.453 | 4.157 |
| 5.454 | 4.161 |
| 5.455 | 4.164 |
| 5.456 | 4.168 |
| 5.457 | 4.171 |
| 5.458 | 4.175 |
| 5.459 | 4.178 |
| 5.46 | 4.182 |
| 5.461 | 4.185 |
| 5.462 | 4.189 |
| 5.463 | 4.192 |
| 5.464 | 4.196 |
| 5.465 | 4.199 |
| 5.466 | 4.203 |
| 5.467 | 4.206 |
| 5.468 | 4.21 |
| 5.469 | 4.214 |
| 5.47 | 4.217 |
| 5.471 | 4.22 |
| 5.472 | 4.224 |
| 5.473 | 4.228 |
| 5.474 | 4.231 |
| 5.475 | 4.235 |
| 5.476 | 4.238 |
| 5.477 | 4.242 |
| 5.478 | 4.245 |
| 5.479 | 4.249 |
| 5.48 | 4.252 |
| 5.481 | 4.256 |
| 5.482 | 4.259 |
| 5.483 | 4.263 |
| 5.484 | 4.266 |
| 5.485 | 4.27 |
| 5.486 | 4.273 |
| 5.487 | 4.277 |
| 5.488 | 4.28 |
| 5.489 | 4.284 |
| 5.49 | 4.288 |
| 5.491 | 4.291 |
| 5.492 | 4.295 |
| 5.493 | 4.298 |
| 5.494 | 4.302 |
| 5.495 | 4.305 |
| 5.496 | 4.309 |
| 5.497 | 4.312 |
| 5.498 | 4.316 |
| 5.499 | 4.319 |
| 5.5 | 4.323 |
| 5.501 | 4.326 |
| 5.502 | 4.33 |
| 5.503 | 4.334 |
| 5.504 | 4.337 |
| 5.505 | 4.341 |
| 5.506 | 4.344 |
| 5.507 | 4.348 |
| 5.508 | 4.351 |
| 5.509 | 4.355 |
| 5.51 | 4.358 |
| 5.511 | 4.362 |
| 5.512 | 4.366 |
| 5.513 | 4.369 |
| 5.514 | 4.373 |
| 5.515 | 4.376 |
| 5.516 | 4.38 |
| 5.517 | 4.383 |
| 5.518 | 4.387 |
| 5.519 | 4.39 |
| 5.52 | 4.394 |
| 5.521 | 4.398 |
| 5.522 | 4.401 |
| 5.523 | 4.405 |
| 5.524 | 4.408 |
| 5.525 | 4.412 |
| 5.526 | 4.416 |
| 5.527 | 4.419 |
| 5.528 | 4.423 |
| 5.529 | 4.426 |
| 5.53 | 4.43 |
| 5.531 | 4.433 |
| 5.532 | 4.437 |
| 5.533 | 4.441 |
| 5.534 | 4.444 |
| 5.535 | 4.448 |
| 5.536 | 4.451 |
| 5.537 | 4.455 |
| 5.538 | 4.458 |
| 5.539 | 4.462 |
| 5.54 | 4.466 |
| 5.541 | 4.469 |
| 5.542 | 4.473 |
| 5.543 | 4.476 |
| 5.544 | 4.48 |
| 5.545 | 4.484 |
| 5.546 | 4.487 |
| 5.547 | 4.491 |
| 5.548 | 4.494 |
| 5.549 | 4.498 |
| 5.55 | 4.502 |
| 5.551 | 4.505 |
| 5.552 | 4.509 |
| 5.553 | 4.512 |
| 5.554 | 4.516 |
| 5.555 | 4.52 |
| 5.556 | 4.523 |
| 5.557 | 4.527 |
| 5.558 | 4.53 |
| 5.559 | 4.534 |
| 5.56 | 4.538 |
| 5.561 | 4.541 |
| 5.562 | 4.545 |
| 5.563 | 4.548 |
| 5.564 | 4.552 |
| 5.565 | 4.556 |
| 5.566 | 4.559 |
| 5.567 | 4.563 |
| 5.568 | 4.566 |
| 5.569 | 4.57 |
| 5.57 | 4.574 |
| 5.571 | 4.577 |
| 5.572 | 4.581 |
| 5.573 | 4.584 |
| 5.574 | 4.588 |
| 5.575 | 4.592 |
| 5.576 | 4.595 |
| 5.577 | 4.599 |
| 5.578 | 4.603 |
| 5.579 | 4.606 |
| 5.58 | 4.61 |
| 5.581 | 4.614 |
| 5.582 | 4.617 |
| 5.583 | 4.621 |
| 5.584 | 4.624 |
| 5.585 | 4.628 |
| 5.586 | 4.632 |
| 5.587 | 4.635 |
| 5.588 | 4.639 |
| 5.589 | 4.643 |
| 5.59 | 4.646 |
| 5.591 | 4.65 |
| 5.592 | 4.654 |
| 5.593 | 4.657 |
| 5.594 | 4.661 |
| 5.595 | 4.664 |
| 5.596 | 4.668 |
| 5.597 | 4.672 |
| 5.598 | 4.675 |
| 5.599 | 4.679 |
| 5.6 | 4.683 |
| 5.601 | 4.686 |
| 5.602 | 4.69 |
| 5.603 | 4.694 |
| 5.604 | 4.697 |
| 5.605 | 4.701 |
| 5.606 | 4.704 |
| 5.607 | 4.708 |
| 5.608 | 4.712 |
| 5.609 | 4.716 |
| 5.61 | 4.719 |
| 5.611 | 4.723 |
| 5.612 | 4.726 |
| 5.613 | 4.73 |
| 5.614 | 4.734 |
| 5.615 | 4.737 |
| 5.616 | 4.741 |
| 5.617 | 4.745 |
| 5.618 | 4.748 |
| 5.619 | 4.752 |
| 5.62 | 4.756 |
| 5.621 | 4.759 |
| 5.622 | 4.763 |
| 5.623 | 4.767 |
| 5.624 | 4.77 |
| 5.625 | 4.774 |
| 5.626 | 4.778 |
| 5.627 | 4.781 |
| 5.628 | 4.785 |
| 5.629 | 4.789 |
| 5.63 | 4.792 |
| 5.631 | 4.796 |
| 5.632 | 4.8 |
| 5.633 | 4.804 |
| 5.634 | 4.807 |
| 5.635 | 4.811 |
| 5.636 | 4.815 |
| 5.637 | 4.818 |
| 5.638 | 4.822 |
| 5.639 | 4.826 |
| 5.64 | 4.829 |
| 5.641 | 4.833 |
| 5.642 | 4.837 |
| 5.643 | 4.84 |
| 5.644 | 4.844 |
| 5.645 | 4.848 |
| 5.646 | 4.851 |
| 5.647 | 4.855 |
| 5.648 | 4.859 |
| 5.649 | 4.862 |
| 5.65 | 4.866 |
| 5.651 | 4.87 |
| 5.652 | 4.874 |
| 5.653 | 4.877 |
| 5.654 | 4.881 |
| 5.655 | 4.885 |
| 5.656 | 4.888 |
| 5.657 | 4.892 |
| 5.658 | 4.896 |
| 5.659 | 4.9 |
| 5.66 | 4.903 |
| 5.661 | 4.907 |
| 5.662 | 4.911 |
| 5.663 | 4.914 |
| 5.664 | 4.918 |
| 5.665 | 4.922 |
| 5.666 | 4.926 |
| 5.667 | 4.929 |
| 5.668 | 4.933 |
| 5.669 | 4.937 |
| 5.67 | 4.94 |
| 5.671 | 4.944 |
| 5.672 | 4.948 |
| 5.673 | 4.952 |
| 5.674 | 4.955 |
| 5.675 | 4.959 |
| 5.676 | 4.963 |
| 5.677 | 4.966 |
| 5.678 | 4.97 |
| 5.679 | 4.974 |
| 5.68 | 4.978 |
| 5.681 | 4.981 |
| 5.682 | 4.985 |
| 5.683 | 4.989 |
| 5.684 | 4.992 |
| 5.685 | 4.996 |
| 5.686 | 5 |
| 5.687 | 5.004 |
| 5.688 | 5.007 |
| 5.689 | 5.011 |
| 5.69 | 5.015 |
| 5.691 | 5.019 |
| 5.692 | 5.022 |
| 5.693 | 5.026 |
| 5.694 | 5.03 |
| 5.695 | 5.034 |
| 5.696 | 5.037 |
| 5.697 | 5.041 |
| 5.698 | 5.045 |
| 5.699 | 5.049 |
| 5.7 | 5.052 |
| 5.701 | 5.056 |
| 5.702 | 5.06 |
| 5.703 | 5.064 |
| 5.704 | 5.067 |
| 5.705 | 5.071 |
| 5.706 | 5.075 |
| 5.707 | 5.079 |
| 5.708 | 5.082 |
| 5.709 | 5.086 |
| 5.71 | 5.09 |
| 5.711 | 5.094 |
| 5.712 | 5.097 |
| 5.713 | 5.101 |
| 5.714 | 5.105 |
| 5.715 | 5.109 |
| 5.716 | 5.112 |
| 5.717 | 5.116 |
| 5.718 | 5.12 |
| 5.719 | 5.124 |
| 5.72 | 5.128 |
| 5.721 | 5.131 |
| 5.722 | 5.135 |
| 5.723 | 5.139 |
| 5.724 | 5.143 |
| 5.725 | 5.146 |
| 5.726 | 5.15 |
| 5.727 | 5.154 |
| 5.728 | 5.158 |
| 5.729 | 5.162 |
| 5.73 | 5.165 |
| 5.731 | 5.169 |
| 5.732 | 5.173 |
| 5.733 | 5.177 |
| 5.734 | 5.18 |
| 5.735 | 5.184 |
| 5.736 | 5.188 |
| 5.737 | 5.192 |
| 5.738 | 5.196 |
| 5.739 | 5.199 |
| 5.74 | 5.203 |
| 5.741 | 5.207 |
| 5.742 | 5.211 |
| 5.743 | 5.214 |
| 5.744 | 5.218 |
| 5.745 | 5.222 |
| 5.746 | 5.226 |
| 5.747 | 5.23 |
| 5.748 | 5.233 |
| 5.749 | 5.237 |
| 5.75 | 5.241 |
| 5.751 | 5.245 |
| 5.752 | 5.249 |
| 5.753 | 5.252 |
| 5.754 | 5.256 |
| 5.755 | 5.26 |
| 5.756 | 5.264 |
| 5.757 | 5.268 |
| 5.758 | 5.272 |
| 5.759 | 5.275 |
| 5.76 | 5.279 |
| 5.761 | 5.283 |
| 5.762 | 5.287 |
| 5.763 | 5.29 |
| 5.764 | 5.294 |
| 5.765 | 5.298 |
| 5.766 | 5.302 |
| 5.767 | 5.306 |
| 5.768 | 5.31 |
| 5.769 | 5.313 |
| 5.77 | 5.317 |
| 5.771 | 5.321 |
| 5.772 | 5.325 |
| 5.773 | 5.329 |
| 5.774 | 5.333 |
| 5.775 | 5.336 |
| 5.776 | 5.34 |
| 5.777 | 5.344 |
| 5.778 | 5.348 |
| 5.779 | 5.352 |
| 5.78 | 5.356 |
| 5.781 | 5.359 |
| 5.782 | 5.363 |
| 5.783 | 5.367 |
| 5.784 | 5.371 |
| 5.785 | 5.375 |
| 5.786 | 5.378 |
| 5.787 | 5.382 |
| 5.788 | 5.386 |
| 5.789 | 5.39 |
| 5.79 | 5.394 |
| 5.791 | 5.398 |
| 5.792 | 5.402 |
| 5.793 | 5.405 |
| 5.794 | 5.409 |
| 5.795 | 5.413 |
| 5.796 | 5.417 |
| 5.797 | 5.421 |
| 5.798 | 5.425 |
| 5.799 | 5.428 |
| 5.8 | 5.432 |
| 5.801 | 5.436 |
| 5.802 | 5.44 |
| 5.803 | 5.444 |
| 5.804 | 5.448 |
| 5.805 | 5.452 |
| 5.806 | 5.456 |
| 5.807 | 5.459 |
| 5.808 | 5.463 |
| 5.809 | 5.467 |
| 5.81 | 5.471 |
| 5.811 | 5.475 |
| 5.812 | 5.479 |
| 5.813 | 5.482 |
| 5.814 | 5.486 |
| 5.815 | 5.49 |
| 5.816 | 5.494 |
| 5.817 | 5.498 |
| 5.818 | 5.502 |
| 5.819 | 5.506 |
| 5.82 | 5.51 |
| 5.821 | 5.514 |
| 5.822 | 5.517 |
| 5.823 | 5.521 |
| 5.824 | 5.525 |
| 5.825 | 5.529 |
| 5.826 | 5.533 |
| 5.827 | 5.537 |
| 5.828 | 5.541 |
| 5.829 | 5.544 |
| 5.83 | 5.548 |
| 5.831 | 5.552 |
| 5.832 | 5.556 |
| 5.833 | 5.56 |
| 5.834 | 5.564 |
| 5.835 | 5.568 |
| 5.836 | 5.572 |
| 5.837 | 5.576 |
| 5.838 | 5.58 |
| 5.839 | 5.583 |
| 5.84 | 5.587 |
| 5.841 | 5.591 |
| 5.842 | 5.595 |
| 5.843 | 5.599 |
| 5.844 | 5.603 |
| 5.845 | 5.607 |
| 5.846 | 5.611 |
| 5.847 | 5.615 |
| 5.848 | 5.618 |
| 5.849 | 5.622 |
| 5.85 | 5.626 |
| 5.851 | 5.63 |
| 5.852 | 5.634 |
| 5.853 | 5.638 |
| 5.854 | 5.642 |
| 5.855 | 5.646 |
| 5.856 | 5.65 |
| 5.857 | 5.654 |
| 5.858 | 5.658 |
| 5.859 | 5.662 |
| 5.86 | 5.665 |
| 5.861 | 5.669 |
| 5.862 | 5.673 |
| 5.863 | 5.677 |
| 5.864 | 5.681 |
| 5.865 | 5.685 |
| 5.866 | 5.689 |
| 5.867 | 5.693 |
| 5.868 | 5.697 |
| 5.869 | 5.701 |
| 5.87 | 5.705 |
| 5.871 | 5.709 |
| 5.872 | 5.712 |
| 5.873 | 5.716 |
| 5.874 | 5.72 |
| 5.875 | 5.724 |
| 5.876 | 5.728 |
| 5.877 | 5.732 |
| 5.878 | 5.736 |
| 5.879 | 5.74 |
| 5.88 | 5.744 |
| 5.881 | 5.748 |
| 5.882 | 5.752 |
| 5.883 | 5.756 |
| 5.884 | 5.76 |
| 5.885 | 5.764 |
| 5.886 | 5.768 |
| 5.887 | 5.772 |
| 5.888 | 5.776 |
| 5.889 | 5.78 |
| 5.89 | 5.783 |
| 5.891 | 5.787 |
| 5.892 | 5.791 |
| 5.893 | 5.795 |
| 5.894 | 5.799 |
| 5.895 | 5.803 |
| 5.896 | 5.807 |
| 5.897 | 5.811 |
| 5.898 | 5.815 |
| 5.899 | 5.819 |
| 5.9 | 5.823 |
| 5.901 | 5.827 |
| 5.902 | 5.831 |
| 5.903 | 5.835 |
| 5.904 | 5.839 |
| 5.905 | 5.843 |
| 5.906 | 5.847 |
| 5.907 | 5.851 |
| 5.908 | 5.855 |
| 5.909 | 5.859 |
| 5.91 | 5.863 |
| 5.911 | 5.867 |
| 5.912 | 5.871 |
| 5.913 | 5.874 |
| 5.914 | 5.878 |
| 5.915 | 5.882 |
| 5.916 | 5.886 |
| 5.917 | 5.89 |
| 5.918 | 5.894 |
| 5.919 | 5.898 |
| 5.92 | 5.902 |
| 5.921 | 5.906 |
| 5.922 | 5.91 |
| 5.923 | 5.914 |
| 5.924 | 5.918 |
| 5.925 | 5.922 |
| 5.926 | 5.926 |
| 5.927 | 5.93 |
| 5.928 | 5.934 |
| 5.929 | 5.938 |
| 5.93 | 5.942 |
| 5.931 | 5.946 |
| 5.932 | 5.95 |
| 5.933 | 5.954 |
| 5.934 | 5.958 |
| 5.935 | 5.962 |
| 5.936 | 5.966 |
| 5.937 | 5.97 |
| 5.938 | 5.974 |
| 5.939 | 5.978 |
| 5.94 | 5.982 |
| 5.941 | 5.986 |
| 5.942 | 5.99 |
| 5.943 | 5.994 |
| 5.944 | 5.998 |
| 5.945 | 6.002 |
| 5.946 | 6.006 |
| 5.947 | 6.01 |
| 5.948 | 6.014 |
| 5.949 | 6.018 |
| 5.95 | 6.022 |
| 5.951 | 6.026 |
| 5.952 | 6.03 |
| 5.953 | 6.034 |
| 5.954 | 6.038 |
| 5.955 | 6.042 |
| 5.956 | 6.046 |
| 5.957 | 6.05 |
| 5.958 | 6.054 |
| 5.959 | 6.058 |
| 5.96 | 6.062 |
| 5.961 | 6.066 |
| 5.962 | 6.071 |
| 5.963 | 6.075 |
| 5.964 | 6.079 |
| 5.965 | 6.083 |
| 5.966 | 6.087 |
| 5.967 | 6.091 |
| 5.968 | 6.095 |
| 5.969 | 6.099 |
| 5.97 | 6.103 |
| 5.971 | 6.107 |
| 5.972 | 6.111 |
| 5.973 | 6.115 |
| 5.974 | 6.119 |
| 5.975 | 6.123 |
| 5.976 | 6.127 |
| 5.977 | 6.131 |
| 5.978 | 6.135 |
| 5.979 | 6.139 |
| 5.98 | 6.143 |
| 5.981 | 6.147 |
| 5.982 | 6.151 |
| 5.983 | 6.155 |
| 5.984 | 6.159 |
| 5.985 | 6.164 |
| 5.986 | 6.168 |
| 5.987 | 6.172 |
| 5.988 | 6.176 |
| 5.989 | 6.18 |
| 5.99 | 6.184 |
| 5.991 | 6.188 |
| 5.992 | 6.192 |
| 5.993 | 6.196 |
| 5.994 | 6.2 |
| 5.995 | 6.204 |
| 5.996 | 6.208 |
| 5.997 | 6.212 |
| 5.998 | 6.216 |
| 5.999 | 6.22 |
| 6.0 | 6.224 |
| 6.001 | 6.228 |
| 6.002 | 6.233 |
| 6.003 | 6.237 |
| 6.004 | 6.241 |
| 6.005 | 6.245 |
| 6.006 | 6.249 |
| 6.007 | 6.253 |
| 6.008 | 6.257 |
| 6.009 | 6.261 |
| 6.01 | 6.265 |
| 6.011 | 6.269 |
| 6.012 | 6.273 |
| 6.013 | 6.277 |
| 6.014 | 6.282 |
| 6.015 | 6.286 |
| 6.016 | 6.29 |
| 6.017 | 6.294 |
| 6.018 | 6.298 |
| 6.019 | 6.302 |
| 6.02 | 6.306 |
| 6.021 | 6.31 |
| 6.022 | 6.314 |
| 6.023 | 6.318 |
| 6.024 | 6.322 |
| 6.025 | 6.326 |
| 6.026 | 6.331 |
| 6.027 | 6.335 |
| 6.028 | 6.339 |
| 6.029 | 6.343 |
| 6.03 | 6.347 |
| 6.031 | 6.351 |
| 6.032 | 6.355 |
| 6.033 | 6.359 |
| 6.034 | 6.363 |
| 6.035 | 6.368 |
| 6.036 | 6.372 |
| 6.037 | 6.376 |
| 6.038 | 6.38 |
| 6.039 | 6.384 |
| 6.04 | 6.388 |
| 6.041 | 6.392 |
| 6.042 | 6.396 |
| 6.043 | 6.4 |
| 6.044 | 6.405 |
| 6.045 | 6.409 |
| 6.046 | 6.413 |
| 6.047 | 6.417 |
| 6.048 | 6.421 |
| 6.049 | 6.425 |
| 6.05 | 6.429 |
| 6.051 | 6.433 |
| 6.052 | 6.438 |
| 6.053 | 6.442 |
| 6.054 | 6.446 |
| 6.055 | 6.45 |
| 6.056 | 6.454 |
| 6.057 | 6.458 |
| 6.058 | 6.462 |
| 6.059 | 6.466 |
| 6.06 | 6.471 |
| 6.061 | 6.475 |
| 6.062 | 6.479 |
| 6.063 | 6.483 |
| 6.064 | 6.487 |
| 6.065 | 6.491 |
| 6.066 | 6.496 |
| 6.067 | 6.5 |
| 6.068 | 6.504 |
| 6.069 | 6.508 |
| 6.07 | 6.512 |
| 6.071 | 6.516 |
| 6.072 | 6.52 |
| 6.073 | 6.524 |
| 6.074 | 6.529 |
| 6.075 | 6.533 |
| 6.076 | 6.537 |
| 6.077 | 6.541 |
| 6.078 | 6.545 |
| 6.079 | 6.549 |
| 6.08 | 6.554 |
| 6.081 | 6.558 |
| 6.082 | 6.562 |
| 6.083 | 6.566 |
| 6.084 | 6.57 |
| 6.085 | 6.574 |
| 6.086 | 6.579 |
| 6.087 | 6.583 |
| 6.088 | 6.587 |
| 6.089 | 6.591 |
| 6.09 | 6.595 |
| 6.091 | 6.599 |
| 6.092 | 6.604 |
| 6.093 | 6.608 |
| 6.094 | 6.612 |
| 6.095 | 6.616 |
| 6.096 | 6.62 |
| 6.097 | 6.624 |
| 6.098 | 6.629 |
| 6.099 | 6.633 |
| 6.1 | 6.637 |
| 6.101 | 6.641 |
| 6.102 | 6.645 |
| 6.103 | 6.65 |
| 6.104 | 6.654 |
| 6.105 | 6.658 |
| 6.106 | 6.662 |
| 6.107 | 6.666 |
| 6.108 | 6.67 |
| 6.109 | 6.675 |
| 6.11 | 6.679 |
| 6.111 | 6.683 |
| 6.112 | 6.687 |
| 6.113 | 6.692 |
| 6.114 | 6.696 |
| 6.115 | 6.7 |
| 6.116 | 6.704 |
| 6.117 | 6.708 |
| 6.118 | 6.712 |
| 6.119 | 6.717 |
| 6.12 | 6.721 |
| 6.121 | 6.725 |
| 6.122 | 6.729 |
| 6.123 | 6.734 |
| 6.124 | 6.738 |
| 6.125 | 6.742 |
| 6.126 | 6.746 |
| 6.127 | 6.75 |
| 6.128 | 6.755 |
| 6.129 | 6.759 |
| 6.13 | 6.763 |
| 6.131 | 6.767 |
| 6.132 | 6.771 |
| 6.133 | 6.776 |
| 6.134 | 6.78 |
| 6.135 | 6.784 |
| 6.136 | 6.788 |
| 6.137 | 6.792 |
| 6.138 | 6.797 |
| 6.139 | 6.801 |
| 6.14 | 6.805 |
| 6.141 | 6.809 |
| 6.142 | 6.814 |
| 6.143 | 6.818 |
| 6.144 | 6.822 |
| 6.145 | 6.826 |
| 6.146 | 6.831 |
| 6.147 | 6.835 |
| 6.148 | 6.839 |
| 6.149 | 6.843 |
| 6.15 | 6.848 |
| 6.151 | 6.852 |
| 6.152 | 6.856 |
| 6.153 | 6.86 |
| 6.154 | 6.864 |
| 6.155 | 6.869 |
| 6.156 | 6.873 |
| 6.157 | 6.877 |
| 6.158 | 6.882 |
| 6.159 | 6.886 |
| 6.16 | 6.89 |
| 6.161 | 6.894 |
| 6.162 | 6.898 |
| 6.163 | 6.903 |
| 6.164 | 6.907 |
| 6.165 | 6.911 |
| 6.166 | 6.916 |
| 6.167 | 6.92 |
| 6.168 | 6.924 |
| 6.169 | 6.928 |
| 6.17 | 6.933 |
| 6.171 | 6.937 |
| 6.172 | 6.941 |
| 6.173 | 6.945 |
| 6.174 | 6.95 |
| 6.175 | 6.954 |
| 6.176 | 6.958 |
| 6.177 | 6.962 |
| 6.178 | 6.967 |
| 6.179 | 6.971 |
| 6.18 | 6.975 |
| 6.181 | 6.98 |
| 6.182 | 6.984 |
| 6.183 | 6.988 |
| 6.184 | 6.992 |
| 6.185 | 6.997 |
| 6.186 | 7.001 |
| 6.187 | 7.005 |
| 6.188 | 7.01 |
| 6.189 | 7.014 |
| 6.19 | 7.018 |
| 6.191 | 7.022 |
| 6.192 | 7.027 |
| 6.193 | 7.031 |
| 6.194 | 7.035 |
| 6.195 | 7.04 |
| 6.196 | 7.044 |
| 6.197 | 7.048 |
| 6.198 | 7.052 |
| 6.199 | 7.057 |
| 6.2 | 7.061 |
| 6.201 | 7.065 |
| 6.202 | 7.07 |
| 6.203 | 7.074 |
| 6.204 | 7.078 |
| 6.205 | 7.082 |
| 6.206 | 7.087 |
| 6.207 | 7.091 |
| 6.208 | 7.095 |
| 6.209 | 7.1 |
| 6.21 | 7.104 |
| 6.211 | 7.108 |
| 6.212 | 7.113 |
| 6.213 | 7.117 |
| 6.214 | 7.121 |
| 6.215 | 7.126 |
| 6.216 | 7.13 |
| 6.217 | 7.134 |
| 6.218 | 7.139 |
| 6.219 | 7.143 |
| 6.22 | 7.147 |
| 6.221 | 7.152 |
| 6.222 | 7.156 |
| 6.223 | 7.16 |
| 6.224 | 7.164 |
| 6.225 | 7.169 |
| 6.226 | 7.173 |
| 6.227 | 7.178 |
| 6.228 | 7.182 |
| 6.229 | 7.186 |
| 6.23 | 7.19 |
| 6.231 | 7.195 |
| 6.232 | 7.199 |
| 6.233 | 7.204 |
| 6.234 | 7.208 |
| 6.235 | 7.212 |
| 6.236 | 7.216 |
| 6.237 | 7.221 |
| 6.238 | 7.225 |
| 6.239 | 7.23 |
| 6.24 | 7.234 |
| 6.241 | 7.238 |
| 6.242 | 7.243 |
| 6.243 | 7.247 |
| 6.244 | 7.251 |
| 6.245 | 7.256 |
| 6.246 | 7.26 |
| 6.247 | 7.264 |
| 6.248 | 7.269 |
| 6.249 | 7.273 |
| 6.25 | 7.277 |
| 6.251 | 7.282 |
| 6.252 | 7.286 |
| 6.253 | 7.29 |
| 6.254 | 7.295 |
| 6.255 | 7.299 |
| 6.256 | 7.304 |
| 6.257 | 7.308 |
| 6.258 | 7.312 |
| 6.259 | 7.317 |
| 6.26 | 7.321 |
| 6.261 | 7.325 |
| 6.262 | 7.33 |
| 6.263 | 7.334 |
| 6.264 | 7.338 |
| 6.265 | 7.343 |
| 6.266 | 7.347 |
| 6.267 | 7.352 |
| 6.268 | 7.356 |
| 6.269 | 7.36 |
| 6.27 | 7.365 |
| 6.271 | 7.369 |
| 6.272 | 7.374 |
| 6.273 | 7.378 |
| 6.274 | 7.382 |
| 6.275 | 7.387 |
| 6.276 | 7.391 |
| 6.277 | 7.396 |
| 6.278 | 7.4 |
| 6.279 | 7.404 |
| 6.28 | 7.409 |
| 6.281 | 7.413 |
| 6.282 | 7.418 |
| 6.283 | 7.422 |
| 6.284 | 7.426 |
| 6.285 | 7.431 |
| 6.286 | 7.435 |
| 6.287 | 7.44 |
| 6.288 | 7.444 |
| 6.289 | 7.448 |
| 6.29 | 7.453 |
| 6.291 | 7.457 |
| 6.292 | 7.462 |
| 6.293 | 7.466 |
| 6.294 | 7.47 |
| 6.295 | 7.475 |
| 6.296 | 7.479 |
| 6.297 | 7.484 |
| 6.298 | 7.488 |
| 6.299 | 7.492 |
| 6.3 | 7.497 |
| 6.301 | 7.501 |
| 6.302 | 7.506 |
| 6.303 | 7.51 |
| 6.304 | 7.514 |
| 6.305 | 7.519 |
| 6.306 | 7.523 |
| 6.307 | 7.528 |
| 6.308 | 7.532 |
| 6.309 | 7.537 |
| 6.31 | 7.541 |
| 6.311 | 7.545 |
| 6.312 | 7.55 |
| 6.313 | 7.554 |
| 6.314 | 7.559 |
| 6.315 | 7.563 |
| 6.316 | 7.568 |
| 6.317 | 7.572 |
| 6.318 | 7.576 |
| 6.319 | 7.581 |
| 6.32 | 7.585 |
| 6.321 | 7.59 |
| 6.322 | 7.594 |
| 6.323 | 7.599 |
| 6.324 | 7.603 |
| 6.325 | 7.608 |
| 6.326 | 7.612 |
| 6.327 | 7.616 |
| 6.328 | 7.621 |
| 6.329 | 7.625 |
| 6.33 | 7.63 |
| 6.331 | 7.634 |
| 6.332 | 7.639 |
| 6.333 | 7.643 |
| 6.334 | 7.648 |
| 6.335 | 7.652 |
| 6.336 | 7.657 |
| 6.337 | 7.661 |
| 6.338 | 7.666 |
| 6.339 | 7.67 |
| 6.34 | 7.674 |
| 6.341 | 7.679 |
| 6.342 | 7.683 |
| 6.343 | 7.688 |
| 6.344 | 7.692 |
| 6.345 | 7.697 |
| 6.346 | 7.701 |
| 6.347 | 7.706 |
| 6.348 | 7.71 |
| 6.349 | 7.715 |
| 6.35 | 7.719 |
| 6.351 | 7.724 |
| 6.352 | 7.728 |
| 6.353 | 7.733 |
| 6.354 | 7.737 |
| 6.355 | 7.742 |
| 6.356 | 7.746 |
| 6.357 | 7.75 |
| 6.358 | 7.755 |
| 6.359 | 7.76 |
| 6.36 | 7.764 |
| 6.361 | 7.768 |
| 6.362 | 7.773 |
| 6.363 | 7.778 |
| 6.364 | 7.782 |
| 6.365 | 7.786 |
| 6.366 | 7.791 |
| 6.367 | 7.796 |
| 6.368 | 7.8 |
| 6.369 | 7.804 |
| 6.37 | 7.809 |
| 6.371 | 7.814 |
| 6.372 | 7.818 |
| 6.373 | 7.822 |
| 6.374 | 7.827 |
| 6.375 | 7.832 |
| 6.376 | 7.836 |
| 6.377 | 7.84 |
| 6.378 | 7.845 |
| 6.379 | 7.85 |
| 6.38 | 7.854 |
| 6.381 | 7.859 |
| 6.382 | 7.863 |
| 6.383 | 7.868 |
| 6.384 | 7.872 |
| 6.385 | 7.877 |
| 6.386 | 7.881 |
| 6.387 | 7.886 |
| 6.388 | 7.89 |
| 6.389 | 7.895 |
| 6.39 | 7.899 |
| 6.391 | 7.904 |
| 6.392 | 7.908 |
| 6.393 | 7.913 |
| 6.394 | 7.917 |
| 6.395 | 7.922 |
| 6.396 | 7.926 |
| 6.397 | 7.931 |
| 6.398 | 7.936 |
| 6.399 | 7.94 |
| 6.4 | 7.945 |
| 6.401 | 7.949 |
| 6.402 | 7.954 |
| 6.403 | 7.958 |
| 6.404 | 7.963 |
| 6.405 | 7.967 |
| 6.406 | 7.972 |
| 6.407 | 7.976 |
| 6.408 | 7.981 |
| 6.409 | 7.986 |
| 6.41 | 7.99 |
| 6.411 | 7.995 |
| 6.412 | 7.999 |
| 6.413 | 8.004 |
| 6.414 | 8.008 |
| 6.415 | 8.013 |
| 6.416 | 8.017 |
| 6.417 | 8.022 |
| 6.418 | 8.026 |
| 6.419 | 8.031 |
| 6.42 | 8.036 |
| 6.421 | 8.04 |
| 6.422 | 8.045 |
| 6.423 | 8.049 |
| 6.424 | 8.054 |
| 6.425 | 8.058 |
| 6.426 | 8.063 |
| 6.427 | 8.068 |
| 6.428 | 8.072 |
| 6.429 | 8.077 |
| 6.43 | 8.081 |
| 6.431 | 8.086 |
| 6.432 | 8.091 |
| 6.433 | 8.095 |
| 6.434 | 8.1 |
| 6.435 | 8.104 |
| 6.436 | 8.109 |
| 6.437 | 8.113 |
| 6.438 | 8.118 |
| 6.439 | 8.123 |
| 6.44 | 8.127 |
| 6.441 | 8.132 |
| 6.442 | 8.136 |
| 6.443 | 8.141 |
| 6.444 | 8.146 |
| 6.445 | 8.15 |
| 6.446 | 8.155 |
| 6.447 | 8.159 |
| 6.448 | 8.164 |
| 6.449 | 8.169 |
| 6.45 | 8.173 |
| 6.451 | 8.178 |
| 6.452 | 8.182 |
| 6.453 | 8.187 |
| 6.454 | 8.192 |
| 6.455 | 8.196 |
| 6.456 | 8.201 |
| 6.457 | 8.205 |
| 6.458 | 8.21 |
| 6.459 | 8.215 |
| 6.46 | 8.219 |
| 6.461 | 8.224 |
| 6.462 | 8.228 |
| 6.463 | 8.233 |
| 6.464 | 8.238 |
| 6.465 | 8.242 |
| 6.466 | 8.247 |
| 6.467 | 8.252 |
| 6.468 | 8.256 |
| 6.469 | 8.261 |
| 6.47 | 8.266 |
| 6.471 | 8.27 |
| 6.472 | 8.275 |
| 6.473 | 8.279 |
| 6.474 | 8.284 |
| 6.475 | 8.289 |
| 6.476 | 8.293 |
| 6.477 | 8.298 |
| 6.478 | 8.302 |
| 6.479 | 8.307 |
| 6.48 | 8.312 |
| 6.481 | 8.316 |
| 6.482 | 8.321 |
| 6.483 | 8.326 |
| 6.484 | 8.33 |
| 6.485 | 8.335 |
| 6.486 | 8.34 |
| 6.487 | 8.344 |
| 6.488 | 8.349 |
| 6.489 | 8.354 |
| 6.49 | 8.358 |
| 6.491 | 8.363 |
| 6.492 | 8.368 |
| 6.493 | 8.372 |
| 6.494 | 8.377 |
| 6.495 | 8.382 |
| 6.496 | 8.386 |
| 6.497 | 8.391 |
| 6.498 | 8.396 |
| 6.499 | 8.4 |
| 6.5 | 8.405 |
| 6.501 | 8.41 |
| 6.502 | 8.414 |
| 6.503 | 8.419 |
| 6.504 | 8.424 |
| 6.505 | 8.428 |
| 6.506 | 8.433 |
| 6.507 | 8.438 |
| 6.508 | 8.442 |
| 6.509 | 8.447 |
| 6.51 | 8.452 |
| 6.511 | 8.456 |
| 6.512 | 8.461 |
| 6.513 | 8.466 |
| 6.514 | 8.47 |
| 6.515 | 8.475 |
| 6.516 | 8.48 |
| 6.517 | 8.484 |
| 6.518 | 8.489 |
| 6.519 | 8.494 |
| 6.52 | 8.498 |
| 6.521 | 8.503 |
| 6.522 | 8.508 |
| 6.523 | 8.512 |
| 6.524 | 8.517 |
| 6.525 | 8.522 |
| 6.526 | 8.527 |
| 6.527 | 8.531 |
| 6.528 | 8.536 |
| 6.529 | 8.541 |
| 6.53 | 8.545 |
| 6.531 | 8.55 |
| 6.532 | 8.555 |
| 6.533 | 8.56 |
| 6.534 | 8.564 |
| 6.535 | 8.569 |
| 6.536 | 8.574 |
| 6.537 | 8.578 |
| 6.538 | 8.583 |
| 6.539 | 8.588 |
| 6.54 | 8.592 |
| 6.541 | 8.597 |
| 6.542 | 8.602 |
| 6.543 | 8.607 |
| 6.544 | 8.611 |
| 6.545 | 8.616 |
| 6.546 | 8.621 |
| 6.547 | 8.626 |
| 6.548 | 8.63 |
| 6.549 | 8.635 |
| 6.55 | 8.64 |
| 6.551 | 8.644 |
| 6.552 | 8.649 |
| 6.553 | 8.654 |
| 6.554 | 8.659 |
| 6.555 | 8.663 |
| 6.556 | 8.668 |
| 6.557 | 8.673 |
| 6.558 | 8.678 |
| 6.559 | 8.682 |
| 6.56 | 8.687 |
| 6.561 | 8.692 |
| 6.562 | 8.697 |
| 6.563 | 8.701 |
| 6.564 | 8.706 |
| 6.565 | 8.711 |
| 6.566 | 8.716 |
| 6.567 | 8.72 |
| 6.568 | 8.725 |
| 6.569 | 8.73 |
| 6.57 | 8.735 |
| 6.571 | 8.739 |
| 6.572 | 8.744 |
| 6.573 | 8.749 |
| 6.574 | 8.754 |
| 6.575 | 8.758 |
| 6.576 | 8.763 |
| 6.577 | 8.768 |
| 6.578 | 8.773 |
| 6.579 | 8.778 |
| 6.58 | 8.782 |
| 6.581 | 8.787 |
| 6.582 | 8.792 |
| 6.583 | 8.796 |
| 6.584 | 8.801 |
| 6.585 | 8.806 |
| 6.586 | 8.811 |
| 6.587 | 8.816 |
| 6.588 | 8.82 |
| 6.589 | 8.825 |
| 6.59 | 8.83 |
| 6.591 | 8.835 |
| 6.592 | 8.84 |
| 6.593 | 8.844 |
| 6.594 | 8.849 |
| 6.595 | 8.854 |
| 6.596 | 8.859 |
| 6.597 | 8.864 |
| 6.598 | 8.868 |
| 6.599 | 8.873 |
| 6.6 | 8.878 |
| 6.601 | 8.883 |
| 6.602 | 8.888 |
| 6.603 | 8.892 |
| 6.604 | 8.897 |
| 6.605 | 8.902 |
| 6.606 | 8.907 |
| 6.607 | 8.912 |
| 6.608 | 8.916 |
| 6.609 | 8.921 |
| 6.61 | 8.926 |
| 6.611 | 8.931 |
| 6.612 | 8.936 |
| 6.613 | 8.94 |
| 6.614 | 8.945 |
| 6.615 | 8.95 |
| 6.616 | 8.955 |
| 6.617 | 8.96 |
| 6.618 | 8.964 |
| 6.619 | 8.969 |
| 6.62 | 8.974 |
| 6.621 | 8.979 |
| 6.622 | 8.984 |
| 6.623 | 8.988 |
| 6.624 | 8.993 |
| 6.625 | 8.998 |
| 6.626 | 9.003 |
| 6.627 | 9.008 |
| 6.628 | 9.013 |
| 6.629 | 9.018 |
| 6.63 | 9.022 |
| 6.631 | 9.027 |
| 6.632 | 9.032 |
| 6.633 | 9.037 |
| 6.634 | 9.042 |
| 6.635 | 9.046 |
| 6.636 | 9.051 |
| 6.637 | 9.056 |
| 6.638 | 9.061 |
| 6.639 | 9.066 |
| 6.64 | 9.071 |
| 6.641 | 9.076 |
| 6.642 | 9.08 |
| 6.643 | 9.085 |
| 6.644 | 9.09 |
| 6.645 | 9.095 |
| 6.646 | 9.1 |
| 6.647 | 9.105 |
| 6.648 | 9.11 |
| 6.649 | 9.114 |
| 6.65 | 9.119 |
| 6.651 | 9.124 |
| 6.652 | 9.129 |
| 6.653 | 9.134 |
| 6.654 | 9.139 |
| 6.655 | 9.144 |
| 6.656 | 9.148 |
| 6.657 | 9.153 |
| 6.658 | 9.158 |
| 6.659 | 9.163 |
| 6.66 | 9.168 |
| 6.661 | 9.173 |
| 6.662 | 9.178 |
| 6.663 | 9.183 |
| 6.664 | 9.188 |
| 6.665 | 9.192 |
| 6.666 | 9.197 |
| 6.667 | 9.202 |
| 6.668 | 9.207 |
| 6.669 | 9.212 |
| 6.67 | 9.217 |
| 6.671 | 9.222 |
| 6.672 | 9.226 |
| 6.673 | 9.231 |
| 6.674 | 9.236 |
| 6.675 | 9.241 |
| 6.676 | 9.246 |
| 6.677 | 9.251 |
| 6.678 | 9.256 |
| 6.679 | 9.261 |
| 6.68 | 9.266 |
| 6.681 | 9.271 |
| 6.682 | 9.276 |
| 6.683 | 9.28 |
| 6.684 | 9.285 |
| 6.685 | 9.29 |
| 6.686 | 9.295 |
| 6.687 | 9.3 |
| 6.688 | 9.305 |
| 6.689 | 9.31 |
| 6.69 | 9.315 |
| 6.691 | 9.32 |
| 6.692 | 9.325 |
| 6.693 | 9.33 |
| 6.694 | 9.334 |
| 6.695 | 9.339 |
| 6.696 | 9.344 |
| 6.697 | 9.349 |
| 6.698 | 9.354 |
| 6.699 | 9.359 |
| 6.7 | 9.364 |
| 6.701 | 9.369 |
| 6.702 | 9.374 |
| 6.703 | 9.379 |
| 6.704 | 9.384 |
| 6.705 | 9.389 |
| 6.706 | 9.394 |
| 6.707 | 9.398 |
| 6.708 | 9.404 |
| 6.709 | 9.408 |
| 6.71 | 9.413 |
| 6.711 | 9.418 |
| 6.712 | 9.423 |
| 6.713 | 9.428 |
| 6.714 | 9.433 |
| 6.715 | 9.438 |
| 6.716 | 9.443 |
| 6.717 | 9.448 |
| 6.718 | 9.453 |
| 6.719 | 9.458 |
| 6.72 | 9.463 |
| 6.721 | 9.468 |
| 6.722 | 9.473 |
| 6.723 | 9.478 |
| 6.724 | 9.483 |
| 6.725 | 9.488 |
| 6.726 | 9.493 |
| 6.727 | 9.498 |
| 6.728 | 9.502 |
| 6.729 | 9.508 |
| 6.73 | 9.512 |
| 6.731 | 9.517 |
| 6.732 | 9.522 |
| 6.733 | 9.527 |
| 6.734 | 9.532 |
| 6.735 | 9.537 |
| 6.736 | 9.542 |
| 6.737 | 9.547 |
| 6.738 | 9.552 |
| 6.739 | 9.557 |
| 6.74 | 9.562 |
| 6.741 | 9.567 |
| 6.742 | 9.572 |
| 6.743 | 9.577 |
| 6.744 | 9.582 |
| 6.745 | 9.587 |
| 6.746 | 9.592 |
| 6.747 | 9.597 |
| 6.748 | 9.602 |
| 6.749 | 9.607 |
| 6.75 | 9.612 |
| 6.751 | 9.617 |
| 6.752 | 9.622 |
| 6.753 | 9.627 |
| 6.754 | 9.632 |
| 6.755 | 9.637 |
| 6.756 | 9.642 |
| 6.757 | 9.647 |
| 6.758 | 9.652 |
| 6.759 | 9.657 |
| 6.76 | 9.662 |
| 6.761 | 9.667 |
| 6.762 | 9.672 |
| 6.763 | 9.677 |
| 6.764 | 9.682 |
| 6.765 | 9.687 |
| 6.766 | 9.692 |
| 6.767 | 9.697 |
| 6.768 | 9.702 |
| 6.769 | 9.707 |
| 6.77 | 9.712 |
| 6.771 | 9.717 |
| 6.772 | 9.722 |
| 6.773 | 9.727 |
| 6.774 | 9.732 |
| 6.775 | 9.738 |
| 6.776 | 9.742 |
| 6.777 | 9.748 |
| 6.778 | 9.753 |
| 6.779 | 9.758 |
| 6.78 | 9.763 |
| 6.781 | 9.768 |
| 6.782 | 9.773 |
| 6.783 | 9.778 |
| 6.784 | 9.783 |
| 6.785 | 9.788 |
| 6.786 | 9.793 |
| 6.787 | 9.798 |
| 6.788 | 9.803 |
| 6.789 | 9.808 |
| 6.79 | 9.813 |
| 6.791 | 9.818 |
| 6.792 | 9.823 |
| 6.793 | 9.828 |
| 6.794 | 9.833 |
| 6.795 | 9.838 |
| 6.796 | 9.843 |
| 6.797 | 9.848 |
| 6.798 | 9.854 |
| 6.799 | 9.859 |
| 6.8 | 9.864 |
| 6.801 | 9.869 |
| 6.802 | 9.874 |
| 6.803 | 9.879 |
| 6.804 | 9.884 |
| 6.805 | 9.889 |
| 6.806 | 9.894 |
| 6.807 | 9.899 |
| 6.808 | 9.904 |
| 6.809 | 9.909 |
| 6.81 | 9.914 |
| 6.811 | 9.92 |
| 6.812 | 9.925 |
| 6.813 | 9.93 |
| 6.814 | 9.935 |
| 6.815 | 9.94 |
| 6.816 | 9.945 |
| 6.817 | 9.95 |
| 6.818 | 9.955 |
| 6.819 | 9.96 |
| 6.82 | 9.965 |
| 6.821 | 9.97 |
| 6.822 | 9.975 |
| 6.823 | 9.98 |
| 6.824 | 9.986 |
| 6.825 | 9.991 |
| 6.826 | 9.996 |
| 6.827 | 10.001 |
| 6.828 | 10.006 |
| 6.829 | 10.011 |
| 6.83 | 10.016 |
| 6.831 | 10.021 |
| 6.832 | 10.026 |
| 6.833 | 10.032 |
| 6.834 | 10.037 |
| 6.835 | 10.042 |
| 6.836 | 10.047 |
| 6.837 | 10.052 |
| 6.838 | 10.057 |
| 6.839 | 10.062 |
| 6.84 | 10.067 |
| 6.841 | 10.072 |
| 6.842 | 10.078 |
| 6.843 | 10.083 |
| 6.844 | 10.088 |
| 6.845 | 10.093 |
| 6.846 | 10.098 |
| 6.847 | 10.103 |
| 6.848 | 10.108 |
| 6.849 | 10.114 |
| 6.85 | 10.119 |
| 6.851 | 10.124 |
| 6.852 | 10.129 |
| 6.853 | 10.134 |
| 6.854 | 10.139 |
| 6.855 | 10.144 |
| 6.856 | 10.15 |
| 6.857 | 10.155 |
| 6.858 | 10.16 |
| 6.859 | 10.165 |
| 6.86 | 10.17 |
| 6.861 | 10.175 |
| 6.862 | 10.18 |
| 6.863 | 10.186 |
| 6.864 | 10.191 |
| 6.865 | 10.196 |
| 6.866 | 10.201 |
| 6.867 | 10.206 |
| 6.868 | 10.211 |
| 6.869 | 10.216 |
| 6.87 | 10.222 |
| 6.871 | 10.227 |
| 6.872 | 10.232 |
| 6.873 | 10.237 |
| 6.874 | 10.242 |
| 6.875 | 10.248 |
| 6.876 | 10.253 |
| 6.877 | 10.258 |
| 6.878 | 10.263 |
| 6.879 | 10.268 |
| 6.88 | 10.273 |
| 6.881 | 10.279 |
| 6.882 | 10.284 |
| 6.883 | 10.289 |
| 6.884 | 10.294 |
| 6.885 | 10.299 |
| 6.886 | 10.304 |
| 6.887 | 10.31 |
| 6.888 | 10.315 |
| 6.889 | 10.32 |
| 6.89 | 10.325 |
| 6.891 | 10.33 |
| 6.892 | 10.336 |
| 6.893 | 10.341 |
| 6.894 | 10.346 |
| 6.895 | 10.351 |
| 6.896 | 10.356 |
| 6.897 | 10.362 |
| 6.898 | 10.367 |
| 6.899 | 10.372 |
| 6.9 | 10.377 |
| 6.901 | 10.382 |
| 6.902 | 10.388 |
| 6.903 | 10.393 |
| 6.904 | 10.398 |
| 6.905 | 10.403 |
| 6.906 | 10.408 |
| 6.907 | 10.414 |
| 6.908 | 10.419 |
| 6.909 | 10.424 |
| 6.91 | 10.429 |
| 6.911 | 10.435 |
| 6.912 | 10.44 |
| 6.913 | 10.445 |
| 6.914 | 10.45 |
| 6.915 | 10.456 |
| 6.916 | 10.461 |
| 6.917 | 10.466 |
| 6.918 | 10.471 |
| 6.919 | 10.476 |
| 6.92 | 10.482 |
| 6.921 | 10.487 |
| 6.922 | 10.492 |
| 6.923 | 10.497 |
| 6.924 | 10.503 |
| 6.925 | 10.508 |
| 6.926 | 10.513 |
| 6.927 | 10.518 |
| 6.928 | 10.524 |
| 6.929 | 10.529 |
| 6.93 | 10.534 |
| 6.931 | 10.539 |
| 6.932 | 10.545 |
| 6.933 | 10.55 |
| 6.934 | 10.555 |
| 6.935 | 10.56 |
| 6.936 | 10.566 |
| 6.937 | 10.571 |
| 6.938 | 10.576 |
| 6.939 | 10.581 |
| 6.94 | 10.587 |
| 6.941 | 10.592 |
| 6.942 | 10.597 |
| 6.943 | 10.602 |
| 6.944 | 10.608 |
| 6.945 | 10.613 |
| 6.946 | 10.618 |
| 6.947 | 10.624 |
| 6.948 | 10.629 |
| 6.949 | 10.634 |
| 6.95 | 10.639 |
| 6.951 | 10.645 |
| 6.952 | 10.65 |
| 6.953 | 10.655 |
| 6.954 | 10.66 |
| 6.955 | 10.666 |
| 6.956 | 10.671 |
| 6.957 | 10.676 |
| 6.958 | 10.682 |
| 6.959 | 10.687 |
| 6.96 | 10.692 |
| 6.961 | 10.698 |
| 6.962 | 10.703 |
| 6.963 | 10.708 |
| 6.964 | 10.713 |
| 6.965 | 10.719 |
| 6.966 | 10.724 |
| 6.967 | 10.729 |
| 6.968 | 10.735 |
| 6.969 | 10.74 |
| 6.97 | 10.745 |
| 6.971 | 10.751 |
| 6.972 | 10.756 |
| 6.973 | 10.761 |
| 6.974 | 10.766 |
| 6.975 | 10.772 |
| 6.976 | 10.777 |
| 6.977 | 10.782 |
| 6.978 | 10.788 |
| 6.979 | 10.793 |
| 6.98 | 10.798 |
| 6.981 | 10.804 |
| 6.982 | 10.809 |
| 6.983 | 10.814 |
| 6.984 | 10.82 |
| 6.985 | 10.825 |
| 6.986 | 10.83 |
| 6.987 | 10.836 |
| 6.988 | 10.841 |
| 6.989 | 10.846 |
| 6.99 | 10.852 |
| 6.991 | 10.857 |
| 6.992 | 10.862 |
| 6.993 | 10.868 |
| 6.994 | 10.873 |
| 6.995 | 10.878 |
| 6.996 | 10.884 |
| 6.997 | 10.889 |
| 6.998 | 10.894 |
| 6.999 | 10.9 |
| 7.0 | 10.905 |
| 7.001 | 10.91 |
| 7.002 | 10.916 |
| 7.003 | 10.921 |
| 7.004 | 10.927 |
| 7.005 | 10.932 |
| 7.006 | 10.937 |
| 7.007 | 10.943 |
| 7.008 | 10.948 |
| 7.009 | 10.953 |
| 7.01 | 10.959 |
| 7.011 | 10.964 |
| 7.012 | 10.97 |
| 7.013 | 10.975 |
| 7.014 | 10.98 |
| 7.015 | 10.986 |
| 7.016 | 10.991 |
| 7.017 | 10.996 |
| 7.018 | 11.002 |
| 7.019 | 11.007 |
| 7.02 | 11.012 |
| 7.021 | 11.018 |
| 7.022 | 11.023 |
| 7.023 | 11.029 |
| 7.024 | 11.034 |
| 7.025 | 11.04 |
| 7.026 | 11.045 |
| 7.027 | 11.05 |
| 7.028 | 11.056 |
| 7.029 | 11.061 |
| 7.03 | 11.066 |
| 7.031 | 11.072 |
| 7.032 | 11.077 |
| 7.033 | 11.083 |
| 7.034 | 11.088 |
| 7.035 | 11.093 |
| 7.036 | 11.099 |
| 7.037 | 11.104 |
| 7.038 | 11.11 |
| 7.039 | 11.115 |
| 7.04 | 11.12 |
| 7.041 | 11.126 |
| 7.042 | 11.131 |
| 7.043 | 11.137 |
| 7.044 | 11.142 |
| 7.045 | 11.148 |
| 7.046 | 11.153 |
| 7.047 | 11.158 |
| 7.048 | 11.164 |
| 7.049 | 11.169 |
| 7.05 | 11.175 |
| 7.051 | 11.18 |
| 7.052 | 11.186 |
| 7.053 | 11.191 |
| 7.054 | 11.196 |
| 7.055 | 11.202 |
| 7.056 | 11.207 |
| 7.057 | 11.213 |
| 7.058 | 11.218 |
| 7.059 | 11.224 |
| 7.06 | 11.229 |
| 7.061 | 11.234 |
| 7.062 | 11.24 |
| 7.063 | 11.245 |
| 7.064 | 11.251 |
| 7.065 | 11.256 |
| 7.066 | 11.262 |
| 7.067 | 11.267 |
| 7.068 | 11.273 |
| 7.069 | 11.278 |
| 7.07 | 11.284 |
| 7.071 | 11.289 |
| 7.072 | 11.294 |
| 7.073 | 11.3 |
| 7.074 | 11.305 |
| 7.075 | 11.311 |
| 7.076 | 11.316 |
| 7.077 | 11.322 |
| 7.078 | 11.327 |
| 7.079 | 11.333 |
| 7.08 | 11.338 |
| 7.081 | 11.344 |
| 7.082 | 11.349 |
| 7.083 | 11.355 |
| 7.084 | 11.36 |
| 7.085 | 11.366 |
| 7.086 | 11.371 |
| 7.087 | 11.376 |
| 7.088 | 11.382 |
| 7.089 | 11.388 |
| 7.09 | 11.393 |
| 7.091 | 11.398 |
| 7.092 | 11.404 |
| 7.093 | 11.409 |
| 7.094 | 11.415 |
| 7.095 | 11.42 |
| 7.096 | 11.426 |
| 7.097 | 11.431 |
| 7.098 | 11.437 |
| 7.099 | 11.442 |
| 7.1 | 11.448 |
| 7.101 | 11.453 |
| 7.102 | 11.459 |
| 7.103 | 11.464 |
| 7.104 | 11.47 |
| 7.105 | 11.475 |
| 7.106 | 11.481 |
| 7.107 | 11.486 |
| 7.108 | 11.492 |
| 7.109 | 11.498 |
| 7.11 | 11.503 |
| 7.111 | 11.508 |
| 7.112 | 11.514 |
| 7.113 | 11.52 |
| 7.114 | 11.525 |
| 7.115 | 11.531 |
| 7.116 | 11.536 |
| 7.117 | 11.542 |
| 7.118 | 11.547 |
| 7.119 | 11.553 |
| 7.12 | 11.558 |
| 7.121 | 11.564 |
| 7.122 | 11.569 |
| 7.123 | 11.575 |
| 7.124 | 11.58 |
| 7.125 | 11.586 |
| 7.126 | 11.592 |
| 7.127 | 11.597 |
| 7.128 | 11.603 |
| 7.129 | 11.608 |
| 7.13 | 11.614 |
| 7.131 | 11.619 |
| 7.132 | 11.625 |
| 7.133 | 11.63 |
| 7.134 | 11.636 |
| 7.135 | 11.641 |
| 7.136 | 11.647 |
| 7.137 | 11.652 |
| 7.138 | 11.658 |
| 7.139 | 11.664 |
| 7.14 | 11.669 |
| 7.141 | 11.675 |
| 7.142 | 11.68 |
| 7.143 | 11.686 |
| 7.144 | 11.692 |
| 7.145 | 11.697 |
| 7.146 | 11.703 |
| 7.147 | 11.708 |
| 7.148 | 11.714 |
| 7.149 | 11.719 |
| 7.15 | 11.725 |
| 7.151 | 11.73 |
| 7.152 | 11.736 |
| 7.153 | 11.742 |
| 7.154 | 11.747 |
| 7.155 | 11.753 |
| 7.156 | 11.758 |
| 7.157 | 11.764 |
| 7.158 | 11.77 |
| 7.159 | 11.775 |
| 7.16 | 11.781 |
| 7.161 | 11.786 |
| 7.162 | 11.792 |
| 7.163 | 11.798 |
| 7.164 | 11.803 |
| 7.165 | 11.809 |
| 7.166 | 11.814 |
| 7.167 | 11.82 |
| 7.168 | 11.826 |
| 7.169 | 11.831 |
| 7.17 | 11.837 |
| 7.171 | 11.842 |
| 7.172 | 11.848 |
| 7.173 | 11.854 |
| 7.174 | 11.859 |
| 7.175 | 11.865 |
| 7.176 | 11.87 |
| 7.177 | 11.876 |
| 7.178 | 11.882 |
| 7.179 | 11.887 |
| 7.18 | 11.893 |
| 7.181 | 11.899 |
| 7.182 | 11.904 |
| 7.183 | 11.91 |
| 7.184 | 11.916 |
| 7.185 | 11.921 |
| 7.186 | 11.927 |
| 7.187 | 11.932 |
| 7.188 | 11.938 |
| 7.189 | 11.944 |
| 7.19 | 11.949 |
| 7.191 | 11.955 |
| 7.192 | 11.961 |
| 7.193 | 11.966 |
| 7.194 | 11.972 |
| 7.195 | 11.978 |
| 7.196 | 11.983 |
| 7.197 | 11.989 |
| 7.198 | 11.995 |
| 7.199 | 12 |
| 7.2 | 12.006 |
| 7.201 | 12.012 |
| 7.202 | 12.017 |
| 7.203 | 12.023 |
| 7.204 | 12.028 |
| 7.205 | 12.034 |
| 7.206 | 12.04 |
| 7.207 | 12.046 |
| 7.208 | 12.051 |
| 7.209 | 12.057 |
| 7.21 | 12.062 |
| 7.211 | 12.068 |
| 7.212 | 12.074 |
| 7.213 | 12.08 |
| 7.214 | 12.085 |
| 7.215 | 12.091 |
| 7.216 | 12.097 |
| 7.217 | 12.102 |
| 7.218 | 12.108 |
| 7.219 | 12.114 |
| 7.22 | 12.119 |
| 7.221 | 12.125 |
| 7.222 | 12.131 |
| 7.223 | 12.136 |
| 7.224 | 12.142 |
| 7.225 | 12.148 |
| 7.226 | 12.154 |
| 7.227 | 12.159 |
| 7.228 | 12.165 |
| 7.229 | 12.171 |
| 7.23 | 12.176 |
| 7.231 | 12.182 |
| 7.232 | 12.188 |
| 7.233 | 12.193 |
| 7.234 | 12.199 |
| 7.235 | 12.205 |
| 7.236 | 12.211 |
| 7.237 | 12.216 |
| 7.238 | 12.222 |
| 7.239 | 12.228 |
| 7.24 | 12.233 |
| 7.241 | 12.239 |
| 7.242 | 12.245 |
| 7.243 | 12.251 |
| 7.244 | 12.256 |
| 7.245 | 12.262 |
| 7.246 | 12.268 |
| 7.247 | 12.274 |
| 7.248 | 12.279 |
| 7.249 | 12.285 |
| 7.25 | 12.291 |
| 7.251 | 12.296 |
| 7.252 | 12.302 |
| 7.253 | 12.308 |
| 7.254 | 12.314 |
| 7.255 | 12.319 |
| 7.256 | 12.325 |
| 7.257 | 12.331 |
| 7.258 | 12.337 |
| 7.259 | 12.342 |
| 7.26 | 12.348 |
| 7.261 | 12.354 |
| 7.262 | 12.36 |
| 7.263 | 12.365 |
| 7.264 | 12.371 |
| 7.265 | 12.377 |
| 7.266 | 12.383 |
| 7.267 | 12.388 |
| 7.268 | 12.394 |
| 7.269 | 12.4 |
| 7.27 | 12.406 |
| 7.271 | 12.412 |
| 7.272 | 12.417 |
| 7.273 | 12.423 |
| 7.274 | 12.429 |
| 7.275 | 12.435 |
| 7.276 | 12.44 |
| 7.277 | 12.446 |
| 7.278 | 12.452 |
| 7.279 | 12.458 |
| 7.28 | 12.464 |
| 7.281 | 12.469 |
| 7.282 | 12.475 |
| 7.283 | 12.481 |
| 7.284 | 12.487 |
| 7.285 | 12.492 |
| 7.286 | 12.498 |
| 7.287 | 12.504 |
| 7.288 | 12.51 |
| 7.289 | 12.516 |
| 7.29 | 12.522 |
| 7.291 | 12.527 |
| 7.292 | 12.533 |
| 7.293 | 12.539 |
| 7.294 | 12.545 |
| 7.295 | 12.55 |
| 7.296 | 12.556 |
| 7.297 | 12.562 |
| 7.298 | 12.568 |
| 7.299 | 12.574 |
| 7.3 | 12.58 |
| 7.301 | 12.585 |
| 7.302 | 12.591 |
| 7.303 | 12.597 |
| 7.304 | 12.603 |
| 7.305 | 12.609 |
| 7.306 | 12.614 |
| 7.307 | 12.62 |
| 7.308 | 12.626 |
| 7.309 | 12.632 |
| 7.31 | 12.638 |
| 7.311 | 12.644 |
| 7.312 | 12.65 |
| 7.313 | 12.655 |
| 7.314 | 12.661 |
| 7.315 | 12.667 |
| 7.316 | 12.673 |
| 7.317 | 12.679 |
| 7.318 | 12.685 |
| 7.319 | 12.69 |
| 7.32 | 12.696 |
| 7.321 | 12.702 |
| 7.322 | 12.708 |
| 7.323 | 12.714 |
| 7.324 | 12.72 |
| 7.325 | 12.726 |
| 7.326 | 12.731 |
| 7.327 | 12.737 |
| 7.328 | 12.743 |
| 7.329 | 12.749 |
| 7.33 | 12.755 |
| 7.331 | 12.761 |
| 7.332 | 12.767 |
| 7.333 | 12.772 |
| 7.334 | 12.778 |
| 7.335 | 12.784 |
| 7.336 | 12.79 |
| 7.337 | 12.796 |
| 7.338 | 12.802 |
| 7.339 | 12.808 |
| 7.34 | 12.814 |
| 7.341 | 12.82 |
| 7.342 | 12.825 |
| 7.343 | 12.831 |
| 7.344 | 12.837 |
| 7.345 | 12.843 |
| 7.346 | 12.849 |
| 7.347 | 12.855 |
| 7.348 | 12.861 |
| 7.349 | 12.867 |
| 7.35 | 12.872 |
| 7.351 | 12.878 |
| 7.352 | 12.884 |
| 7.353 | 12.89 |
| 7.354 | 12.896 |
| 7.355 | 12.902 |
| 7.356 | 12.908 |
| 7.357 | 12.914 |
| 7.358 | 12.92 |
| 7.359 | 12.926 |
| 7.36 | 12.932 |
| 7.361 | 12.938 |
| 7.362 | 12.943 |
| 7.363 | 12.949 |
| 7.364 | 12.955 |
| 7.365 | 12.961 |
| 7.366 | 12.967 |
| 7.367 | 12.973 |
| 7.368 | 12.979 |
| 7.369 | 12.985 |
| 7.37 | 12.991 |
| 7.371 | 12.997 |
| 7.372 | 13.003 |
| 7.373 | 13.009 |
| 7.374 | 13.015 |
| 7.375 | 13.02 |
| 7.376 | 13.026 |
| 7.377 | 13.032 |
| 7.378 | 13.038 |
| 7.379 | 13.044 |
| 7.38 | 13.05 |
| 7.381 | 13.056 |
| 7.382 | 13.062 |
| 7.383 | 13.068 |
| 7.384 | 13.074 |
| 7.385 | 13.08 |
| 7.386 | 13.086 |
| 7.387 | 13.092 |
| 7.388 | 13.098 |
| 7.389 | 13.104 |
| 7.39 | 13.11 |
| 7.391 | 13.116 |
| 7.392 | 13.122 |
| 7.393 | 13.128 |
| 7.394 | 13.134 |
| 7.395 | 13.14 |
| 7.396 | 13.146 |
| 7.397 | 13.152 |
| 7.398 | 13.158 |
| 7.399 | 13.164 |
| 7.4 | 13.17 |
| 7.401 | 13.176 |
| 7.402 | 13.182 |
| 7.403 | 13.188 |
| 7.404 | 13.194 |
| 7.405 | 13.2 |
| 7.406 | 13.206 |
| 7.407 | 13.212 |
| 7.408 | 13.218 |
| 7.409 | 13.224 |
| 7.41 | 13.229 |
| 7.411 | 13.235 |
| 7.412 | 13.242 |
| 7.413 | 13.248 |
| 7.414 | 13.254 |
| 7.415 | 13.26 |
| 7.416 | 13.266 |
| 7.417 | 13.272 |
| 7.418 | 13.278 |
| 7.419 | 13.284 |
| 7.42 | 13.29 |
| 7.421 | 13.296 |
| 7.422 | 13.302 |
| 7.423 | 13.308 |
| 7.424 | 13.314 |
| 7.425 | 13.32 |
| 7.426 | 13.326 |
| 7.427 | 13.332 |
| 7.428 | 13.338 |
| 7.429 | 13.344 |
| 7.43 | 13.35 |
| 7.431 | 13.356 |
| 7.432 | 13.362 |
| 7.433 | 13.368 |
| 7.434 | 13.374 |
| 7.435 | 13.38 |
| 7.436 | 13.386 |
| 7.437 | 13.392 |
| 7.438 | 13.398 |
| 7.439 | 13.404 |
| 7.44 | 13.41 |
| 7.441 | 13.416 |
| 7.442 | 13.422 |
| 7.443 | 13.428 |
| 7.444 | 13.434 |
| 7.445 | 13.44 |
| 7.446 | 13.446 |
| 7.447 | 13.453 |
| 7.448 | 13.459 |
| 7.449 | 13.465 |
| 7.45 | 13.471 |
| 7.451 | 13.477 |
| 7.452 | 13.483 |
| 7.453 | 13.489 |
| 7.454 | 13.495 |
| 7.455 | 13.501 |
| 7.456 | 13.507 |
| 7.457 | 13.513 |
| 7.458 | 13.519 |
| 7.459 | 13.525 |
| 7.46 | 13.532 |
| 7.461 | 13.538 |
| 7.462 | 13.544 |
| 7.463 | 13.55 |
| 7.464 | 13.556 |
| 7.465 | 13.562 |
| 7.466 | 13.568 |
| 7.467 | 13.574 |
| 7.468 | 13.58 |
| 7.469 | 13.586 |
| 7.47 | 13.592 |
| 7.471 | 13.599 |
| 7.472 | 13.605 |
| 7.473 | 13.611 |
| 7.474 | 13.617 |
| 7.475 | 13.623 |
| 7.476 | 13.629 |
| 7.477 | 13.635 |
| 7.478 | 13.641 |
| 7.479 | 13.647 |
| 7.48 | 13.654 |
| 7.481 | 13.66 |
| 7.482 | 13.666 |
| 7.483 | 13.672 |
| 7.484 | 13.678 |
| 7.485 | 13.684 |
| 7.486 | 13.69 |
| 7.487 | 13.696 |
| 7.488 | 13.703 |
| 7.489 | 13.709 |
| 7.49 | 13.715 |
| 7.491 | 13.721 |
| 7.492 | 13.727 |
| 7.493 | 13.733 |
| 7.494 | 13.739 |
| 7.495 | 13.746 |
| 7.496 | 13.752 |
| 7.497 | 13.758 |
| 7.498 | 13.764 |
| 7.499 | 13.77 |
| 7.5 | 13.776 |
| 7.501 | 13.782 |
| 7.502 | 13.789 |
| 7.503 | 13.795 |
| 7.504 | 13.801 |
| 7.505 | 13.807 |
| 7.506 | 13.813 |
| 7.507 | 13.819 |
| 7.508 | 13.826 |
| 7.509 | 13.832 |
| 7.51 | 13.838 |
| 7.511 | 13.844 |
| 7.512 | 13.85 |
| 7.513 | 13.856 |
| 7.514 | 13.863 |
| 7.515 | 13.869 |
| 7.516 | 13.875 |
| 7.517 | 13.881 |
| 7.518 | 13.887 |
| 7.519 | 13.894 |
| 7.52 | 13.9 |
| 7.521 | 13.906 |
| 7.522 | 13.912 |
| 7.523 | 13.918 |
| 7.524 | 13.924 |
| 7.525 | 13.931 |
| 7.526 | 13.937 |
| 7.527 | 13.943 |
| 7.528 | 13.949 |
| 7.529 | 13.955 |
| 7.53 | 13.962 |
| 7.531 | 13.968 |
| 7.532 | 13.974 |
| 7.533 | 13.98 |
| 7.534 | 13.986 |
| 7.535 | 13.993 |
| 7.536 | 13.999 |
| 7.537 | 14.005 |
| 7.538 | 14.011 |
| 7.539 | 14.018 |
| 7.54 | 14.024 |
| 7.541 | 14.03 |
| 7.542 | 14.036 |
| 7.543 | 14.042 |
| 7.544 | 14.049 |
| 7.545 | 14.055 |
| 7.546 | 14.061 |
| 7.547 | 14.067 |
| 7.548 | 14.074 |
| 7.549 | 14.08 |
| 7.55 | 14.086 |
| 7.551 | 14.092 |
| 7.552 | 14.099 |
| 7.553 | 14.105 |
| 7.554 | 14.111 |
| 7.555 | 14.117 |
| 7.556 | 14.124 |
| 7.557 | 14.13 |
| 7.558 | 14.136 |
| 7.559 | 14.142 |
| 7.56 | 14.149 |
| 7.561 | 14.155 |
| 7.562 | 14.161 |
| 7.563 | 14.167 |
| 7.564 | 14.174 |
| 7.565 | 14.18 |
| 7.566 | 14.186 |
| 7.567 | 14.192 |
| 7.568 | 14.199 |
| 7.569 | 14.205 |
| 7.57 | 14.211 |
| 7.571 | 14.218 |
| 7.572 | 14.224 |
| 7.573 | 14.23 |
| 7.574 | 14.236 |
| 7.575 | 14.243 |
| 7.576 | 14.249 |
| 7.577 | 14.255 |
| 7.578 | 14.262 |
| 7.579 | 14.268 |
| 7.58 | 14.274 |
| 7.581 | 14.28 |
| 7.582 | 14.287 |
| 7.583 | 14.293 |
| 7.584 | 14.299 |
| 7.585 | 14.306 |
| 7.586 | 14.312 |
| 7.587 | 14.318 |
| 7.588 | 14.324 |
| 7.589 | 14.331 |
| 7.59 | 14.337 |
| 7.591 | 14.344 |
| 7.592 | 14.35 |
| 7.593 | 14.356 |
| 7.594 | 14.362 |
| 7.595 | 14.369 |
| 7.596 | 14.375 |
| 7.597 | 14.381 |
| 7.598 | 14.388 |
| 7.599 | 14.394 |
| 7.6 | 14.4 |
| 7.601 | 14.407 |
| 7.602 | 14.413 |
| 7.603 | 14.419 |
| 7.604 | 14.426 |
| 7.605 | 14.432 |
| 7.606 | 14.438 |
| 7.607 | 14.445 |
| 7.608 | 14.451 |
| 7.609 | 14.457 |
| 7.61 | 14.464 |
| 7.611 | 14.47 |
| 7.612 | 14.476 |
| 7.613 | 14.483 |
| 7.614 | 14.489 |
| 7.615 | 14.496 |
| 7.616 | 14.502 |
| 7.617 | 14.508 |
| 7.618 | 14.515 |
| 7.619 | 14.521 |
| 7.62 | 14.527 |
| 7.621 | 14.534 |
| 7.622 | 14.54 |
| 7.623 | 14.546 |
| 7.624 | 14.553 |
| 7.625 | 14.559 |
| 7.626 | 14.566 |
| 7.627 | 14.572 |
| 7.628 | 14.578 |
| 7.629 | 14.585 |
| 7.63 | 14.591 |
| 7.631 | 14.597 |
| 7.632 | 14.604 |
| 7.633 | 14.61 |
| 7.634 | 14.617 |
| 7.635 | 14.623 |
| 7.636 | 14.629 |
| 7.637 | 14.636 |
| 7.638 | 14.642 |
| 7.639 | 14.649 |
| 7.64 | 14.655 |
| 7.641 | 14.661 |
| 7.642 | 14.668 |
| 7.643 | 14.674 |
| 7.644 | 14.681 |
| 7.645 | 14.687 |
| 7.646 | 14.693 |
| 7.647 | 14.7 |
| 7.648 | 14.706 |
| 7.649 | 14.713 |
| 7.65 | 14.719 |
| 7.651 | 14.726 |
| 7.652 | 14.732 |
| 7.653 | 14.738 |
| 7.654 | 14.745 |
| 7.655 | 14.751 |
| 7.656 | 14.758 |
| 7.657 | 14.764 |
| 7.658 | 14.77 |
| 7.659 | 14.777 |
| 7.66 | 14.783 |
| 7.661 | 14.79 |
| 7.662 | 14.796 |
| 7.663 | 14.803 |
| 7.664 | 14.809 |
| 7.665 | 14.816 |
| 7.666 | 14.822 |
| 7.667 | 14.828 |
| 7.668 | 14.835 |
| 7.669 | 14.841 |
| 7.67 | 14.848 |
| 7.671 | 14.854 |
| 7.672 | 14.861 |
| 7.673 | 14.867 |
| 7.674 | 14.874 |
| 7.675 | 14.88 |
| 7.676 | 14.887 |
| 7.677 | 14.893 |
| 7.678 | 14.9 |
| 7.679 | 14.906 |
| 7.68 | 14.912 |
| 7.681 | 14.919 |
| 7.682 | 14.925 |
| 7.683 | 14.932 |
| 7.684 | 14.938 |
| 7.685 | 14.945 |
| 7.686 | 14.951 |
| 7.687 | 14.958 |
| 7.688 | 14.964 |
| 7.689 | 14.971 |
| 7.69 | 14.977 |
| 7.691 | 14.984 |
| 7.692 | 14.99 |
| 7.693 | 14.997 |
| 7.694 | 15.003 |
| 7.695 | 15.01 |
| 7.696 | 15.016 |
| 7.697 | 15.023 |
| 7.698 | 15.029 |
| 7.699 | 15.036 |
| 7.7 | 15.042 |
| 7.701 | 15.049 |
| 7.702 | 15.055 |
| 7.703 | 15.062 |
| 7.704 | 15.068 |
| 7.705 | 15.075 |
| 7.706 | 15.081 |
| 7.707 | 15.088 |
| 7.708 | 15.094 |
| 7.709 | 15.101 |
| 7.71 | 15.108 |
| 7.711 | 15.114 |
| 7.712 | 15.121 |
| 7.713 | 15.127 |
| 7.714 | 15.134 |
| 7.715 | 15.14 |
| 7.716 | 15.147 |
| 7.717 | 15.153 |
| 7.718 | 15.16 |
| 7.719 | 15.166 |
| 7.72 | 15.173 |
| 7.721 | 15.18 |
| 7.722 | 15.186 |
| 7.723 | 15.193 |
| 7.724 | 15.199 |
| 7.725 | 15.206 |
| 7.726 | 15.212 |
| 7.727 | 15.219 |
| 7.728 | 15.225 |
| 7.729 | 15.232 |
| 7.73 | 15.238 |
| 7.731 | 15.245 |
| 7.732 | 15.252 |
| 7.733 | 15.258 |
| 7.734 | 15.265 |
| 7.735 | 15.271 |
| 7.736 | 15.278 |
| 7.737 | 15.284 |
| 7.738 | 15.291 |
| 7.739 | 15.298 |
| 7.74 | 15.304 |
| 7.741 | 15.311 |
| 7.742 | 15.318 |
| 7.743 | 15.324 |
| 7.744 | 15.331 |
| 7.745 | 15.337 |
| 7.746 | 15.344 |
| 7.747 | 15.35 |
| 7.748 | 15.357 |
| 7.749 | 15.364 |
| 7.75 | 15.37 |
| 7.751 | 15.377 |
| 7.752 | 15.384 |
| 7.753 | 15.39 |
| 7.754 | 15.397 |
| 7.755 | 15.403 |
| 7.756 | 15.41 |
| 7.757 | 15.416 |
| 7.758 | 15.423 |
| 7.759 | 15.43 |
| 7.76 | 15.436 |
| 7.761 | 15.443 |
| 7.762 | 15.45 |
| 7.763 | 15.456 |
| 7.764 | 15.463 |
| 7.765 | 15.47 |
| 7.766 | 15.476 |
| 7.767 | 15.483 |
| 7.768 | 15.489 |
| 7.769 | 15.496 |
| 7.77 | 15.503 |
| 7.771 | 15.509 |
| 7.772 | 15.516 |
| 7.773 | 15.523 |
| 7.774 | 15.529 |
| 7.775 | 15.536 |
| 7.776 | 15.543 |
| 7.777 | 15.549 |
| 7.778 | 15.556 |
| 7.779 | 15.563 |
| 7.78 | 15.569 |
| 7.781 | 15.576 |
| 7.782 | 15.583 |
| 7.783 | 15.589 |
| 7.784 | 15.596 |
| 7.785 | 15.603 |
| 7.786 | 15.609 |
| 7.787 | 15.616 |
| 7.788 | 15.623 |
| 7.789 | 15.629 |
| 7.79 | 15.636 |
| 7.791 | 15.643 |
| 7.792 | 15.649 |
| 7.793 | 15.656 |
| 7.794 | 15.663 |
| 7.795 | 15.669 |
| 7.796 | 15.676 |
| 7.797 | 15.683 |
| 7.798 | 15.69 |
| 7.799 | 15.696 |
| 7.8 | 15.703 |
| 7.801 | 15.71 |
| 7.802 | 15.716 |
| 7.803 | 15.723 |
| 7.804 | 15.73 |
| 7.805 | 15.736 |
| 7.806 | 15.743 |
| 7.807 | 15.75 |
| 7.808 | 15.756 |
| 7.809 | 15.763 |
| 7.81 | 15.77 |
| 7.811 | 15.777 |
| 7.812 | 15.783 |
| 7.813 | 15.79 |
| 7.814 | 15.797 |
| 7.815 | 15.804 |
| 7.816 | 15.81 |
| 7.817 | 15.817 |
| 7.818 | 15.824 |
| 7.819 | 15.83 |
| 7.82 | 15.837 |
| 7.821 | 15.844 |
| 7.822 | 15.851 |
| 7.823 | 15.858 |
| 7.824 | 15.864 |
| 7.825 | 15.871 |
| 7.826 | 15.878 |
| 7.827 | 15.884 |
| 7.828 | 15.891 |
| 7.829 | 15.898 |
| 7.83 | 15.905 |
| 7.831 | 15.912 |
| 7.832 | 15.918 |
| 7.833 | 15.925 |
| 7.834 | 15.932 |
| 7.835 | 15.938 |
| 7.836 | 15.945 |
| 7.837 | 15.952 |
| 7.838 | 15.959 |
| 7.839 | 15.966 |
| 7.84 | 15.972 |
| 7.841 | 15.979 |
| 7.842 | 15.986 |
| 7.843 | 15.993 |
| 7.844 | 16 |
| 7.845 | 16.006 |
| 7.846 | 16.013 |
| 7.847 | 16.02 |
| 7.848 | 16.027 |
| 7.849 | 16.034 |
| 7.85 | 16.04 |
| 7.851 | 16.047 |
| 7.852 | 16.054 |
| 7.853 | 16.061 |
| 7.854 | 16.067 |
| 7.855 | 16.074 |
| 7.856 | 16.081 |
| 7.857 | 16.088 |
| 7.858 | 16.095 |
| 7.859 | 16.102 |
| 7.86 | 16.108 |
| 7.861 | 16.115 |
| 7.862 | 16.122 |
| 7.863 | 16.129 |
| 7.864 | 16.136 |
| 7.865 | 16.142 |
| 7.866 | 16.149 |
| 7.867 | 16.156 |
| 7.868 | 16.163 |
| 7.869 | 16.17 |
| 7.87 | 16.177 |
| 7.871 | 16.183 |
| 7.872 | 16.19 |
| 7.873 | 16.197 |
| 7.874 | 16.204 |
| 7.875 | 16.211 |
| 7.876 | 16.218 |
| 7.877 | 16.224 |
| 7.878 | 16.231 |
| 7.879 | 16.238 |
| 7.88 | 16.245 |
| 7.881 | 16.252 |
| 7.882 | 16.259 |
| 7.883 | 16.266 |
| 7.884 | 16.272 |
| 7.885 | 16.279 |
| 7.886 | 16.286 |
| 7.887 | 16.293 |
| 7.888 | 16.3 |
| 7.889 | 16.307 |
| 7.89 | 16.314 |
| 7.891 | 16.321 |
| 7.892 | 16.328 |
| 7.893 | 16.334 |
| 7.894 | 16.341 |
| 7.895 | 16.348 |
| 7.896 | 16.355 |
| 7.897 | 16.362 |
| 7.898 | 16.369 |
| 7.899 | 16.376 |
| 7.9 | 16.383 |
| 7.901 | 16.39 |
| 7.902 | 16.396 |
| 7.903 | 16.403 |
| 7.904 | 16.41 |
| 7.905 | 16.417 |
| 7.906 | 16.424 |
| 7.907 | 16.431 |
| 7.908 | 16.438 |
| 7.909 | 16.445 |
| 7.91 | 16.452 |
| 7.911 | 16.458 |
| 7.912 | 16.466 |
| 7.913 | 16.472 |
| 7.914 | 16.479 |
| 7.915 | 16.486 |
| 7.916 | 16.493 |
| 7.917 | 16.5 |
| 7.918 | 16.507 |
| 7.919 | 16.514 |
| 7.92 | 16.521 |
| 7.921 | 16.528 |
| 7.922 | 16.535 |
| 7.923 | 16.542 |
| 7.924 | 16.549 |
| 7.925 | 16.556 |
| 7.926 | 16.562 |
| 7.927 | 16.57 |
| 7.928 | 16.576 |
| 7.929 | 16.583 |
| 7.93 | 16.59 |
| 7.931 | 16.597 |
| 7.932 | 16.604 |
| 7.933 | 16.611 |
| 7.934 | 16.618 |
| 7.935 | 16.625 |
| 7.936 | 16.632 |
| 7.937 | 16.639 |
| 7.938 | 16.646 |
| 7.939 | 16.653 |
| 7.94 | 16.66 |
| 7.941 | 16.667 |
| 7.942 | 16.674 |
| 7.943 | 16.681 |
| 7.944 | 16.688 |
| 7.945 | 16.695 |
| 7.946 | 16.702 |
| 7.947 | 16.709 |
| 7.948 | 16.716 |
| 7.949 | 16.723 |
| 7.95 | 16.73 |
| 7.951 | 16.737 |
| 7.952 | 16.744 |
| 7.953 | 16.751 |
| 7.954 | 16.758 |
| 7.955 | 16.765 |
| 7.956 | 16.772 |
| 7.957 | 16.779 |
| 7.958 | 16.786 |
| 7.959 | 16.793 |
| 7.96 | 16.8 |
| 7.961 | 16.807 |
| 7.962 | 16.814 |
| 7.963 | 16.821 |
| 7.964 | 16.828 |
| 7.965 | 16.835 |
| 7.966 | 16.842 |
| 7.967 | 16.849 |
| 7.968 | 16.856 |
| 7.969 | 16.863 |
| 7.97 | 16.87 |
| 7.971 | 16.877 |
| 7.972 | 16.884 |
| 7.973 | 16.891 |
| 7.974 | 16.898 |
| 7.975 | 16.905 |
| 7.976 | 16.912 |
| 7.977 | 16.92 |
| 7.978 | 16.926 |
| 7.979 | 16.934 |
| 7.98 | 16.941 |
| 7.981 | 16.948 |
| 7.982 | 16.955 |
| 7.983 | 16.962 |
| 7.984 | 16.969 |
| 7.985 | 16.976 |
| 7.986 | 16.983 |
| 7.987 | 16.99 |
| 7.988 | 16.997 |
| 7.989 | 17.004 |
| 7.99 | 17.011 |
| 7.991 | 17.018 |
| 7.992 | 17.025 |
| 7.993 | 17.032 |
| 7.994 | 17.04 |
| 7.995 | 17.047 |
| 7.996 | 17.054 |
| 7.997 | 17.061 |
| 7.998 | 17.068 |
| 7.999 | 17.075 |
| 8.0 | 17.082 |